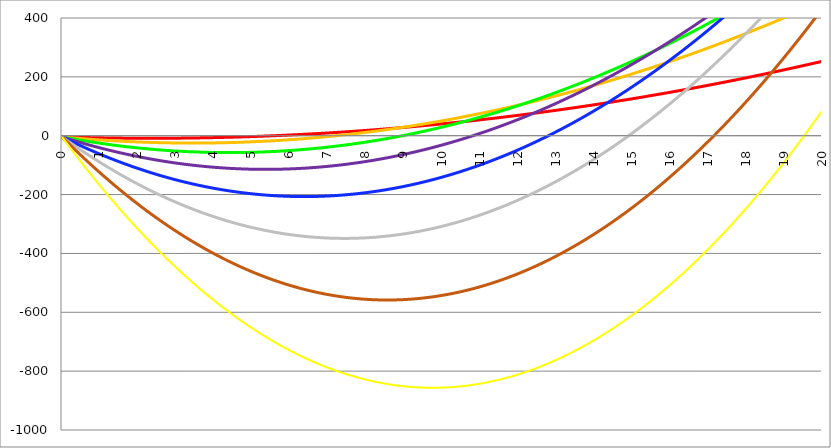
| Category | Series 1 | Series 0 | Series 3 | Series 4 | Series 5 | Series 2 | Series 6 | Series 7 |
|---|---|---|---|---|---|---|---|---|
| 0.0 | -4 | -4 | -4 | -4 | -4 | -4 | -4 | -4 |
| 0.01 | -4.04 | -4.121 | -4.242 | -4.411 | -4.636 | -4.927 | -5.294 | -5.747 |
| 0.02 | -4.079 | -4.242 | -4.484 | -4.822 | -5.272 | -5.853 | -6.586 | -7.492 |
| 0.03 | -4.118 | -4.363 | -4.726 | -5.231 | -5.906 | -6.778 | -7.877 | -9.236 |
| 0.04 | -4.157 | -4.483 | -4.967 | -5.64 | -6.54 | -7.702 | -9.167 | -10.977 |
| 0.05 | -4.196 | -4.603 | -5.207 | -6.049 | -7.172 | -8.624 | -10.454 | -12.717 |
| 0.06 | -4.235 | -4.722 | -5.447 | -6.456 | -7.803 | -9.545 | -11.741 | -14.455 |
| 0.07 | -4.274 | -4.842 | -5.686 | -6.863 | -8.434 | -10.465 | -13.026 | -16.192 |
| 0.08 | -4.312 | -4.961 | -5.924 | -7.268 | -9.063 | -11.383 | -14.309 | -17.926 |
| 0.09 | -4.351 | -5.079 | -6.162 | -7.674 | -9.691 | -12.3 | -15.591 | -19.659 |
| 0.1 | -4.389 | -5.197 | -6.4 | -8.078 | -10.319 | -13.216 | -16.871 | -21.39 |
| 0.11 | -4.427 | -5.315 | -6.637 | -8.481 | -10.945 | -14.131 | -18.15 | -23.119 |
| 0.12 | -4.464 | -5.432 | -6.873 | -8.884 | -11.571 | -15.045 | -19.427 | -24.846 |
| 0.13 | -4.502 | -5.549 | -7.109 | -9.286 | -12.195 | -15.957 | -20.703 | -26.572 |
| 0.14 | -4.539 | -5.666 | -7.344 | -9.688 | -12.818 | -16.868 | -21.977 | -28.296 |
| 0.15 | -4.577 | -5.782 | -7.579 | -10.088 | -13.441 | -17.778 | -23.25 | -30.018 |
| 0.16 | -4.614 | -5.898 | -7.813 | -10.488 | -14.062 | -18.686 | -24.521 | -31.738 |
| 0.17 | -4.651 | -6.014 | -8.047 | -10.887 | -14.682 | -19.593 | -25.791 | -33.456 |
| 0.18 | -4.688 | -6.129 | -8.28 | -11.285 | -15.302 | -20.5 | -27.059 | -35.173 |
| 0.19 | -4.724 | -6.244 | -8.513 | -11.682 | -15.92 | -21.404 | -28.326 | -36.888 |
| 0.2 | -4.761 | -6.359 | -8.745 | -12.079 | -16.538 | -22.308 | -29.591 | -38.601 |
| 0.21 | -4.797 | -6.473 | -8.976 | -12.475 | -17.154 | -23.21 | -30.855 | -40.312 |
| 0.22 | -4.833 | -6.587 | -9.207 | -12.87 | -17.769 | -24.111 | -32.117 | -42.021 |
| 0.23 | -4.869 | -6.701 | -9.437 | -13.264 | -18.384 | -25.011 | -33.377 | -43.729 |
| 0.24 | -4.905 | -6.814 | -9.667 | -13.658 | -18.997 | -25.91 | -34.637 | -45.435 |
| 0.25 | -4.94 | -6.927 | -9.896 | -14.051 | -19.609 | -26.807 | -35.894 | -47.139 |
| 0.26 | -4.976 | -7.039 | -10.125 | -14.443 | -20.221 | -27.703 | -37.15 | -48.841 |
| 0.27 | -5.011 | -7.151 | -10.353 | -14.834 | -20.831 | -28.598 | -38.405 | -50.542 |
| 0.28 | -5.046 | -7.263 | -10.581 | -15.225 | -21.441 | -29.491 | -39.658 | -52.24 |
| 0.29 | -5.081 | -7.375 | -10.808 | -15.614 | -22.049 | -30.384 | -40.91 | -53.937 |
| 0.3 | -5.116 | -7.486 | -11.034 | -16.003 | -22.656 | -31.275 | -42.16 | -55.632 |
| 0.31 | -5.15 | -7.596 | -11.26 | -16.392 | -23.263 | -32.164 | -43.408 | -57.325 |
| 0.32 | -5.185 | -7.707 | -11.485 | -16.779 | -23.868 | -33.053 | -44.655 | -59.017 |
| 0.33 | -5.219 | -7.817 | -11.71 | -17.166 | -24.472 | -33.94 | -45.901 | -60.707 |
| 0.34 | -5.253 | -7.927 | -11.934 | -17.552 | -25.076 | -34.826 | -47.145 | -62.395 |
| 0.35 | -5.287 | -8.036 | -12.158 | -17.937 | -25.678 | -35.711 | -48.387 | -64.081 |
| 0.36 | -5.321 | -8.145 | -12.381 | -18.321 | -26.28 | -36.595 | -49.628 | -65.765 |
| 0.37 | -5.354 | -8.254 | -12.604 | -18.705 | -26.88 | -37.477 | -50.868 | -67.448 |
| 0.38 | -5.388 | -8.362 | -12.826 | -19.088 | -27.479 | -38.358 | -52.106 | -69.128 |
| 0.39 | -5.421 | -8.47 | -13.047 | -19.47 | -28.078 | -39.238 | -53.342 | -70.807 |
| 0.4 | -5.454 | -8.577 | -13.268 | -19.851 | -28.675 | -40.116 | -54.577 | -72.484 |
| 0.41 | -5.487 | -8.684 | -13.489 | -20.231 | -29.271 | -40.994 | -55.811 | -74.16 |
| 0.42 | -5.52 | -8.791 | -13.709 | -20.611 | -29.867 | -41.87 | -57.042 | -75.833 |
| 0.43 | -5.552 | -8.898 | -13.928 | -20.99 | -30.461 | -42.745 | -58.273 | -77.505 |
| 0.44 | -5.584 | -9.004 | -14.147 | -21.368 | -31.055 | -43.618 | -59.502 | -79.175 |
| 0.45 | -5.617 | -9.11 | -14.365 | -21.746 | -31.647 | -44.491 | -60.729 | -80.843 |
| 0.46 | -5.649 | -9.215 | -14.582 | -22.123 | -32.238 | -45.362 | -61.955 | -82.51 |
| 0.47 | -5.681 | -9.32 | -14.799 | -22.498 | -32.829 | -46.232 | -63.179 | -84.174 |
| 0.48 | -5.712 | -9.425 | -15.016 | -22.874 | -33.418 | -47.1 | -64.402 | -85.837 |
| 0.49 | -5.744 | -9.53 | -15.232 | -23.248 | -34.006 | -47.968 | -65.624 | -87.498 |
| 0.5 | -5.775 | -9.634 | -15.447 | -23.622 | -34.594 | -48.834 | -66.843 | -89.158 |
| 0.51 | -5.807 | -9.737 | -15.662 | -23.994 | -35.18 | -49.698 | -68.062 | -90.815 |
| 0.52 | -5.838 | -9.841 | -15.877 | -24.367 | -35.766 | -50.562 | -69.278 | -92.471 |
| 0.53 | -5.869 | -9.944 | -16.09 | -24.738 | -36.35 | -51.424 | -70.494 | -94.125 |
| 0.54 | -5.899 | -10.046 | -16.304 | -25.108 | -36.933 | -52.286 | -71.708 | -95.777 |
| 0.55 | -5.93 | -10.149 | -16.516 | -25.478 | -37.516 | -53.145 | -72.92 | -97.427 |
| 0.56 | -5.96 | -10.25 | -16.728 | -25.847 | -38.097 | -54.004 | -74.131 | -99.075 |
| 0.57 | -5.99 | -10.352 | -16.94 | -26.215 | -38.677 | -54.861 | -75.34 | -100.722 |
| 0.58 | -6.02 | -10.453 | -17.151 | -26.583 | -39.257 | -55.717 | -76.548 | -102.367 |
| 0.59 | -6.05 | -10.554 | -17.361 | -26.95 | -39.835 | -56.572 | -77.754 | -104.01 |
| 0.6 | -6.08 | -10.655 | -17.571 | -27.316 | -40.413 | -57.426 | -78.958 | -105.652 |
| 0.61 | -6.11 | -10.755 | -17.781 | -27.681 | -40.989 | -58.278 | -80.162 | -107.291 |
| 0.62 | -6.139 | -10.855 | -17.989 | -28.045 | -41.564 | -59.129 | -81.363 | -108.929 |
| 0.63 | -6.168 | -10.954 | -18.198 | -28.409 | -42.139 | -59.979 | -82.563 | -110.565 |
| 0.64 | -6.197 | -11.053 | -18.405 | -28.772 | -42.712 | -60.828 | -83.762 | -112.199 |
| 0.65 | -6.226 | -11.152 | -18.612 | -29.134 | -43.284 | -61.675 | -84.959 | -113.831 |
| 0.66 | -6.255 | -11.25 | -18.819 | -29.495 | -43.856 | -62.521 | -86.155 | -115.462 |
| 0.67 | -6.283 | -11.349 | -19.025 | -29.856 | -44.426 | -63.366 | -87.349 | -117.091 |
| 0.68 | -6.312 | -11.446 | -19.231 | -30.215 | -44.996 | -64.21 | -88.542 | -118.718 |
| 0.69 | -6.34 | -11.544 | -19.436 | -30.574 | -45.564 | -65.052 | -89.733 | -120.343 |
| 0.7 | -6.368 | -11.641 | -19.64 | -30.933 | -46.131 | -65.893 | -90.922 | -121.966 |
| 0.71 | -6.396 | -11.737 | -19.844 | -31.29 | -46.698 | -66.733 | -92.11 | -123.588 |
| 0.72 | -6.423 | -11.834 | -20.047 | -31.647 | -47.263 | -67.572 | -93.297 | -125.208 |
| 0.73 | -6.451 | -11.93 | -20.25 | -32.003 | -47.827 | -68.409 | -94.482 | -126.826 |
| 0.74 | -6.478 | -12.025 | -20.452 | -32.358 | -48.391 | -69.246 | -95.666 | -128.442 |
| 0.75 | -6.506 | -12.12 | -20.654 | -32.712 | -48.953 | -70.08 | -96.848 | -130.056 |
| 0.76 | -6.533 | -12.215 | -20.855 | -33.066 | -49.515 | -70.914 | -98.028 | -131.669 |
| 0.77 | -6.559 | -12.31 | -21.055 | -33.419 | -50.075 | -71.746 | -99.207 | -133.28 |
| 0.78 | -6.586 | -12.404 | -21.255 | -33.771 | -50.634 | -72.578 | -100.385 | -134.889 |
| 0.79 | -6.613 | -12.498 | -21.454 | -34.122 | -51.193 | -73.408 | -101.56 | -136.496 |
| 0.8 | -6.639 | -12.591 | -21.653 | -34.473 | -51.75 | -74.236 | -102.735 | -138.102 |
| 0.81 | -6.665 | -12.684 | -21.852 | -34.823 | -52.306 | -75.064 | -103.908 | -139.705 |
| 0.82 | -6.691 | -12.777 | -22.049 | -35.172 | -52.862 | -75.89 | -105.079 | -141.307 |
| 0.83 | -6.717 | -12.87 | -22.247 | -35.52 | -53.416 | -76.715 | -106.249 | -142.907 |
| 0.84 | -6.743 | -12.962 | -22.443 | -35.868 | -53.97 | -77.538 | -107.418 | -144.506 |
| 0.85 | -6.768 | -13.054 | -22.639 | -36.214 | -54.522 | -78.361 | -108.585 | -146.102 |
| 0.86 | -6.794 | -13.145 | -22.835 | -36.56 | -55.073 | -79.182 | -109.75 | -147.697 |
| 0.87 | -6.819 | -13.236 | -23.03 | -36.905 | -55.624 | -80.002 | -110.914 | -149.29 |
| 0.88 | -6.844 | -13.327 | -23.224 | -37.25 | -56.173 | -80.82 | -112.076 | -150.881 |
| 0.89 | -6.869 | -13.417 | -23.418 | -37.594 | -56.721 | -81.638 | -113.237 | -152.471 |
| 0.900000000000001 | -6.893 | -13.507 | -23.612 | -37.936 | -57.269 | -82.454 | -114.396 | -154.058 |
| 0.910000000000001 | -6.918 | -13.596 | -23.804 | -38.279 | -57.815 | -83.269 | -115.554 | -155.644 |
| 0.920000000000001 | -6.942 | -13.686 | -23.997 | -38.62 | -58.361 | -84.083 | -116.711 | -157.228 |
| 0.930000000000001 | -6.966 | -13.775 | -24.188 | -38.961 | -58.905 | -84.895 | -117.865 | -158.81 |
| 0.940000000000001 | -6.99 | -13.863 | -24.379 | -39.3 | -59.448 | -85.706 | -119.019 | -160.39 |
| 0.950000000000001 | -7.014 | -13.951 | -24.57 | -39.639 | -59.991 | -86.516 | -120.17 | -161.969 |
| 0.960000000000001 | -7.038 | -14.039 | -24.76 | -39.978 | -60.532 | -87.325 | -121.321 | -163.546 |
| 0.970000000000001 | -7.061 | -14.127 | -24.95 | -40.315 | -61.072 | -88.132 | -122.469 | -165.121 |
| 0.980000000000001 | -7.085 | -14.214 | -25.139 | -40.652 | -61.612 | -88.939 | -123.617 | -166.694 |
| 0.990000000000001 | -7.108 | -14.301 | -25.327 | -40.988 | -62.15 | -89.744 | -124.762 | -168.266 |
| 1.000000000000001 | -7.131 | -14.387 | -25.515 | -41.323 | -62.688 | -90.547 | -125.907 | -169.835 |
| 1.010000000000001 | -7.154 | -14.473 | -25.702 | -41.658 | -63.224 | -91.35 | -127.049 | -171.403 |
| 1.020000000000001 | -7.176 | -14.559 | -25.889 | -41.991 | -63.759 | -92.151 | -128.191 | -172.969 |
| 1.030000000000001 | -7.199 | -14.644 | -26.075 | -42.324 | -64.294 | -92.951 | -129.33 | -174.533 |
| 1.040000000000001 | -7.221 | -14.729 | -26.26 | -42.656 | -64.827 | -93.75 | -130.468 | -176.096 |
| 1.050000000000001 | -7.243 | -14.814 | -26.446 | -42.988 | -65.359 | -94.547 | -131.605 | -177.657 |
| 1.060000000000001 | -7.265 | -14.898 | -26.63 | -43.318 | -65.891 | -95.343 | -132.74 | -179.215 |
| 1.070000000000001 | -7.287 | -14.982 | -26.814 | -43.648 | -66.421 | -96.138 | -133.874 | -180.773 |
| 1.080000000000001 | -7.309 | -15.066 | -26.997 | -43.977 | -66.951 | -96.932 | -135.006 | -182.328 |
| 1.090000000000001 | -7.33 | -15.149 | -27.18 | -44.306 | -67.479 | -97.724 | -136.137 | -183.881 |
| 1.100000000000001 | -7.351 | -15.232 | -27.363 | -44.633 | -68.006 | -98.516 | -137.266 | -185.433 |
| 1.110000000000001 | -7.373 | -15.315 | -27.544 | -44.96 | -68.533 | -99.305 | -138.393 | -186.983 |
| 1.120000000000001 | -7.393 | -15.397 | -27.726 | -45.286 | -69.058 | -100.094 | -139.519 | -188.531 |
| 1.130000000000001 | -7.414 | -15.479 | -27.906 | -45.611 | -69.582 | -100.882 | -140.644 | -190.078 |
| 1.140000000000001 | -7.435 | -15.561 | -28.086 | -45.936 | -70.106 | -101.668 | -141.767 | -191.622 |
| 1.150000000000001 | -7.455 | -15.642 | -28.266 | -46.259 | -70.628 | -102.453 | -142.889 | -193.165 |
| 1.160000000000001 | -7.476 | -15.722 | -28.445 | -46.582 | -71.15 | -103.237 | -144.009 | -194.706 |
| 1.170000000000001 | -7.496 | -15.803 | -28.623 | -46.904 | -71.67 | -104.019 | -145.127 | -196.245 |
| 1.180000000000001 | -7.516 | -15.883 | -28.801 | -47.226 | -72.189 | -104.8 | -146.244 | -197.782 |
| 1.190000000000001 | -7.536 | -15.963 | -28.978 | -47.546 | -72.708 | -105.58 | -147.36 | -199.318 |
| 1.200000000000001 | -7.555 | -16.042 | -29.155 | -47.866 | -73.225 | -106.359 | -148.474 | -200.852 |
| 1.210000000000001 | -7.575 | -16.121 | -29.331 | -48.185 | -73.741 | -107.137 | -149.586 | -202.384 |
| 1.220000000000001 | -7.594 | -16.2 | -29.507 | -48.504 | -74.257 | -107.913 | -150.697 | -203.914 |
| 1.230000000000001 | -7.613 | -16.278 | -29.682 | -48.821 | -74.771 | -108.688 | -151.807 | -205.443 |
| 1.240000000000001 | -7.632 | -16.356 | -29.857 | -49.138 | -75.285 | -109.462 | -152.914 | -206.969 |
| 1.250000000000001 | -7.651 | -16.434 | -30.031 | -49.454 | -75.797 | -110.234 | -154.021 | -208.494 |
| 1.260000000000001 | -7.669 | -16.511 | -30.204 | -49.769 | -76.308 | -111.005 | -155.126 | -210.017 |
| 1.270000000000001 | -7.688 | -16.588 | -30.377 | -50.084 | -76.819 | -111.775 | -156.229 | -211.538 |
| 1.280000000000001 | -7.706 | -16.665 | -30.55 | -50.397 | -77.328 | -112.544 | -157.331 | -213.058 |
| 1.290000000000001 | -7.724 | -16.741 | -30.721 | -50.71 | -77.836 | -113.312 | -158.431 | -214.575 |
| 1.300000000000001 | -7.742 | -16.817 | -30.893 | -51.023 | -78.344 | -114.078 | -159.53 | -216.091 |
| 1.310000000000001 | -7.76 | -16.892 | -31.063 | -51.334 | -78.85 | -114.843 | -160.628 | -217.605 |
| 1.320000000000001 | -7.778 | -16.968 | -31.234 | -51.645 | -79.356 | -115.607 | -161.724 | -219.118 |
| 1.330000000000001 | -7.795 | -17.043 | -31.403 | -51.954 | -79.86 | -116.369 | -162.818 | -220.628 |
| 1.340000000000001 | -7.812 | -17.117 | -31.572 | -52.264 | -80.363 | -117.13 | -163.911 | -222.137 |
| 1.350000000000001 | -7.83 | -17.191 | -31.741 | -52.572 | -80.866 | -117.89 | -165.002 | -223.644 |
| 1.360000000000001 | -7.846 | -17.265 | -31.909 | -52.879 | -81.367 | -118.649 | -166.092 | -225.149 |
| 1.370000000000001 | -7.863 | -17.338 | -32.076 | -53.186 | -81.867 | -119.407 | -167.18 | -226.652 |
| 1.380000000000001 | -7.88 | -17.411 | -32.243 | -53.492 | -82.367 | -120.163 | -168.267 | -228.154 |
| 1.390000000000001 | -7.896 | -17.484 | -32.409 | -53.798 | -82.865 | -120.918 | -169.352 | -229.654 |
| 1.400000000000001 | -7.913 | -17.556 | -32.575 | -54.102 | -83.363 | -121.672 | -170.436 | -231.152 |
| 1.410000000000001 | -7.929 | -17.628 | -32.74 | -54.406 | -83.859 | -122.424 | -171.518 | -232.648 |
| 1.420000000000001 | -7.945 | -17.7 | -32.905 | -54.709 | -84.354 | -123.175 | -172.599 | -234.142 |
| 1.430000000000001 | -7.96 | -17.771 | -33.069 | -55.011 | -84.849 | -123.926 | -173.678 | -235.635 |
| 1.440000000000001 | -7.976 | -17.842 | -33.232 | -55.312 | -85.342 | -124.674 | -174.756 | -237.126 |
| 1.450000000000001 | -7.991 | -17.913 | -33.395 | -55.613 | -85.834 | -125.422 | -175.832 | -238.615 |
| 1.460000000000001 | -8.007 | -17.983 | -33.558 | -55.913 | -86.326 | -126.168 | -176.906 | -240.102 |
| 1.470000000000001 | -8.022 | -18.053 | -33.72 | -56.212 | -86.816 | -126.913 | -177.98 | -241.587 |
| 1.480000000000001 | -8.037 | -18.123 | -33.881 | -56.51 | -87.306 | -127.657 | -179.051 | -243.071 |
| 1.490000000000001 | -8.051 | -18.192 | -34.042 | -56.808 | -87.794 | -128.4 | -180.121 | -244.553 |
| 1.500000000000001 | -8.066 | -18.261 | -34.202 | -57.105 | -88.281 | -129.141 | -181.19 | -246.033 |
| 1.510000000000001 | -8.08 | -18.329 | -34.362 | -57.401 | -88.768 | -129.881 | -182.257 | -247.511 |
| 1.520000000000001 | -8.095 | -18.397 | -34.521 | -57.696 | -89.253 | -130.62 | -183.323 | -248.988 |
| 1.530000000000001 | -8.109 | -18.465 | -34.679 | -57.991 | -89.737 | -131.357 | -184.387 | -250.462 |
| 1.540000000000001 | -8.123 | -18.533 | -34.837 | -58.284 | -90.221 | -132.094 | -185.449 | -251.935 |
| 1.550000000000001 | -8.136 | -18.6 | -34.995 | -58.577 | -90.703 | -132.829 | -186.51 | -253.406 |
| 1.560000000000001 | -8.15 | -18.666 | -35.152 | -58.87 | -91.185 | -133.562 | -187.57 | -254.875 |
| 1.570000000000001 | -8.163 | -18.733 | -35.308 | -59.161 | -91.665 | -134.295 | -188.628 | -256.343 |
| 1.580000000000001 | -8.177 | -18.799 | -35.464 | -59.452 | -92.144 | -135.026 | -189.685 | -257.809 |
| 1.590000000000001 | -8.19 | -18.865 | -35.619 | -59.742 | -92.623 | -135.756 | -190.74 | -259.273 |
| 1.600000000000001 | -8.203 | -18.93 | -35.774 | -60.031 | -93.1 | -136.485 | -191.793 | -260.735 |
| 1.610000000000001 | -8.215 | -18.995 | -35.928 | -60.319 | -93.576 | -137.213 | -192.845 | -262.195 |
| 1.620000000000001 | -8.228 | -19.06 | -36.082 | -60.607 | -94.052 | -137.939 | -193.896 | -263.654 |
| 1.630000000000001 | -8.24 | -19.124 | -36.235 | -60.894 | -94.526 | -138.664 | -194.945 | -265.11 |
| 1.640000000000001 | -8.253 | -19.188 | -36.387 | -61.18 | -95 | -139.388 | -195.992 | -266.565 |
| 1.650000000000001 | -8.265 | -19.251 | -36.539 | -61.465 | -95.472 | -140.11 | -197.038 | -268.018 |
| 1.660000000000001 | -8.277 | -19.314 | -36.691 | -61.749 | -95.943 | -140.832 | -198.082 | -269.47 |
| 1.670000000000001 | -8.288 | -19.377 | -36.841 | -62.033 | -96.414 | -141.552 | -199.125 | -270.919 |
| 1.680000000000001 | -8.3 | -19.44 | -36.992 | -62.316 | -96.883 | -142.271 | -200.167 | -272.367 |
| 1.690000000000001 | -8.311 | -19.502 | -37.141 | -62.598 | -97.351 | -142.988 | -201.207 | -273.813 |
| 1.700000000000001 | -8.323 | -19.564 | -37.291 | -62.88 | -97.819 | -143.705 | -202.245 | -275.257 |
| 1.710000000000001 | -8.334 | -19.625 | -37.439 | -63.161 | -98.285 | -144.42 | -203.282 | -276.7 |
| 1.720000000000001 | -8.345 | -19.686 | -37.587 | -63.44 | -98.751 | -145.134 | -204.317 | -278.14 |
| 1.730000000000001 | -8.355 | -19.747 | -37.735 | -63.72 | -99.215 | -145.846 | -205.351 | -279.579 |
| 1.740000000000001 | -8.366 | -19.808 | -37.882 | -63.998 | -99.678 | -146.558 | -206.383 | -281.016 |
| 1.750000000000001 | -8.376 | -19.868 | -38.028 | -64.276 | -100.141 | -147.268 | -207.414 | -282.452 |
| 1.760000000000001 | -8.386 | -19.927 | -38.174 | -64.552 | -100.602 | -147.976 | -208.444 | -283.885 |
| 1.770000000000001 | -8.397 | -19.987 | -38.319 | -64.829 | -101.062 | -148.684 | -209.471 | -285.317 |
| 1.780000000000001 | -8.406 | -20.046 | -38.464 | -65.104 | -101.522 | -149.39 | -210.498 | -286.747 |
| 1.790000000000001 | -8.416 | -20.104 | -38.608 | -65.378 | -101.98 | -150.096 | -211.522 | -288.175 |
| 1.800000000000001 | -8.426 | -20.163 | -38.752 | -65.652 | -102.438 | -150.799 | -212.546 | -289.601 |
| 1.810000000000001 | -8.435 | -20.22 | -38.895 | -65.925 | -102.894 | -151.502 | -213.567 | -291.025 |
| 1.820000000000001 | -8.444 | -20.278 | -39.038 | -66.197 | -103.349 | -152.203 | -214.588 | -292.448 |
| 1.830000000000001 | -8.453 | -20.335 | -39.18 | -66.469 | -103.804 | -152.903 | -215.606 | -293.869 |
| 1.840000000000001 | -8.462 | -20.392 | -39.321 | -66.74 | -104.257 | -153.602 | -216.624 | -295.288 |
| 1.850000000000001 | -8.471 | -20.449 | -39.462 | -67.01 | -104.709 | -154.3 | -217.639 | -296.706 |
| 1.860000000000001 | -8.479 | -20.505 | -39.602 | -67.279 | -105.161 | -154.996 | -218.653 | -298.121 |
| 1.870000000000001 | -8.488 | -20.561 | -39.742 | -67.547 | -105.611 | -155.691 | -219.666 | -299.535 |
| 1.880000000000001 | -8.496 | -20.616 | -39.881 | -67.815 | -106.061 | -156.385 | -220.677 | -300.947 |
| 1.890000000000001 | -8.504 | -20.671 | -40.02 | -68.082 | -106.509 | -157.078 | -221.687 | -302.357 |
| 1.900000000000001 | -8.512 | -20.726 | -40.158 | -68.348 | -106.956 | -157.769 | -222.695 | -303.765 |
| 1.910000000000001 | -8.52 | -20.78 | -40.296 | -68.613 | -107.403 | -158.459 | -223.702 | -305.172 |
| 1.920000000000001 | -8.527 | -20.835 | -40.433 | -68.878 | -107.848 | -159.148 | -224.707 | -306.577 |
| 1.930000000000001 | -8.535 | -20.888 | -40.569 | -69.141 | -108.292 | -159.836 | -225.71 | -307.98 |
| 1.940000000000001 | -8.542 | -20.942 | -40.705 | -69.404 | -108.736 | -160.522 | -226.713 | -309.381 |
| 1.950000000000001 | -8.549 | -20.995 | -40.841 | -69.667 | -109.178 | -161.207 | -227.713 | -310.78 |
| 1.960000000000001 | -8.556 | -21.047 | -40.976 | -69.928 | -109.62 | -161.891 | -228.712 | -312.178 |
| 1.970000000000001 | -8.562 | -21.1 | -41.11 | -70.189 | -110.06 | -162.574 | -229.71 | -313.574 |
| 1.980000000000001 | -8.569 | -21.152 | -41.244 | -70.449 | -110.499 | -163.255 | -230.706 | -314.968 |
| 1.990000000000001 | -8.575 | -21.203 | -41.377 | -70.708 | -110.938 | -163.936 | -231.7 | -316.36 |
| 2.000000000000001 | -8.581 | -21.254 | -41.509 | -70.966 | -111.375 | -164.614 | -232.693 | -317.75 |
| 2.010000000000001 | -8.587 | -21.305 | -41.641 | -71.224 | -111.811 | -165.292 | -233.685 | -319.139 |
| 2.020000000000001 | -8.593 | -21.356 | -41.773 | -71.481 | -112.247 | -165.968 | -234.675 | -320.526 |
| 2.030000000000001 | -8.599 | -21.406 | -41.904 | -71.737 | -112.681 | -166.644 | -235.663 | -321.911 |
| 2.04 | -8.604 | -21.456 | -42.034 | -71.992 | -113.115 | -167.318 | -236.65 | -323.294 |
| 2.05 | -8.61 | -21.505 | -42.164 | -72.247 | -113.547 | -167.99 | -237.636 | -324.676 |
| 2.06 | -8.615 | -21.554 | -42.294 | -72.501 | -113.978 | -168.662 | -238.62 | -326.055 |
| 2.07 | -8.62 | -21.603 | -42.422 | -72.754 | -114.409 | -169.332 | -239.602 | -327.433 |
| 2.08 | -8.625 | -21.652 | -42.551 | -73.006 | -114.838 | -170.001 | -240.583 | -328.809 |
| 2.089999999999999 | -8.63 | -21.7 | -42.678 | -73.258 | -115.266 | -170.668 | -241.563 | -330.184 |
| 2.099999999999999 | -8.634 | -21.748 | -42.805 | -73.508 | -115.694 | -171.335 | -242.54 | -331.556 |
| 2.109999999999999 | -8.638 | -21.795 | -42.932 | -73.758 | -116.12 | -172 | -243.517 | -332.927 |
| 2.119999999999999 | -8.643 | -21.842 | -43.058 | -74.007 | -116.546 | -172.664 | -244.492 | -334.296 |
| 2.129999999999999 | -8.647 | -21.889 | -43.183 | -74.256 | -116.97 | -173.326 | -245.465 | -335.663 |
| 2.139999999999998 | -8.65 | -21.935 | -43.308 | -74.504 | -117.393 | -173.988 | -246.437 | -337.029 |
| 2.149999999999998 | -8.654 | -21.981 | -43.433 | -74.75 | -117.816 | -174.648 | -247.407 | -338.392 |
| 2.159999999999998 | -8.658 | -22.026 | -43.556 | -74.997 | -118.237 | -175.307 | -248.376 | -339.754 |
| 2.169999999999998 | -8.661 | -22.072 | -43.68 | -75.242 | -118.657 | -175.965 | -249.343 | -341.114 |
| 2.179999999999997 | -8.664 | -22.117 | -43.802 | -75.487 | -119.077 | -176.621 | -250.309 | -342.472 |
| 2.189999999999997 | -8.667 | -22.161 | -43.924 | -75.73 | -119.495 | -177.276 | -251.274 | -343.828 |
| 2.199999999999997 | -8.67 | -22.205 | -44.046 | -75.973 | -119.913 | -177.93 | -252.236 | -345.183 |
| 2.209999999999997 | -8.673 | -22.249 | -44.167 | -76.216 | -120.329 | -178.583 | -253.198 | -346.536 |
| 2.219999999999997 | -8.675 | -22.293 | -44.287 | -76.457 | -120.744 | -179.234 | -254.157 | -347.887 |
| 2.229999999999996 | -8.677 | -22.336 | -44.407 | -76.698 | -121.159 | -179.885 | -255.116 | -349.236 |
| 2.239999999999996 | -8.68 | -22.379 | -44.527 | -76.938 | -121.572 | -180.534 | -256.072 | -350.584 |
| 2.249999999999996 | -8.682 | -22.421 | -44.646 | -77.177 | -121.984 | -181.181 | -257.028 | -351.929 |
| 2.259999999999996 | -8.683 | -22.463 | -44.764 | -77.416 | -122.396 | -181.828 | -257.981 | -353.273 |
| 2.269999999999996 | -8.685 | -22.505 | -44.882 | -77.653 | -122.806 | -182.473 | -258.933 | -354.615 |
| 2.279999999999995 | -8.687 | -22.546 | -44.999 | -77.89 | -123.216 | -183.117 | -259.884 | -355.955 |
| 2.289999999999995 | -8.688 | -22.587 | -45.115 | -78.126 | -123.624 | -183.76 | -260.833 | -357.294 |
| 2.299999999999995 | -8.689 | -22.628 | -45.231 | -78.362 | -124.031 | -184.401 | -261.781 | -358.631 |
| 2.309999999999995 | -8.69 | -22.668 | -45.347 | -78.596 | -124.438 | -185.041 | -262.727 | -359.965 |
| 2.319999999999994 | -8.691 | -22.708 | -45.462 | -78.83 | -124.843 | -185.68 | -263.672 | -361.299 |
| 2.329999999999994 | -8.691 | -22.748 | -45.576 | -79.063 | -125.247 | -186.318 | -264.615 | -362.63 |
| 2.339999999999994 | -8.692 | -22.787 | -45.69 | -79.296 | -125.651 | -186.954 | -265.557 | -363.959 |
| 2.349999999999994 | -8.692 | -22.826 | -45.803 | -79.527 | -126.053 | -187.59 | -266.497 | -365.287 |
| 2.359999999999994 | -8.692 | -22.865 | -45.916 | -79.758 | -126.454 | -188.223 | -267.435 | -366.613 |
| 2.369999999999993 | -8.692 | -22.903 | -46.028 | -79.988 | -126.855 | -188.856 | -268.372 | -367.937 |
| 2.379999999999993 | -8.692 | -22.941 | -46.14 | -80.217 | -127.254 | -189.488 | -269.308 | -369.26 |
| 2.389999999999993 | -8.692 | -22.979 | -46.251 | -80.446 | -127.653 | -190.118 | -270.242 | -370.58 |
| 2.399999999999993 | -8.691 | -23.016 | -46.362 | -80.673 | -128.05 | -190.747 | -271.174 | -371.899 |
| 2.409999999999993 | -8.691 | -23.052 | -46.472 | -80.9 | -128.446 | -191.375 | -272.106 | -373.216 |
| 2.419999999999992 | -8.69 | -23.089 | -46.581 | -81.126 | -128.842 | -192.001 | -273.035 | -374.531 |
| 2.429999999999992 | -8.689 | -23.125 | -46.69 | -81.352 | -129.236 | -192.626 | -273.963 | -375.844 |
| 2.439999999999992 | -8.687 | -23.161 | -46.798 | -81.576 | -129.63 | -193.25 | -274.89 | -377.156 |
| 2.449999999999992 | -8.686 | -23.196 | -46.906 | -81.8 | -130.022 | -193.873 | -275.815 | -378.466 |
| 2.459999999999991 | -8.685 | -23.231 | -47.013 | -82.023 | -130.413 | -194.495 | -276.738 | -379.774 |
| 2.469999999999991 | -8.683 | -23.266 | -47.12 | -82.246 | -130.804 | -195.115 | -277.66 | -381.08 |
| 2.479999999999991 | -8.681 | -23.3 | -47.226 | -82.467 | -131.193 | -195.734 | -278.58 | -382.385 |
| 2.489999999999991 | -8.679 | -23.334 | -47.332 | -82.688 | -131.581 | -196.352 | -279.499 | -383.687 |
| 2.499999999999991 | -8.677 | -23.368 | -47.437 | -82.908 | -131.969 | -196.968 | -280.417 | -384.988 |
| 2.50999999999999 | -8.674 | -23.401 | -47.541 | -83.127 | -132.355 | -197.583 | -281.333 | -386.287 |
| 2.51999999999999 | -8.672 | -23.434 | -47.645 | -83.346 | -132.74 | -198.197 | -282.247 | -387.584 |
| 2.52999999999999 | -8.669 | -23.467 | -47.749 | -83.563 | -133.125 | -198.81 | -283.16 | -388.88 |
| 2.53999999999999 | -8.666 | -23.499 | -47.851 | -83.78 | -133.508 | -199.422 | -284.071 | -390.173 |
| 2.54999999999999 | -8.663 | -23.531 | -47.954 | -83.997 | -133.891 | -200.032 | -284.981 | -391.465 |
| 2.559999999999989 | -8.66 | -23.562 | -48.055 | -84.212 | -134.272 | -200.641 | -285.89 | -392.755 |
| 2.569999999999989 | -8.657 | -23.594 | -48.156 | -84.427 | -134.652 | -201.249 | -286.796 | -394.044 |
| 2.579999999999989 | -8.653 | -23.625 | -48.257 | -84.64 | -135.032 | -201.855 | -287.702 | -395.33 |
| 2.589999999999989 | -8.649 | -23.655 | -48.357 | -84.854 | -135.41 | -202.46 | -288.606 | -396.615 |
| 2.599999999999989 | -8.645 | -23.685 | -48.457 | -85.066 | -135.787 | -203.064 | -289.508 | -397.898 |
| 2.609999999999988 | -8.641 | -23.715 | -48.556 | -85.277 | -136.164 | -203.667 | -290.409 | -399.179 |
| 2.619999999999988 | -8.637 | -23.744 | -48.654 | -85.488 | -136.539 | -204.269 | -291.308 | -400.458 |
| 2.629999999999988 | -8.633 | -23.773 | -48.752 | -85.698 | -136.914 | -204.869 | -292.206 | -401.736 |
| 2.639999999999988 | -8.628 | -23.802 | -48.849 | -85.908 | -137.287 | -205.468 | -293.102 | -403.012 |
| 2.649999999999987 | -8.623 | -23.83 | -48.946 | -86.116 | -137.659 | -206.066 | -293.997 | -404.286 |
| 2.659999999999987 | -8.619 | -23.858 | -49.042 | -86.324 | -138.031 | -206.662 | -294.89 | -405.558 |
| 2.669999999999987 | -8.613 | -23.886 | -49.138 | -86.531 | -138.401 | -207.257 | -295.782 | -406.828 |
| 2.679999999999987 | -8.608 | -23.913 | -49.233 | -86.737 | -138.77 | -207.852 | -296.672 | -408.097 |
| 2.689999999999987 | -8.603 | -23.94 | -49.327 | -86.942 | -139.139 | -208.444 | -297.561 | -409.364 |
| 2.699999999999986 | -8.597 | -23.967 | -49.421 | -87.147 | -139.506 | -209.036 | -298.448 | -410.629 |
| 2.709999999999986 | -8.592 | -23.993 | -49.515 | -87.351 | -139.873 | -209.626 | -299.333 | -411.892 |
| 2.719999999999986 | -8.586 | -24.019 | -49.608 | -87.554 | -140.238 | -210.215 | -300.218 | -413.153 |
| 2.729999999999986 | -8.58 | -24.045 | -49.7 | -87.756 | -140.602 | -210.803 | -301.1 | -414.413 |
| 2.739999999999985 | -8.573 | -24.07 | -49.792 | -87.958 | -140.966 | -211.39 | -301.981 | -415.671 |
| 2.749999999999985 | -8.567 | -24.095 | -49.883 | -88.159 | -141.328 | -211.975 | -302.861 | -416.927 |
| 2.759999999999985 | -8.56 | -24.119 | -49.974 | -88.359 | -141.689 | -212.559 | -303.739 | -418.181 |
| 2.769999999999985 | -8.554 | -24.143 | -50.064 | -88.558 | -142.05 | -213.142 | -304.616 | -419.434 |
| 2.779999999999985 | -8.547 | -24.167 | -50.153 | -88.757 | -142.409 | -213.723 | -305.491 | -420.684 |
| 2.789999999999984 | -8.54 | -24.191 | -50.242 | -88.954 | -142.768 | -214.304 | -306.364 | -421.933 |
| 2.799999999999984 | -8.532 | -24.214 | -50.331 | -89.151 | -143.125 | -214.883 | -307.236 | -423.18 |
| 2.809999999999984 | -8.525 | -24.236 | -50.419 | -89.348 | -143.481 | -215.46 | -308.107 | -424.425 |
| 2.819999999999984 | -8.517 | -24.259 | -50.506 | -89.543 | -143.837 | -216.037 | -308.976 | -425.669 |
| 2.829999999999984 | -8.51 | -24.281 | -50.593 | -89.738 | -144.191 | -216.612 | -309.843 | -426.911 |
| 2.839999999999983 | -8.502 | -24.303 | -50.679 | -89.932 | -144.544 | -217.186 | -310.709 | -428.151 |
| 2.849999999999983 | -8.494 | -24.324 | -50.765 | -90.125 | -144.897 | -217.759 | -311.574 | -429.389 |
| 2.859999999999983 | -8.485 | -24.345 | -50.85 | -90.317 | -145.248 | -218.331 | -312.437 | -430.625 |
| 2.869999999999983 | -8.477 | -24.366 | -50.935 | -90.509 | -145.599 | -218.901 | -313.298 | -431.86 |
| 2.879999999999983 | -8.468 | -24.386 | -51.019 | -90.7 | -145.948 | -219.47 | -314.158 | -433.092 |
| 2.889999999999982 | -8.46 | -24.406 | -51.102 | -90.89 | -146.296 | -220.038 | -315.017 | -434.323 |
| 2.899999999999982 | -8.451 | -24.425 | -51.185 | -91.079 | -146.644 | -220.604 | -315.874 | -435.552 |
| 2.909999999999982 | -8.442 | -24.444 | -51.267 | -91.267 | -146.99 | -221.17 | -316.729 | -436.78 |
| 2.919999999999982 | -8.432 | -24.463 | -51.349 | -91.455 | -147.335 | -221.734 | -317.583 | -438.005 |
| 2.929999999999981 | -8.423 | -24.482 | -51.431 | -91.642 | -147.68 | -222.297 | -318.436 | -439.229 |
| 2.939999999999981 | -8.413 | -24.5 | -51.511 | -91.828 | -148.023 | -222.858 | -319.286 | -440.451 |
| 2.949999999999981 | -8.403 | -24.518 | -51.591 | -92.014 | -148.366 | -223.419 | -320.136 | -441.671 |
| 2.959999999999981 | -8.394 | -24.535 | -51.671 | -92.199 | -148.707 | -223.978 | -320.984 | -442.89 |
| 2.969999999999981 | -8.383 | -24.552 | -51.75 | -92.382 | -149.047 | -224.536 | -321.83 | -444.106 |
| 2.97999999999998 | -8.373 | -24.569 | -51.829 | -92.566 | -149.387 | -225.092 | -322.675 | -445.321 |
| 2.98999999999998 | -8.363 | -24.586 | -51.907 | -92.748 | -149.725 | -225.648 | -323.518 | -446.534 |
| 2.99999999999998 | -8.352 | -24.602 | -51.984 | -92.93 | -150.062 | -226.202 | -324.36 | -447.746 |
| 3.00999999999998 | -8.341 | -24.617 | -52.061 | -93.11 | -150.399 | -226.754 | -325.2 | -448.955 |
| 3.01999999999998 | -8.33 | -24.633 | -52.137 | -93.291 | -150.734 | -227.306 | -326.039 | -450.163 |
| 3.029999999999979 | -8.319 | -24.648 | -52.213 | -93.47 | -151.069 | -227.856 | -326.876 | -451.369 |
| 3.039999999999979 | -8.308 | -24.662 | -52.288 | -93.648 | -151.402 | -228.406 | -327.712 | -452.573 |
| 3.049999999999979 | -8.297 | -24.677 | -52.363 | -93.826 | -151.734 | -228.953 | -328.547 | -453.775 |
| 3.059999999999979 | -8.285 | -24.69 | -52.437 | -94.003 | -152.066 | -229.5 | -329.379 | -454.975 |
| 3.069999999999979 | -8.273 | -24.704 | -52.511 | -94.179 | -152.396 | -230.045 | -330.211 | -456.174 |
| 3.079999999999978 | -8.261 | -24.717 | -52.584 | -94.355 | -152.725 | -230.589 | -331.04 | -457.371 |
| 3.089999999999978 | -8.249 | -24.73 | -52.656 | -94.53 | -153.054 | -231.132 | -331.868 | -458.566 |
| 3.099999999999978 | -8.237 | -24.743 | -52.728 | -94.704 | -153.381 | -231.674 | -332.695 | -459.76 |
| 3.109999999999978 | -8.224 | -24.755 | -52.799 | -94.877 | -153.708 | -232.214 | -333.52 | -460.951 |
| 3.119999999999977 | -8.212 | -24.767 | -52.87 | -95.049 | -154.033 | -232.753 | -334.344 | -462.141 |
| 3.129999999999977 | -8.199 | -24.778 | -52.94 | -95.221 | -154.357 | -233.291 | -335.166 | -463.329 |
| 3.139999999999977 | -8.186 | -24.789 | -53.01 | -95.392 | -154.681 | -233.828 | -335.987 | -464.515 |
| 3.149999999999977 | -8.173 | -24.8 | -53.079 | -95.562 | -155.003 | -234.363 | -336.806 | -465.699 |
| 3.159999999999977 | -8.16 | -24.81 | -53.148 | -95.731 | -155.324 | -234.897 | -337.624 | -466.882 |
| 3.169999999999976 | -8.146 | -24.821 | -53.216 | -95.9 | -155.645 | -235.43 | -338.44 | -468.063 |
| 3.179999999999976 | -8.132 | -24.83 | -53.283 | -96.067 | -155.964 | -235.962 | -339.254 | -469.242 |
| 3.189999999999976 | -8.119 | -24.84 | -53.35 | -96.234 | -156.283 | -236.492 | -340.067 | -470.419 |
| 3.199999999999976 | -8.105 | -24.849 | -53.417 | -96.401 | -156.6 | -237.021 | -340.879 | -471.594 |
| 3.209999999999976 | -8.091 | -24.857 | -53.482 | -96.566 | -156.916 | -237.549 | -341.689 | -472.768 |
| 3.219999999999975 | -8.076 | -24.866 | -53.548 | -96.731 | -157.232 | -238.076 | -342.498 | -473.94 |
| 3.229999999999975 | -8.062 | -24.874 | -53.612 | -96.895 | -157.546 | -238.601 | -343.305 | -475.11 |
| 3.239999999999975 | -8.047 | -24.881 | -53.677 | -97.058 | -157.859 | -239.126 | -344.11 | -476.278 |
| 3.249999999999975 | -8.032 | -24.888 | -53.74 | -97.22 | -158.172 | -239.648 | -344.914 | -477.444 |
| 3.259999999999974 | -8.017 | -24.895 | -53.803 | -97.382 | -158.483 | -240.17 | -345.717 | -478.609 |
| 3.269999999999974 | -8.002 | -24.902 | -53.866 | -97.543 | -158.794 | -240.69 | -346.518 | -479.772 |
| 3.279999999999974 | -7.987 | -24.908 | -53.928 | -97.703 | -159.103 | -241.21 | -347.317 | -480.933 |
| 3.289999999999974 | -7.971 | -24.914 | -53.989 | -97.862 | -159.411 | -241.728 | -348.115 | -482.092 |
| 3.299999999999974 | -7.956 | -24.919 | -54.05 | -98.021 | -159.719 | -242.244 | -348.912 | -483.25 |
| 3.309999999999973 | -7.94 | -24.924 | -54.11 | -98.179 | -160.025 | -242.76 | -349.707 | -484.405 |
| 3.319999999999973 | -7.924 | -24.929 | -54.17 | -98.336 | -160.33 | -243.274 | -350.5 | -485.559 |
| 3.329999999999973 | -7.908 | -24.934 | -54.229 | -98.492 | -160.635 | -243.787 | -351.292 | -486.711 |
| 3.339999999999973 | -7.891 | -24.938 | -54.288 | -98.648 | -160.938 | -244.298 | -352.082 | -487.862 |
| 3.349999999999972 | -7.875 | -24.942 | -54.346 | -98.802 | -161.241 | -244.809 | -352.871 | -489.01 |
| 3.359999999999972 | -7.858 | -24.945 | -54.404 | -98.956 | -161.542 | -245.318 | -353.659 | -490.157 |
| 3.369999999999972 | -7.841 | -24.948 | -54.461 | -99.109 | -161.842 | -245.826 | -354.445 | -491.302 |
| 3.379999999999972 | -7.824 | -24.951 | -54.517 | -99.262 | -162.142 | -246.332 | -355.229 | -492.445 |
| 3.389999999999972 | -7.807 | -24.953 | -54.573 | -99.414 | -162.44 | -246.838 | -356.012 | -493.587 |
| 3.399999999999971 | -7.79 | -24.955 | -54.628 | -99.564 | -162.737 | -247.342 | -356.793 | -494.726 |
| 3.409999999999971 | -7.772 | -24.956 | -54.683 | -99.715 | -163.034 | -247.845 | -357.573 | -495.864 |
| 3.419999999999971 | -7.755 | -24.958 | -54.737 | -99.864 | -163.329 | -248.347 | -358.351 | -497 |
| 3.429999999999971 | -7.737 | -24.959 | -54.791 | -100.013 | -163.624 | -248.847 | -359.128 | -498.134 |
| 3.439999999999971 | -7.719 | -24.959 | -54.844 | -100.16 | -163.917 | -249.346 | -359.903 | -499.266 |
| 3.44999999999997 | -7.701 | -24.959 | -54.897 | -100.307 | -164.209 | -249.844 | -360.677 | -500.397 |
| 3.45999999999997 | -7.682 | -24.959 | -54.949 | -100.454 | -164.501 | -250.341 | -361.449 | -501.526 |
| 3.46999999999997 | -7.664 | -24.959 | -55 | -100.599 | -164.791 | -250.836 | -362.22 | -502.653 |
| 3.47999999999997 | -7.645 | -24.958 | -55.051 | -100.744 | -165.08 | -251.331 | -362.989 | -503.778 |
| 3.48999999999997 | -7.626 | -24.957 | -55.102 | -100.888 | -165.369 | -251.824 | -363.757 | -504.902 |
| 3.499999999999969 | -7.607 | -24.955 | -55.151 | -101.031 | -165.656 | -252.315 | -364.523 | -506.023 |
| 3.509999999999969 | -7.588 | -24.953 | -55.201 | -101.174 | -165.943 | -252.806 | -365.288 | -507.143 |
| 3.519999999999969 | -7.569 | -24.951 | -55.249 | -101.315 | -166.228 | -253.295 | -366.051 | -508.261 |
| 3.529999999999969 | -7.549 | -24.948 | -55.298 | -101.456 | -166.512 | -253.783 | -366.813 | -509.377 |
| 3.539999999999968 | -7.53 | -24.945 | -55.345 | -101.596 | -166.796 | -254.27 | -367.573 | -510.492 |
| 3.549999999999968 | -7.51 | -24.942 | -55.392 | -101.736 | -167.078 | -254.755 | -368.332 | -511.605 |
| 3.559999999999968 | -7.49 | -24.938 | -55.439 | -101.874 | -167.359 | -255.239 | -369.089 | -512.715 |
| 3.569999999999968 | -7.47 | -24.934 | -55.485 | -102.012 | -167.64 | -255.722 | -369.845 | -513.825 |
| 3.579999999999968 | -7.449 | -24.93 | -55.53 | -102.149 | -167.919 | -256.204 | -370.599 | -514.932 |
| 3.589999999999967 | -7.429 | -24.925 | -55.575 | -102.286 | -168.198 | -256.684 | -371.351 | -516.037 |
| 3.599999999999967 | -7.408 | -24.92 | -55.619 | -102.421 | -168.475 | -257.164 | -372.103 | -517.141 |
| 3.609999999999967 | -7.387 | -24.915 | -55.663 | -102.556 | -168.751 | -257.641 | -372.852 | -518.243 |
| 3.619999999999967 | -7.366 | -24.909 | -55.706 | -102.69 | -169.027 | -258.118 | -373.6 | -519.343 |
| 3.629999999999966 | -7.345 | -24.903 | -55.749 | -102.823 | -169.301 | -258.594 | -374.347 | -520.442 |
| 3.639999999999966 | -7.324 | -24.897 | -55.791 | -102.956 | -169.574 | -259.068 | -375.092 | -521.538 |
| 3.649999999999966 | -7.302 | -24.89 | -55.833 | -103.087 | -169.847 | -259.541 | -375.835 | -522.633 |
| 3.659999999999966 | -7.28 | -24.882 | -55.874 | -103.218 | -170.118 | -260.013 | -376.577 | -523.726 |
| 3.669999999999966 | -7.259 | -24.875 | -55.914 | -103.348 | -170.389 | -260.483 | -377.318 | -524.817 |
| 3.679999999999965 | -7.237 | -24.867 | -55.954 | -103.478 | -170.658 | -260.952 | -378.057 | -525.906 |
| 3.689999999999965 | -7.214 | -24.859 | -55.993 | -103.606 | -170.926 | -261.42 | -378.794 | -526.994 |
| 3.699999999999965 | -7.192 | -24.85 | -56.032 | -103.734 | -171.194 | -261.887 | -379.53 | -528.08 |
| 3.709999999999965 | -7.169 | -24.841 | -56.07 | -103.861 | -171.46 | -262.353 | -380.265 | -529.164 |
| 3.719999999999965 | -7.147 | -24.832 | -56.108 | -103.988 | -171.725 | -262.817 | -380.998 | -530.246 |
| 3.729999999999964 | -7.124 | -24.822 | -56.145 | -104.113 | -171.99 | -263.28 | -381.729 | -531.327 |
| 3.739999999999964 | -7.101 | -24.812 | -56.182 | -104.238 | -172.253 | -263.742 | -382.459 | -532.405 |
| 3.749999999999964 | -7.078 | -24.802 | -56.218 | -104.362 | -172.516 | -264.202 | -383.188 | -533.482 |
| 3.759999999999964 | -7.054 | -24.791 | -56.253 | -104.485 | -172.777 | -264.661 | -383.915 | -534.557 |
| 3.769999999999964 | -7.031 | -24.78 | -56.288 | -104.608 | -173.037 | -265.119 | -384.64 | -535.63 |
| 3.779999999999963 | -7.007 | -24.769 | -56.322 | -104.729 | -173.297 | -265.576 | -385.364 | -536.702 |
| 3.789999999999963 | -6.983 | -24.757 | -56.356 | -104.85 | -173.555 | -266.032 | -386.086 | -537.771 |
| 3.799999999999963 | -6.959 | -24.745 | -56.389 | -104.971 | -173.812 | -266.486 | -386.807 | -538.839 |
| 3.809999999999963 | -6.935 | -24.732 | -56.422 | -105.09 | -174.069 | -266.939 | -387.526 | -539.905 |
| 3.819999999999962 | -6.91 | -24.72 | -56.454 | -105.209 | -174.324 | -267.391 | -388.244 | -540.97 |
| 3.829999999999962 | -6.886 | -24.707 | -56.486 | -105.326 | -174.579 | -267.841 | -388.961 | -542.032 |
| 3.839999999999962 | -6.861 | -24.693 | -56.517 | -105.444 | -174.832 | -268.29 | -389.675 | -543.093 |
| 3.849999999999962 | -6.836 | -24.679 | -56.547 | -105.56 | -175.084 | -268.738 | -390.389 | -544.152 |
| 3.859999999999962 | -6.811 | -24.665 | -56.577 | -105.675 | -175.336 | -269.185 | -391.1 | -545.209 |
| 3.869999999999961 | -6.786 | -24.65 | -56.607 | -105.79 | -175.586 | -269.631 | -391.811 | -546.264 |
| 3.879999999999961 | -6.761 | -24.635 | -56.636 | -105.904 | -175.835 | -270.075 | -392.52 | -547.318 |
| 3.889999999999961 | -6.735 | -24.62 | -56.664 | -106.018 | -176.084 | -270.518 | -393.227 | -548.37 |
| 3.899999999999961 | -6.709 | -24.604 | -56.692 | -106.13 | -176.331 | -270.96 | -393.933 | -549.42 |
| 3.909999999999961 | -6.683 | -24.588 | -56.719 | -106.242 | -176.578 | -271.4 | -394.637 | -550.468 |
| 3.91999999999996 | -6.657 | -24.572 | -56.746 | -106.353 | -176.823 | -271.839 | -395.339 | -551.514 |
| 3.92999999999996 | -6.631 | -24.555 | -56.772 | -106.463 | -177.067 | -272.278 | -396.041 | -552.559 |
| 3.93999999999996 | -6.605 | -24.538 | -56.797 | -106.572 | -177.311 | -272.714 | -396.74 | -553.602 |
| 3.94999999999996 | -6.578 | -24.521 | -56.822 | -106.681 | -177.553 | -273.15 | -397.439 | -554.643 |
| 3.95999999999996 | -6.551 | -24.503 | -56.847 | -106.789 | -177.794 | -273.584 | -398.135 | -555.682 |
| 3.969999999999959 | -6.525 | -24.485 | -56.87 | -106.896 | -178.035 | -274.017 | -398.83 | -556.719 |
| 3.979999999999959 | -6.497 | -24.467 | -56.894 | -107.002 | -178.274 | -274.449 | -399.524 | -557.755 |
| 3.989999999999959 | -6.47 | -24.448 | -56.917 | -107.108 | -178.513 | -274.88 | -400.216 | -558.789 |
| 3.999999999999959 | -6.443 | -24.429 | -56.939 | -107.213 | -178.75 | -275.309 | -400.907 | -559.821 |
| 4.009999999999959 | -6.415 | -24.409 | -56.96 | -107.317 | -178.986 | -275.737 | -401.596 | -560.851 |
| 4.019999999999959 | -6.387 | -24.389 | -56.982 | -107.42 | -179.222 | -276.164 | -402.284 | -561.88 |
| 4.029999999999958 | -6.36 | -24.369 | -57.002 | -107.523 | -179.456 | -276.589 | -402.97 | -562.906 |
| 4.039999999999958 | -6.331 | -24.349 | -57.022 | -107.624 | -179.689 | -277.014 | -403.654 | -563.931 |
| 4.049999999999958 | -6.303 | -24.328 | -57.042 | -107.725 | -179.922 | -277.437 | -404.337 | -564.954 |
| 4.059999999999958 | -6.275 | -24.306 | -57.061 | -107.826 | -180.153 | -277.858 | -405.019 | -565.975 |
| 4.069999999999958 | -6.246 | -24.285 | -57.079 | -107.925 | -180.384 | -278.279 | -405.699 | -566.995 |
| 4.079999999999957 | -6.217 | -24.263 | -57.097 | -108.024 | -180.613 | -278.698 | -406.377 | -568.013 |
| 4.089999999999957 | -6.189 | -24.241 | -57.114 | -108.122 | -180.841 | -279.116 | -407.054 | -569.029 |
| 4.099999999999957 | -6.159 | -24.218 | -57.131 | -108.219 | -181.069 | -279.533 | -407.73 | -570.043 |
| 4.109999999999957 | -6.13 | -24.195 | -57.147 | -108.315 | -181.295 | -279.949 | -408.404 | -571.055 |
| 4.119999999999957 | -6.101 | -24.172 | -57.162 | -108.411 | -181.52 | -280.363 | -409.076 | -572.066 |
| 4.129999999999956 | -6.071 | -24.148 | -57.177 | -108.506 | -181.745 | -280.776 | -409.747 | -573.074 |
| 4.139999999999956 | -6.041 | -24.124 | -57.192 | -108.6 | -181.968 | -281.188 | -410.417 | -574.081 |
| 4.149999999999956 | -6.012 | -24.099 | -57.206 | -108.693 | -182.191 | -281.598 | -411.085 | -575.086 |
| 4.159999999999956 | -5.981 | -24.074 | -57.219 | -108.785 | -182.412 | -282.008 | -411.751 | -576.09 |
| 4.169999999999955 | -5.951 | -24.049 | -57.232 | -108.877 | -182.632 | -282.416 | -412.416 | -577.091 |
| 4.179999999999955 | -5.921 | -24.024 | -57.244 | -108.968 | -182.852 | -282.823 | -413.079 | -578.091 |
| 4.189999999999955 | -5.89 | -23.998 | -57.256 | -109.058 | -183.07 | -283.228 | -413.741 | -579.089 |
| 4.199999999999955 | -5.859 | -23.972 | -57.267 | -109.148 | -183.287 | -283.633 | -414.402 | -580.085 |
| 4.209999999999954 | -5.828 | -23.945 | -57.278 | -109.237 | -183.504 | -284.036 | -415.061 | -581.08 |
| 4.219999999999954 | -5.797 | -23.918 | -57.288 | -109.324 | -183.719 | -284.438 | -415.718 | -582.072 |
| 4.229999999999954 | -5.766 | -23.891 | -57.298 | -109.412 | -183.934 | -284.838 | -416.374 | -583.063 |
| 4.239999999999954 | -5.735 | -23.864 | -57.307 | -109.498 | -184.147 | -285.238 | -417.028 | -584.052 |
| 4.249999999999954 | -5.703 | -23.836 | -57.315 | -109.584 | -184.359 | -285.636 | -417.681 | -585.04 |
| 4.259999999999954 | -5.671 | -23.807 | -57.323 | -109.668 | -184.571 | -286.032 | -418.332 | -586.025 |
| 4.269999999999953 | -5.639 | -23.779 | -57.33 | -109.753 | -184.781 | -286.428 | -418.982 | -587.009 |
| 4.279999999999953 | -5.607 | -23.75 | -57.337 | -109.836 | -184.99 | -286.822 | -419.63 | -587.991 |
| 4.289999999999953 | -5.575 | -23.72 | -57.343 | -109.918 | -185.199 | -287.216 | -420.277 | -588.971 |
| 4.299999999999953 | -5.542 | -23.691 | -57.349 | -110 | -185.406 | -287.607 | -420.922 | -589.949 |
| 4.309999999999952 | -5.51 | -23.66 | -57.354 | -110.081 | -185.613 | -287.998 | -421.566 | -590.925 |
| 4.319999999999952 | -5.477 | -23.63 | -57.358 | -110.161 | -185.818 | -288.387 | -422.208 | -591.9 |
| 4.329999999999952 | -5.444 | -23.599 | -57.362 | -110.241 | -186.022 | -288.775 | -422.849 | -592.873 |
| 4.339999999999952 | -5.411 | -23.568 | -57.366 | -110.32 | -186.226 | -289.162 | -423.488 | -593.844 |
| 4.349999999999952 | -5.378 | -23.537 | -57.369 | -110.398 | -186.428 | -289.548 | -424.126 | -594.814 |
| 4.359999999999951 | -5.344 | -23.505 | -57.371 | -110.475 | -186.629 | -289.932 | -424.762 | -595.781 |
| 4.369999999999951 | -5.311 | -23.473 | -57.373 | -110.551 | -186.83 | -290.315 | -425.397 | -596.747 |
| 4.379999999999951 | -5.277 | -23.44 | -57.374 | -110.627 | -187.029 | -290.697 | -426.03 | -597.711 |
| 4.389999999999951 | -5.243 | -23.407 | -57.375 | -110.702 | -187.228 | -291.078 | -426.662 | -598.673 |
| 4.399999999999951 | -5.209 | -23.374 | -57.375 | -110.776 | -187.425 | -291.457 | -427.292 | -599.633 |
| 4.40999999999995 | -5.174 | -23.34 | -57.375 | -110.849 | -187.621 | -291.835 | -427.921 | -600.592 |
| 4.41999999999995 | -5.14 | -23.307 | -57.374 | -110.922 | -187.817 | -292.212 | -428.548 | -601.549 |
| 4.42999999999995 | -5.105 | -23.272 | -57.372 | -110.993 | -188.011 | -292.588 | -429.173 | -602.504 |
| 4.43999999999995 | -5.07 | -23.238 | -57.37 | -111.064 | -188.204 | -292.962 | -429.797 | -603.457 |
| 4.44999999999995 | -5.036 | -23.203 | -57.368 | -111.135 | -188.397 | -293.335 | -430.42 | -604.408 |
| 4.45999999999995 | -5 | -23.167 | -57.364 | -111.204 | -188.588 | -293.707 | -431.041 | -605.358 |
| 4.46999999999995 | -4.965 | -23.132 | -57.361 | -111.273 | -188.779 | -294.078 | -431.661 | -606.306 |
| 4.479999999999948 | -4.93 | -23.096 | -57.356 | -111.341 | -188.968 | -294.447 | -432.279 | -607.252 |
| 4.489999999999948 | -4.894 | -23.059 | -57.352 | -111.408 | -189.156 | -294.816 | -432.895 | -608.196 |
| 4.499999999999948 | -4.858 | -23.022 | -57.346 | -111.474 | -189.344 | -295.182 | -433.51 | -609.138 |
| 4.509999999999948 | -4.822 | -22.985 | -57.34 | -111.54 | -189.53 | -295.548 | -434.124 | -610.079 |
| 4.519999999999948 | -4.786 | -22.948 | -57.334 | -111.605 | -189.715 | -295.912 | -434.736 | -611.018 |
| 4.529999999999948 | -4.75 | -22.91 | -57.327 | -111.669 | -189.9 | -296.276 | -435.346 | -611.955 |
| 4.539999999999947 | -4.713 | -22.872 | -57.319 | -111.732 | -190.083 | -296.638 | -435.955 | -612.89 |
| 4.549999999999947 | -4.677 | -22.833 | -57.311 | -111.795 | -190.266 | -296.998 | -436.563 | -613.824 |
| 4.559999999999947 | -4.64 | -22.794 | -57.302 | -111.857 | -190.447 | -297.358 | -437.169 | -614.755 |
| 4.569999999999947 | -4.603 | -22.755 | -57.293 | -111.918 | -190.627 | -297.716 | -437.773 | -615.685 |
| 4.579999999999946 | -4.566 | -22.716 | -57.283 | -111.978 | -190.807 | -298.073 | -438.376 | -616.613 |
| 4.589999999999946 | -4.528 | -22.676 | -57.273 | -112.038 | -190.985 | -298.428 | -438.977 | -617.54 |
| 4.599999999999946 | -4.491 | -22.636 | -57.262 | -112.096 | -191.162 | -298.783 | -439.577 | -618.464 |
| 4.609999999999946 | -4.453 | -22.595 | -57.251 | -112.154 | -191.339 | -299.136 | -440.176 | -619.387 |
| 4.619999999999946 | -4.415 | -22.554 | -57.239 | -112.211 | -191.514 | -299.488 | -440.772 | -620.308 |
| 4.629999999999946 | -4.377 | -22.513 | -57.226 | -112.268 | -191.689 | -299.838 | -441.368 | -621.227 |
| 4.639999999999945 | -4.339 | -22.471 | -57.213 | -112.324 | -191.862 | -300.188 | -441.962 | -622.145 |
| 4.649999999999945 | -4.301 | -22.429 | -57.199 | -112.378 | -192.034 | -300.536 | -442.554 | -623.06 |
| 4.659999999999945 | -4.262 | -22.386 | -57.185 | -112.433 | -192.206 | -300.883 | -443.145 | -623.974 |
| 4.669999999999945 | -4.224 | -22.344 | -57.17 | -112.486 | -192.376 | -301.229 | -443.734 | -624.886 |
| 4.679999999999944 | -4.185 | -22.301 | -57.155 | -112.539 | -192.545 | -301.573 | -444.322 | -625.796 |
| 4.689999999999944 | -4.146 | -22.257 | -57.139 | -112.59 | -192.714 | -301.916 | -444.908 | -626.704 |
| 4.699999999999944 | -4.107 | -22.213 | -57.123 | -112.641 | -192.881 | -302.258 | -445.493 | -627.611 |
| 4.709999999999944 | -4.067 | -22.169 | -57.106 | -112.692 | -193.048 | -302.599 | -446.076 | -628.516 |
| 4.719999999999944 | -4.028 | -22.125 | -57.088 | -112.741 | -193.213 | -302.938 | -446.658 | -629.419 |
| 4.729999999999944 | -3.988 | -22.08 | -57.07 | -112.79 | -193.377 | -303.277 | -447.238 | -630.32 |
| 4.739999999999943 | -3.948 | -22.035 | -57.052 | -112.838 | -193.541 | -303.614 | -447.817 | -631.22 |
| 4.749999999999943 | -3.908 | -21.989 | -57.032 | -112.885 | -193.703 | -303.949 | -448.394 | -632.117 |
| 4.759999999999943 | -3.868 | -21.943 | -57.013 | -112.932 | -193.864 | -304.284 | -448.97 | -633.013 |
| 4.769999999999943 | -3.828 | -21.897 | -56.992 | -112.977 | -194.025 | -304.617 | -449.544 | -633.907 |
| 4.779999999999942 | -3.787 | -21.85 | -56.971 | -113.022 | -194.184 | -304.949 | -450.117 | -634.799 |
| 4.789999999999942 | -3.747 | -21.803 | -56.95 | -113.066 | -194.343 | -305.28 | -450.688 | -635.69 |
| 4.799999999999942 | -3.706 | -21.756 | -56.928 | -113.11 | -194.5 | -305.609 | -451.258 | -636.579 |
| 4.809999999999942 | -3.665 | -21.708 | -56.906 | -113.152 | -194.656 | -305.937 | -451.826 | -637.465 |
| 4.819999999999942 | -3.624 | -21.66 | -56.883 | -113.194 | -194.812 | -306.264 | -452.393 | -638.351 |
| 4.829999999999941 | -3.582 | -21.612 | -56.859 | -113.235 | -194.966 | -306.59 | -452.958 | -639.234 |
| 4.839999999999941 | -3.541 | -21.563 | -56.835 | -113.276 | -195.119 | -306.914 | -453.521 | -640.115 |
| 4.849999999999941 | -3.499 | -21.514 | -56.81 | -113.315 | -195.272 | -307.238 | -454.083 | -640.995 |
| 4.859999999999941 | -3.457 | -21.465 | -56.785 | -113.354 | -195.423 | -307.559 | -454.644 | -641.873 |
| 4.869999999999941 | -3.415 | -21.415 | -56.759 | -113.392 | -195.574 | -307.88 | -455.203 | -642.749 |
| 4.87999999999994 | -3.373 | -21.365 | -56.733 | -113.429 | -195.723 | -308.2 | -455.761 | -643.624 |
| 4.88999999999994 | -3.331 | -21.315 | -56.706 | -113.466 | -195.871 | -308.518 | -456.317 | -644.496 |
| 4.89999999999994 | -3.288 | -21.264 | -56.678 | -113.501 | -196.019 | -308.835 | -456.871 | -645.367 |
| 4.90999999999994 | -3.245 | -21.212 | -56.65 | -113.536 | -196.165 | -309.151 | -457.424 | -646.236 |
| 4.91999999999994 | -3.202 | -21.161 | -56.622 | -113.57 | -196.31 | -309.465 | -457.976 | -647.103 |
| 4.92999999999994 | -3.159 | -21.109 | -56.593 | -113.604 | -196.455 | -309.778 | -458.526 | -647.968 |
| 4.93999999999994 | -3.116 | -21.057 | -56.563 | -113.636 | -196.598 | -310.09 | -459.074 | -648.832 |
| 4.949999999999938 | -3.073 | -21.004 | -56.533 | -113.668 | -196.741 | -310.401 | -459.621 | -649.694 |
| 4.959999999999938 | -3.029 | -20.951 | -56.502 | -113.699 | -196.882 | -310.711 | -460.167 | -650.554 |
| 4.969999999999938 | -2.986 | -20.898 | -56.471 | -113.73 | -197.022 | -311.019 | -460.711 | -651.412 |
| 4.979999999999938 | -2.942 | -20.844 | -56.439 | -113.759 | -197.162 | -311.326 | -461.253 | -652.269 |
| 4.989999999999937 | -2.898 | -20.79 | -56.406 | -113.788 | -197.3 | -311.632 | -461.794 | -653.123 |
| 4.999999999999937 | -2.854 | -20.736 | -56.374 | -113.816 | -197.437 | -311.936 | -462.333 | -653.976 |
| 5.009999999999937 | -2.809 | -20.681 | -56.34 | -113.843 | -197.574 | -312.239 | -462.871 | -654.827 |
| 5.019999999999937 | -2.765 | -20.626 | -56.306 | -113.87 | -197.709 | -312.541 | -463.408 | -655.676 |
| 5.029999999999937 | -2.72 | -20.571 | -56.271 | -113.895 | -197.844 | -312.842 | -463.943 | -656.524 |
| 5.039999999999936 | -2.675 | -20.515 | -56.236 | -113.92 | -197.977 | -313.142 | -464.476 | -657.369 |
| 5.049999999999936 | -2.63 | -20.459 | -56.2 | -113.945 | -198.109 | -313.44 | -465.008 | -658.213 |
| 5.059999999999936 | -2.585 | -20.402 | -56.164 | -113.968 | -198.241 | -313.737 | -465.538 | -659.055 |
| 5.069999999999936 | -2.539 | -20.346 | -56.127 | -113.991 | -198.371 | -314.033 | -466.067 | -659.896 |
| 5.079999999999936 | -2.494 | -20.289 | -56.09 | -114.012 | -198.5 | -314.327 | -466.594 | -660.734 |
| 5.089999999999935 | -2.448 | -20.231 | -56.052 | -114.034 | -198.629 | -314.62 | -467.12 | -661.571 |
| 5.099999999999935 | -2.402 | -20.173 | -56.013 | -114.054 | -198.756 | -314.912 | -467.645 | -662.406 |
| 5.109999999999935 | -2.356 | -20.115 | -55.974 | -114.073 | -198.883 | -315.203 | -468.167 | -663.239 |
| 5.119999999999935 | -2.31 | -20.056 | -55.935 | -114.092 | -199.008 | -315.493 | -468.689 | -664.07 |
| 5.129999999999935 | -2.263 | -19.997 | -55.895 | -114.11 | -199.132 | -315.781 | -469.208 | -664.9 |
| 5.139999999999934 | -2.217 | -19.938 | -55.854 | -114.128 | -199.256 | -316.068 | -469.727 | -665.728 |
| 5.149999999999934 | -2.17 | -19.878 | -55.813 | -114.144 | -199.378 | -316.354 | -470.243 | -666.554 |
| 5.159999999999934 | -2.123 | -19.818 | -55.771 | -114.16 | -199.499 | -316.638 | -470.759 | -667.378 |
| 5.169999999999934 | -2.076 | -19.758 | -55.728 | -114.175 | -199.62 | -316.921 | -471.272 | -668.2 |
| 5.179999999999934 | -2.029 | -19.697 | -55.686 | -114.189 | -199.739 | -317.204 | -471.785 | -669.021 |
| 5.189999999999934 | -1.982 | -19.636 | -55.642 | -114.202 | -199.858 | -317.484 | -472.295 | -669.84 |
| 5.199999999999934 | -1.934 | -19.575 | -55.598 | -114.215 | -199.975 | -317.764 | -472.804 | -670.657 |
| 5.209999999999933 | -1.886 | -19.513 | -55.553 | -114.227 | -200.091 | -318.042 | -473.312 | -671.472 |
| 5.219999999999933 | -1.838 | -19.451 | -55.508 | -114.238 | -200.207 | -318.319 | -473.818 | -672.285 |
| 5.229999999999933 | -1.79 | -19.389 | -55.463 | -114.248 | -200.321 | -318.595 | -474.323 | -673.097 |
| 5.239999999999932 | -1.742 | -19.326 | -55.416 | -114.258 | -200.434 | -318.87 | -474.826 | -673.907 |
| 5.249999999999932 | -1.694 | -19.263 | -55.37 | -114.267 | -200.547 | -319.143 | -475.328 | -674.715 |
| 5.259999999999932 | -1.645 | -19.199 | -55.322 | -114.275 | -200.658 | -319.415 | -475.828 | -675.521 |
| 5.269999999999932 | -1.596 | -19.135 | -55.274 | -114.282 | -200.769 | -319.686 | -476.326 | -676.326 |
| 5.279999999999931 | -1.547 | -19.071 | -55.226 | -114.289 | -200.878 | -319.955 | -476.823 | -677.128 |
| 5.289999999999931 | -1.498 | -19.007 | -55.177 | -114.294 | -200.986 | -320.224 | -477.319 | -677.929 |
| 5.299999999999931 | -1.449 | -18.942 | -55.128 | -114.299 | -201.094 | -320.491 | -477.813 | -678.728 |
| 5.309999999999931 | -1.4 | -18.876 | -55.077 | -114.304 | -201.2 | -320.756 | -478.306 | -679.525 |
| 5.319999999999931 | -1.35 | -18.811 | -55.027 | -114.307 | -201.305 | -321.021 | -478.797 | -680.321 |
| 5.329999999999931 | -1.3 | -18.745 | -54.976 | -114.31 | -201.41 | -321.284 | -479.286 | -681.115 |
| 5.33999999999993 | -1.25 | -18.679 | -54.924 | -114.312 | -201.513 | -321.546 | -479.774 | -681.907 |
| 5.34999999999993 | -1.2 | -18.612 | -54.872 | -114.313 | -201.616 | -321.807 | -480.261 | -682.697 |
| 5.35999999999993 | -1.15 | -18.545 | -54.819 | -114.313 | -201.717 | -322.067 | -480.746 | -683.485 |
| 5.36999999999993 | -1.1 | -18.478 | -54.765 | -114.313 | -201.817 | -322.325 | -481.229 | -684.272 |
| 5.37999999999993 | -1.049 | -18.41 | -54.711 | -114.312 | -201.917 | -322.582 | -481.711 | -685.056 |
| 5.38999999999993 | -0.998 | -18.342 | -54.657 | -114.31 | -202.015 | -322.838 | -482.192 | -685.839 |
| 5.39999999999993 | -0.947 | -18.273 | -54.602 | -114.307 | -202.112 | -323.092 | -482.671 | -686.62 |
| 5.40999999999993 | -0.896 | -18.204 | -54.546 | -114.303 | -202.209 | -323.346 | -483.148 | -687.4 |
| 5.419999999999928 | -0.845 | -18.135 | -54.49 | -114.299 | -202.304 | -323.598 | -483.624 | -688.177 |
| 5.429999999999928 | -0.794 | -18.066 | -54.433 | -114.294 | -202.399 | -323.849 | -484.098 | -688.953 |
| 5.439999999999928 | -0.742 | -17.996 | -54.376 | -114.288 | -202.492 | -324.098 | -484.571 | -689.727 |
| 5.449999999999928 | -0.69 | -17.926 | -54.318 | -114.282 | -202.584 | -324.347 | -485.043 | -690.499 |
| 5.459999999999927 | -0.638 | -17.855 | -54.26 | -114.275 | -202.676 | -324.594 | -485.512 | -691.27 |
| 5.469999999999927 | -0.586 | -17.784 | -54.201 | -114.266 | -202.766 | -324.84 | -485.981 | -692.038 |
| 5.479999999999927 | -0.534 | -17.713 | -54.141 | -114.258 | -202.855 | -325.084 | -486.448 | -692.805 |
| 5.489999999999927 | -0.481 | -17.642 | -54.081 | -114.248 | -202.944 | -325.328 | -486.913 | -693.57 |
| 5.499999999999927 | -0.429 | -17.57 | -54.021 | -114.238 | -203.031 | -325.57 | -487.377 | -694.334 |
| 5.509999999999926 | -0.376 | -17.497 | -53.96 | -114.226 | -203.118 | -325.81 | -487.839 | -695.095 |
| 5.519999999999926 | -0.323 | -17.425 | -53.898 | -114.215 | -203.203 | -326.05 | -488.3 | -695.855 |
| 5.529999999999926 | -0.27 | -17.352 | -53.836 | -114.202 | -203.287 | -326.288 | -488.759 | -696.613 |
| 5.539999999999926 | -0.217 | -17.278 | -53.773 | -114.188 | -203.371 | -326.526 | -489.217 | -697.369 |
| 5.549999999999926 | -0.163 | -17.205 | -53.71 | -114.174 | -203.453 | -326.761 | -489.673 | -698.123 |
| 5.559999999999925 | -0.11 | -17.13 | -53.646 | -114.159 | -203.534 | -326.996 | -490.128 | -698.875 |
| 5.569999999999925 | -0.056 | -17.056 | -53.581 | -114.143 | -203.615 | -327.229 | -490.581 | -699.626 |
| 5.579999999999925 | -0.002 | -16.981 | -53.516 | -114.127 | -203.694 | -327.461 | -491.033 | -700.375 |
| 5.589999999999925 | 0.052 | -16.906 | -53.451 | -114.11 | -203.773 | -327.692 | -491.483 | -701.122 |
| 5.599999999999925 | 0.106 | -16.831 | -53.385 | -114.092 | -203.85 | -327.922 | -491.932 | -701.868 |
| 5.609999999999924 | 0.161 | -16.755 | -53.318 | -114.073 | -203.926 | -328.15 | -492.379 | -702.611 |
| 5.619999999999924 | 0.216 | -16.679 | -53.251 | -114.053 | -204.002 | -328.377 | -492.825 | -703.353 |
| 5.629999999999924 | 0.27 | -16.602 | -53.183 | -114.033 | -204.076 | -328.603 | -493.269 | -704.093 |
| 5.639999999999924 | 0.325 | -16.525 | -53.115 | -114.012 | -204.15 | -328.828 | -493.712 | -704.831 |
| 5.649999999999924 | 0.38 | -16.448 | -53.046 | -113.99 | -204.222 | -329.051 | -494.153 | -705.567 |
| 5.659999999999924 | 0.436 | -16.37 | -52.977 | -113.967 | -204.293 | -329.273 | -494.592 | -706.302 |
| 5.669999999999923 | 0.491 | -16.293 | -52.907 | -113.944 | -204.364 | -329.494 | -495.031 | -707.035 |
| 5.679999999999923 | 0.547 | -16.214 | -52.836 | -113.919 | -204.433 | -329.714 | -495.467 | -707.766 |
| 5.689999999999923 | 0.603 | -16.136 | -52.765 | -113.894 | -204.501 | -329.932 | -495.902 | -708.495 |
| 5.699999999999923 | 0.659 | -16.057 | -52.693 | -113.869 | -204.569 | -330.149 | -496.336 | -709.222 |
| 5.709999999999922 | 0.715 | -15.977 | -52.621 | -113.842 | -204.635 | -330.365 | -496.768 | -709.948 |
| 5.719999999999922 | 0.771 | -15.898 | -52.549 | -113.815 | -204.701 | -330.58 | -497.198 | -710.672 |
| 5.729999999999922 | 0.828 | -15.818 | -52.475 | -113.787 | -204.765 | -330.793 | -497.627 | -711.394 |
| 5.739999999999921 | 0.884 | -15.737 | -52.401 | -113.758 | -204.828 | -331.006 | -498.055 | -712.114 |
| 5.749999999999921 | 0.941 | -15.656 | -52.327 | -113.728 | -204.891 | -331.216 | -498.481 | -712.832 |
| 5.759999999999921 | 0.998 | -15.575 | -52.252 | -113.698 | -204.952 | -331.426 | -498.906 | -713.549 |
| 5.769999999999921 | 1.055 | -15.494 | -52.177 | -113.667 | -205.012 | -331.634 | -499.329 | -714.264 |
| 5.77999999999992 | 1.112 | -15.412 | -52.101 | -113.635 | -205.072 | -331.842 | -499.75 | -714.977 |
| 5.78999999999992 | 1.17 | -15.33 | -52.024 | -113.602 | -205.13 | -332.048 | -500.17 | -715.688 |
| 5.79999999999992 | 1.228 | -15.247 | -51.947 | -113.569 | -205.188 | -332.252 | -500.588 | -716.398 |
| 5.80999999999992 | 1.285 | -15.164 | -51.869 | -113.535 | -205.244 | -332.456 | -501.005 | -717.105 |
| 5.81999999999992 | 1.343 | -15.081 | -51.791 | -113.5 | -205.299 | -332.658 | -501.421 | -717.811 |
| 5.82999999999992 | 1.401 | -14.998 | -51.712 | -113.464 | -205.354 | -332.859 | -501.835 | -718.515 |
| 5.83999999999992 | 1.46 | -14.914 | -51.633 | -113.428 | -205.407 | -333.058 | -502.247 | -719.218 |
| 5.84999999999992 | 1.518 | -14.83 | -51.553 | -113.39 | -205.459 | -333.257 | -502.658 | -719.918 |
| 5.859999999999919 | 1.577 | -14.745 | -51.472 | -113.352 | -205.511 | -333.454 | -503.067 | -720.617 |
| 5.869999999999919 | 1.636 | -14.66 | -51.391 | -113.313 | -205.561 | -333.65 | -503.475 | -721.314 |
| 5.87999999999992 | 1.695 | -14.575 | -51.31 | -113.274 | -205.611 | -333.844 | -503.882 | -722.009 |
| 5.889999999999919 | 1.754 | -14.489 | -51.228 | -113.234 | -205.659 | -334.038 | -504.287 | -722.703 |
| 5.899999999999919 | 1.813 | -14.403 | -51.145 | -113.192 | -205.706 | -334.23 | -504.69 | -723.394 |
| 5.909999999999918 | 1.873 | -14.316 | -51.062 | -113.151 | -205.753 | -334.421 | -505.092 | -724.084 |
| 5.919999999999918 | 1.932 | -14.23 | -50.978 | -113.108 | -205.798 | -334.611 | -505.492 | -724.772 |
| 5.929999999999918 | 1.992 | -14.143 | -50.894 | -113.065 | -205.842 | -334.799 | -505.891 | -725.458 |
| 5.939999999999917 | 2.052 | -14.055 | -50.809 | -113.02 | -205.886 | -334.986 | -506.288 | -726.142 |
| 5.949999999999917 | 2.112 | -13.967 | -50.724 | -112.975 | -205.928 | -335.172 | -506.684 | -726.825 |
| 5.959999999999917 | 2.173 | -13.879 | -50.638 | -112.93 | -205.97 | -335.357 | -507.078 | -727.506 |
| 5.969999999999917 | 2.233 | -13.791 | -50.551 | -112.883 | -206.01 | -335.54 | -507.471 | -728.185 |
| 5.979999999999916 | 2.294 | -13.702 | -50.464 | -112.836 | -206.049 | -335.723 | -507.862 | -728.862 |
| 5.989999999999916 | 2.355 | -13.613 | -50.376 | -112.788 | -206.088 | -335.904 | -508.252 | -729.538 |
| 5.999999999999916 | 2.416 | -13.523 | -50.288 | -112.739 | -206.125 | -336.083 | -508.64 | -730.211 |
| 6.009999999999916 | 2.477 | -13.433 | -50.199 | -112.69 | -206.161 | -336.262 | -509.027 | -730.883 |
| 6.019999999999916 | 2.538 | -13.343 | -50.11 | -112.639 | -206.197 | -336.439 | -509.412 | -731.553 |
| 6.029999999999916 | 2.6 | -13.252 | -50.02 | -112.588 | -206.231 | -336.615 | -509.796 | -732.221 |
| 6.039999999999915 | 2.662 | -13.161 | -49.93 | -112.536 | -206.265 | -336.79 | -510.178 | -732.888 |
| 6.049999999999915 | 2.723 | -13.07 | -49.839 | -112.484 | -206.297 | -336.963 | -510.559 | -733.553 |
| 6.059999999999915 | 2.785 | -12.978 | -49.748 | -112.43 | -206.328 | -337.135 | -510.938 | -734.215 |
| 6.069999999999915 | 2.848 | -12.886 | -49.656 | -112.376 | -206.359 | -337.306 | -511.315 | -734.877 |
| 6.079999999999914 | 2.91 | -12.794 | -49.563 | -112.321 | -206.388 | -337.476 | -511.692 | -735.536 |
| 6.089999999999914 | 2.972 | -12.701 | -49.47 | -112.266 | -206.416 | -337.644 | -512.066 | -736.193 |
| 6.099999999999914 | 3.035 | -12.608 | -49.376 | -112.209 | -206.444 | -337.812 | -512.439 | -736.849 |
| 6.109999999999914 | 3.098 | -12.515 | -49.282 | -112.152 | -206.47 | -337.977 | -512.811 | -737.503 |
| 6.119999999999914 | 3.161 | -12.421 | -49.187 | -112.094 | -206.496 | -338.142 | -513.181 | -738.155 |
| 6.129999999999914 | 3.224 | -12.327 | -49.092 | -112.035 | -206.52 | -338.306 | -513.55 | -738.806 |
| 6.139999999999914 | 3.288 | -12.233 | -48.996 | -111.976 | -206.543 | -338.468 | -513.917 | -739.454 |
| 6.149999999999913 | 3.351 | -12.138 | -48.899 | -111.915 | -206.566 | -338.629 | -514.282 | -740.101 |
| 6.159999999999913 | 3.415 | -12.042 | -48.802 | -111.854 | -206.587 | -338.789 | -514.646 | -740.746 |
| 6.169999999999913 | 3.479 | -11.947 | -48.705 | -111.792 | -206.607 | -338.947 | -515.009 | -741.389 |
| 6.179999999999913 | 3.543 | -11.851 | -48.607 | -111.73 | -206.627 | -339.104 | -515.37 | -742.03 |
| 6.189999999999912 | 3.607 | -11.755 | -48.508 | -111.666 | -206.645 | -339.26 | -515.729 | -742.67 |
| 6.199999999999912 | 3.671 | -11.658 | -48.409 | -111.602 | -206.663 | -339.415 | -516.087 | -743.308 |
| 6.209999999999912 | 3.736 | -11.561 | -48.309 | -111.537 | -206.679 | -339.569 | -516.444 | -743.944 |
| 6.219999999999912 | 3.801 | -11.464 | -48.209 | -111.472 | -206.694 | -339.721 | -516.799 | -744.578 |
| 6.229999999999912 | 3.865 | -11.366 | -48.108 | -111.405 | -206.709 | -339.872 | -517.152 | -745.211 |
| 6.239999999999911 | 3.93 | -11.268 | -48.006 | -111.338 | -206.722 | -340.022 | -517.504 | -745.841 |
| 6.249999999999911 | 3.996 | -11.17 | -47.904 | -111.27 | -206.734 | -340.17 | -517.854 | -746.47 |
| 6.259999999999911 | 4.061 | -11.071 | -47.802 | -111.201 | -206.746 | -340.317 | -518.203 | -747.097 |
| 6.269999999999911 | 4.127 | -10.972 | -47.699 | -111.132 | -206.756 | -340.463 | -518.551 | -747.722 |
| 6.27999999999991 | 4.192 | -10.873 | -47.595 | -111.061 | -206.766 | -340.608 | -518.897 | -748.346 |
| 6.28999999999991 | 4.258 | -10.773 | -47.491 | -110.99 | -206.774 | -340.752 | -519.241 | -748.967 |
| 6.29999999999991 | 4.324 | -10.673 | -47.386 | -110.919 | -206.781 | -340.894 | -519.584 | -749.587 |
| 6.30999999999991 | 4.39 | -10.572 | -47.281 | -110.846 | -206.788 | -341.035 | -519.925 | -750.205 |
| 6.31999999999991 | 4.457 | -10.472 | -47.175 | -110.773 | -206.793 | -341.175 | -520.265 | -750.822 |
| 6.329999999999909 | 4.523 | -10.371 | -47.069 | -110.698 | -206.797 | -341.313 | -520.603 | -751.436 |
| 6.33999999999991 | 4.59 | -10.269 | -46.962 | -110.624 | -206.801 | -341.45 | -520.94 | -752.049 |
| 6.349999999999909 | 4.657 | -10.167 | -46.854 | -110.548 | -206.803 | -341.586 | -521.275 | -752.66 |
| 6.359999999999909 | 4.724 | -10.065 | -46.746 | -110.471 | -206.805 | -341.721 | -521.609 | -753.269 |
| 6.369999999999909 | 4.791 | -9.962 | -46.638 | -110.394 | -206.805 | -341.855 | -521.942 | -753.876 |
| 6.379999999999908 | 4.859 | -9.859 | -46.528 | -110.316 | -206.804 | -341.987 | -522.272 | -754.482 |
| 6.389999999999908 | 4.926 | -9.756 | -46.419 | -110.238 | -206.803 | -342.118 | -522.602 | -755.086 |
| 6.399999999999908 | 4.994 | -9.652 | -46.308 | -110.158 | -206.8 | -342.248 | -522.929 | -755.688 |
| 6.409999999999907 | 5.062 | -9.548 | -46.198 | -110.078 | -206.796 | -342.376 | -523.256 | -756.288 |
| 6.419999999999907 | 5.13 | -9.444 | -46.086 | -109.997 | -206.792 | -342.503 | -523.58 | -756.886 |
| 6.429999999999907 | 5.198 | -9.339 | -45.974 | -109.915 | -206.786 | -342.63 | -523.903 | -757.483 |
| 6.439999999999907 | 5.267 | -9.234 | -45.862 | -109.832 | -206.78 | -342.754 | -524.225 | -758.078 |
| 6.449999999999906 | 5.335 | -9.129 | -45.749 | -109.749 | -206.772 | -342.878 | -524.545 | -758.671 |
| 6.459999999999906 | 5.404 | -9.023 | -45.635 | -109.665 | -206.763 | -343 | -524.864 | -759.262 |
| 6.469999999999906 | 5.473 | -8.917 | -45.521 | -109.58 | -206.754 | -343.121 | -525.181 | -759.851 |
| 6.479999999999906 | 5.542 | -8.811 | -45.407 | -109.494 | -206.743 | -343.241 | -525.497 | -760.439 |
| 6.489999999999906 | 5.611 | -8.704 | -45.291 | -109.408 | -206.731 | -343.36 | -525.811 | -761.025 |
| 6.499999999999905 | 5.68 | -8.597 | -45.176 | -109.321 | -206.719 | -343.477 | -526.124 | -761.609 |
| 6.509999999999905 | 5.75 | -8.489 | -45.059 | -109.233 | -206.705 | -343.593 | -526.435 | -762.191 |
| 6.519999999999905 | 5.82 | -8.381 | -44.942 | -109.144 | -206.691 | -343.708 | -526.744 | -762.772 |
| 6.529999999999905 | 5.89 | -8.273 | -44.825 | -109.055 | -206.675 | -343.821 | -527.052 | -763.35 |
| 6.539999999999904 | 5.96 | -8.165 | -44.707 | -108.964 | -206.658 | -343.934 | -527.359 | -763.927 |
| 6.549999999999904 | 6.03 | -8.056 | -44.588 | -108.873 | -206.641 | -344.045 | -527.664 | -764.502 |
| 6.559999999999904 | 6.1 | -7.946 | -44.469 | -108.782 | -206.622 | -344.154 | -527.968 | -765.075 |
| 6.569999999999904 | 6.171 | -7.837 | -44.35 | -108.689 | -206.602 | -344.263 | -528.27 | -765.647 |
| 6.579999999999904 | 6.242 | -7.727 | -44.229 | -108.596 | -206.582 | -344.37 | -528.57 | -766.217 |
| 6.589999999999904 | 6.313 | -7.617 | -44.109 | -108.502 | -206.56 | -344.476 | -528.869 | -766.785 |
| 6.599999999999904 | 6.384 | -7.506 | -43.987 | -108.407 | -206.538 | -344.581 | -529.167 | -767.351 |
| 6.609999999999903 | 6.455 | -7.395 | -43.866 | -108.311 | -206.514 | -344.685 | -529.463 | -767.915 |
| 6.619999999999903 | 6.526 | -7.284 | -43.743 | -108.215 | -206.489 | -344.787 | -529.757 | -768.478 |
| 6.629999999999903 | 6.598 | -7.172 | -43.62 | -108.118 | -206.464 | -344.888 | -530.05 | -769.038 |
| 6.639999999999903 | 6.67 | -7.06 | -43.497 | -108.02 | -206.437 | -344.988 | -530.342 | -769.597 |
| 6.649999999999903 | 6.742 | -6.947 | -43.373 | -107.921 | -206.409 | -345.086 | -530.631 | -770.154 |
| 6.659999999999902 | 6.814 | -6.834 | -43.248 | -107.821 | -206.381 | -345.184 | -530.92 | -770.71 |
| 6.669999999999902 | 6.886 | -6.721 | -43.123 | -107.721 | -206.351 | -345.28 | -531.207 | -771.263 |
| 6.679999999999902 | 6.959 | -6.608 | -42.997 | -107.62 | -206.321 | -345.375 | -531.492 | -771.815 |
| 6.689999999999902 | 7.031 | -6.494 | -42.871 | -107.518 | -206.289 | -345.468 | -531.776 | -772.365 |
| 6.699999999999901 | 7.104 | -6.38 | -42.744 | -107.416 | -206.256 | -345.561 | -532.058 | -772.913 |
| 6.709999999999901 | 7.177 | -6.265 | -42.617 | -107.313 | -206.223 | -345.652 | -532.339 | -773.46 |
| 6.719999999999901 | 7.25 | -6.15 | -42.489 | -107.208 | -206.188 | -345.742 | -532.619 | -774.004 |
| 6.729999999999901 | 7.323 | -6.035 | -42.36 | -107.104 | -206.152 | -345.83 | -532.897 | -774.547 |
| 6.7399999999999 | 7.397 | -5.92 | -42.231 | -106.998 | -206.116 | -345.918 | -533.173 | -775.088 |
| 6.7499999999999 | 7.47 | -5.804 | -42.102 | -106.892 | -206.078 | -346.004 | -533.448 | -775.628 |
| 6.7599999999999 | 7.544 | -5.687 | -41.972 | -106.784 | -206.04 | -346.088 | -533.721 | -776.165 |
| 6.7699999999999 | 7.618 | -5.571 | -41.841 | -106.677 | -206 | -346.172 | -533.993 | -776.701 |
| 6.7799999999999 | 7.692 | -5.454 | -41.71 | -106.568 | -205.959 | -346.254 | -534.263 | -777.235 |
| 6.7899999999999 | 7.766 | -5.336 | -41.578 | -106.458 | -205.918 | -346.336 | -534.532 | -777.767 |
| 6.7999999999999 | 7.841 | -5.219 | -41.446 | -106.348 | -205.875 | -346.415 | -534.799 | -778.297 |
| 6.8099999999999 | 7.915 | -5.1 | -41.313 | -106.237 | -205.831 | -346.494 | -535.065 | -778.825 |
| 6.819999999999899 | 7.99 | -4.982 | -41.179 | -106.125 | -205.787 | -346.571 | -535.329 | -779.352 |
| 6.829999999999899 | 8.065 | -4.863 | -41.045 | -106.013 | -205.741 | -346.647 | -535.592 | -779.877 |
| 6.839999999999898 | 8.14 | -4.744 | -40.911 | -105.9 | -205.695 | -346.722 | -535.853 | -780.4 |
| 6.849999999999898 | 8.216 | -4.625 | -40.776 | -105.786 | -205.647 | -346.796 | -536.113 | -780.922 |
| 6.859999999999898 | 8.291 | -4.505 | -40.64 | -105.671 | -205.598 | -346.868 | -536.371 | -781.441 |
| 6.869999999999898 | 8.367 | -4.385 | -40.504 | -105.555 | -205.549 | -346.939 | -536.628 | -781.959 |
| 6.879999999999897 | 8.442 | -4.264 | -40.367 | -105.439 | -205.498 | -347.009 | -536.883 | -782.475 |
| 6.889999999999897 | 8.518 | -4.143 | -40.23 | -105.322 | -205.446 | -347.078 | -537.136 | -782.989 |
| 6.899999999999897 | 8.595 | -4.022 | -40.092 | -105.204 | -205.394 | -347.145 | -537.389 | -783.501 |
| 6.909999999999897 | 8.671 | -3.9 | -39.953 | -105.085 | -205.34 | -347.211 | -537.639 | -784.012 |
| 6.919999999999896 | 8.747 | -3.779 | -39.814 | -104.966 | -205.286 | -347.276 | -537.888 | -784.521 |
| 6.929999999999896 | 8.824 | -3.656 | -39.675 | -104.845 | -205.23 | -347.34 | -538.136 | -785.028 |
| 6.939999999999896 | 8.901 | -3.534 | -39.535 | -104.724 | -205.173 | -347.402 | -538.382 | -785.533 |
| 6.949999999999896 | 8.978 | -3.411 | -39.394 | -104.603 | -205.116 | -347.463 | -538.627 | -786.036 |
| 6.959999999999896 | 9.055 | -3.287 | -39.253 | -104.48 | -205.057 | -347.523 | -538.87 | -786.538 |
| 6.969999999999895 | 9.132 | -3.164 | -39.111 | -104.357 | -204.997 | -347.582 | -539.111 | -787.038 |
| 6.979999999999895 | 9.21 | -3.04 | -38.969 | -104.233 | -204.937 | -347.639 | -539.351 | -787.536 |
| 6.989999999999895 | 9.287 | -2.915 | -38.826 | -104.108 | -204.875 | -347.696 | -539.59 | -788.032 |
| 6.999999999999895 | 9.365 | -2.79 | -38.683 | -103.982 | -204.813 | -347.75 | -539.827 | -788.526 |
| 7.009999999999894 | 9.443 | -2.665 | -38.539 | -103.856 | -204.749 | -347.804 | -540.062 | -789.019 |
| 7.019999999999894 | 9.521 | -2.54 | -38.394 | -103.729 | -204.684 | -347.856 | -540.296 | -789.51 |
| 7.029999999999894 | 9.6 | -2.414 | -38.249 | -103.601 | -204.619 | -347.908 | -540.529 | -789.999 |
| 7.039999999999894 | 9.678 | -2.288 | -38.104 | -103.472 | -204.552 | -347.958 | -540.76 | -790.486 |
| 7.049999999999894 | 9.757 | -2.161 | -37.958 | -103.343 | -204.484 | -348.006 | -540.989 | -790.972 |
| 7.059999999999894 | 9.835 | -2.034 | -37.811 | -103.213 | -204.416 | -348.054 | -541.217 | -791.455 |
| 7.069999999999894 | 9.914 | -1.907 | -37.664 | -103.082 | -204.346 | -348.1 | -541.444 | -791.937 |
| 7.079999999999893 | 9.994 | -1.78 | -37.516 | -102.95 | -204.276 | -348.145 | -541.669 | -792.417 |
| 7.089999999999893 | 10.073 | -1.652 | -37.368 | -102.818 | -204.204 | -348.188 | -541.892 | -792.896 |
| 7.099999999999893 | 10.152 | -1.524 | -37.219 | -102.684 | -204.131 | -348.231 | -542.114 | -793.372 |
| 7.109999999999893 | 10.232 | -1.395 | -37.069 | -102.55 | -204.058 | -348.272 | -542.334 | -793.847 |
| 7.119999999999893 | 10.312 | -1.266 | -36.919 | -102.415 | -203.983 | -348.312 | -542.553 | -794.32 |
| 7.129999999999892 | 10.392 | -1.137 | -36.769 | -102.28 | -203.907 | -348.35 | -542.771 | -794.791 |
| 7.139999999999892 | 10.472 | -1.007 | -36.618 | -102.144 | -203.831 | -348.388 | -542.986 | -795.261 |
| 7.149999999999892 | 10.552 | -0.877 | -36.466 | -102.006 | -203.753 | -348.424 | -543.201 | -795.728 |
| 7.159999999999892 | 10.633 | -0.746 | -36.314 | -101.869 | -203.675 | -348.459 | -543.414 | -796.194 |
| 7.169999999999892 | 10.714 | -0.616 | -36.161 | -101.73 | -203.595 | -348.493 | -543.625 | -796.658 |
| 7.179999999999891 | 10.794 | -0.485 | -36.008 | -101.591 | -203.514 | -348.525 | -543.835 | -797.12 |
| 7.189999999999891 | 10.875 | -0.353 | -35.854 | -101.45 | -203.433 | -348.556 | -544.043 | -797.58 |
| 7.199999999999891 | 10.957 | -0.221 | -35.699 | -101.309 | -203.35 | -348.586 | -544.25 | -798.039 |
| 7.20999999999989 | 11.038 | -0.089 | -35.544 | -101.168 | -203.266 | -348.615 | -544.455 | -798.496 |
| 7.21999999999989 | 11.119 | 0.043 | -35.389 | -101.025 | -203.182 | -348.642 | -544.659 | -798.951 |
| 7.22999999999989 | 11.201 | 0.176 | -35.233 | -100.882 | -203.096 | -348.669 | -544.861 | -799.404 |
| 7.23999999999989 | 11.283 | 0.309 | -35.076 | -100.738 | -203.01 | -348.694 | -545.062 | -799.856 |
| 7.24999999999989 | 11.365 | 0.443 | -34.919 | -100.593 | -202.922 | -348.717 | -545.261 | -800.305 |
| 7.25999999999989 | 11.447 | 0.577 | -34.761 | -100.448 | -202.833 | -348.74 | -545.459 | -800.753 |
| 7.26999999999989 | 11.529 | 0.711 | -34.603 | -100.301 | -202.744 | -348.761 | -545.655 | -801.199 |
| 7.27999999999989 | 11.612 | 0.846 | -34.444 | -100.154 | -202.653 | -348.781 | -545.85 | -801.643 |
| 7.289999999999888 | 11.695 | 0.981 | -34.285 | -100.006 | -202.561 | -348.8 | -546.043 | -802.086 |
| 7.299999999999888 | 11.777 | 1.116 | -34.125 | -99.858 | -202.469 | -348.817 | -546.235 | -802.527 |
| 7.309999999999888 | 11.861 | 1.252 | -33.964 | -99.708 | -202.375 | -348.833 | -546.425 | -802.965 |
| 7.319999999999888 | 11.944 | 1.388 | -33.803 | -99.558 | -202.281 | -348.848 | -546.613 | -803.403 |
| 7.329999999999888 | 12.027 | 1.524 | -33.642 | -99.407 | -202.185 | -348.862 | -546.8 | -803.838 |
| 7.339999999999887 | 12.111 | 1.661 | -33.48 | -99.256 | -202.088 | -348.874 | -546.986 | -804.271 |
| 7.349999999999887 | 12.194 | 1.798 | -33.317 | -99.103 | -201.991 | -348.886 | -547.17 | -804.703 |
| 7.359999999999887 | 12.278 | 1.935 | -33.154 | -98.95 | -201.892 | -348.895 | -547.353 | -805.133 |
| 7.369999999999887 | 12.362 | 2.073 | -32.99 | -98.796 | -201.792 | -348.904 | -547.534 | -805.561 |
| 7.379999999999887 | 12.446 | 2.211 | -32.826 | -98.641 | -201.692 | -348.912 | -547.713 | -805.988 |
| 7.389999999999886 | 12.531 | 2.349 | -32.661 | -98.486 | -201.59 | -348.918 | -547.891 | -806.412 |
| 7.399999999999886 | 12.615 | 2.488 | -32.495 | -98.329 | -201.488 | -348.923 | -548.068 | -806.835 |
| 7.409999999999886 | 12.7 | 2.628 | -32.329 | -98.172 | -201.384 | -348.927 | -548.243 | -807.256 |
| 7.419999999999886 | 12.785 | 2.767 | -32.163 | -98.014 | -201.279 | -348.929 | -548.417 | -807.675 |
| 7.429999999999885 | 12.87 | 2.907 | -31.995 | -97.856 | -201.174 | -348.93 | -548.589 | -808.092 |
| 7.439999999999885 | 12.955 | 3.047 | -31.828 | -97.696 | -201.067 | -348.93 | -548.759 | -808.508 |
| 7.449999999999885 | 13.04 | 3.188 | -31.66 | -97.536 | -200.959 | -348.929 | -548.928 | -808.922 |
| 7.459999999999885 | 13.126 | 3.329 | -31.491 | -97.375 | -200.851 | -348.927 | -549.095 | -809.334 |
| 7.469999999999885 | 13.212 | 3.47 | -31.322 | -97.214 | -200.741 | -348.923 | -549.261 | -809.744 |
| 7.479999999999884 | 13.297 | 3.612 | -31.152 | -97.051 | -200.631 | -348.918 | -549.426 | -810.153 |
| 7.489999999999884 | 13.384 | 3.754 | -30.981 | -96.888 | -200.519 | -348.912 | -549.589 | -810.559 |
| 7.499999999999884 | 13.47 | 3.896 | -30.81 | -96.724 | -200.406 | -348.904 | -549.75 | -810.964 |
| 7.509999999999884 | 13.556 | 4.039 | -30.639 | -96.559 | -200.293 | -348.895 | -549.91 | -811.367 |
| 7.519999999999884 | 13.643 | 4.182 | -30.467 | -96.394 | -200.178 | -348.885 | -550.069 | -811.768 |
| 7.529999999999884 | 13.729 | 4.325 | -30.294 | -96.227 | -200.062 | -348.874 | -550.225 | -812.168 |
| 7.539999999999883 | 13.816 | 4.469 | -30.121 | -96.06 | -199.946 | -348.862 | -550.381 | -812.565 |
| 7.549999999999883 | 13.903 | 4.613 | -29.947 | -95.893 | -199.828 | -348.848 | -550.535 | -812.961 |
| 7.559999999999883 | 13.991 | 4.758 | -29.773 | -95.724 | -199.71 | -348.833 | -550.687 | -813.355 |
| 7.569999999999883 | 14.078 | 4.902 | -29.598 | -95.555 | -199.59 | -348.817 | -550.838 | -813.748 |
| 7.579999999999882 | 14.165 | 5.047 | -29.423 | -95.384 | -199.469 | -348.799 | -550.987 | -814.138 |
| 7.589999999999882 | 14.253 | 5.193 | -29.247 | -95.214 | -199.348 | -348.78 | -551.135 | -814.527 |
| 7.599999999999882 | 14.341 | 5.339 | -29.07 | -95.042 | -199.225 | -348.76 | -551.281 | -814.914 |
| 7.609999999999882 | 14.429 | 5.485 | -28.893 | -94.869 | -199.101 | -348.739 | -551.426 | -815.299 |
| 7.619999999999882 | 14.517 | 5.632 | -28.715 | -94.696 | -198.977 | -348.717 | -551.569 | -815.682 |
| 7.629999999999882 | 14.606 | 5.779 | -28.537 | -94.522 | -198.851 | -348.693 | -551.711 | -816.064 |
| 7.639999999999881 | 14.694 | 5.926 | -28.359 | -94.348 | -198.725 | -348.668 | -551.851 | -816.444 |
| 7.649999999999881 | 14.783 | 6.074 | -28.179 | -94.172 | -198.597 | -348.642 | -551.99 | -816.822 |
| 7.659999999999881 | 14.872 | 6.222 | -28 | -93.996 | -198.468 | -348.614 | -552.127 | -817.198 |
| 7.669999999999881 | 14.961 | 6.37 | -27.819 | -93.819 | -198.339 | -348.585 | -552.263 | -817.572 |
| 7.67999999999988 | 15.05 | 6.519 | -27.638 | -93.641 | -198.208 | -348.556 | -552.397 | -817.945 |
| 7.68999999999988 | 15.14 | 6.668 | -27.457 | -93.462 | -198.076 | -348.524 | -552.53 | -818.316 |
| 7.69999999999988 | 15.229 | 6.817 | -27.275 | -93.283 | -197.944 | -348.492 | -552.661 | -818.685 |
| 7.70999999999988 | 15.319 | 6.967 | -27.092 | -93.103 | -197.81 | -348.458 | -552.791 | -819.052 |
| 7.71999999999988 | 15.409 | 7.117 | -26.909 | -92.922 | -197.676 | -348.423 | -552.919 | -819.417 |
| 7.72999999999988 | 15.499 | 7.267 | -26.725 | -92.74 | -197.54 | -348.387 | -553.046 | -819.781 |
| 7.73999999999988 | 15.589 | 7.418 | -26.541 | -92.558 | -197.403 | -348.35 | -553.171 | -820.143 |
| 7.74999999999988 | 15.68 | 7.569 | -26.356 | -92.375 | -197.266 | -348.311 | -553.294 | -820.503 |
| 7.759999999999878 | 15.77 | 7.721 | -26.171 | -92.191 | -197.127 | -348.271 | -553.417 | -820.861 |
| 7.769999999999878 | 15.861 | 7.873 | -25.985 | -92.006 | -196.987 | -348.23 | -553.537 | -821.218 |
| 7.779999999999878 | 15.952 | 8.025 | -25.799 | -91.821 | -196.847 | -348.187 | -553.656 | -821.572 |
| 7.789999999999878 | 16.043 | 8.177 | -25.612 | -91.634 | -196.705 | -348.144 | -553.774 | -821.925 |
| 7.799999999999878 | 16.134 | 8.33 | -25.424 | -91.447 | -196.563 | -348.099 | -553.89 | -822.276 |
| 7.809999999999877 | 16.226 | 8.484 | -25.236 | -91.26 | -196.419 | -348.052 | -554.004 | -822.625 |
| 7.819999999999877 | 16.317 | 8.637 | -25.048 | -91.071 | -196.274 | -348.005 | -554.117 | -822.973 |
| 7.829999999999877 | 16.409 | 8.791 | -24.858 | -90.882 | -196.129 | -347.956 | -554.229 | -823.319 |
| 7.839999999999877 | 16.501 | 8.945 | -24.669 | -90.692 | -195.982 | -347.906 | -554.339 | -823.663 |
| 7.849999999999877 | 16.593 | 9.1 | -24.478 | -90.501 | -195.834 | -347.855 | -554.447 | -824.005 |
| 7.859999999999876 | 16.685 | 9.255 | -24.287 | -90.309 | -195.686 | -347.803 | -554.554 | -824.345 |
| 7.869999999999876 | 16.778 | 9.41 | -24.096 | -90.117 | -195.536 | -347.749 | -554.66 | -824.684 |
| 7.879999999999876 | 16.87 | 9.566 | -23.904 | -89.924 | -195.386 | -347.694 | -554.764 | -825.02 |
| 7.889999999999876 | 16.963 | 9.722 | -23.712 | -89.73 | -195.234 | -347.638 | -554.866 | -825.355 |
| 7.899999999999875 | 17.056 | 9.879 | -23.519 | -89.535 | -195.081 | -347.58 | -554.967 | -825.688 |
| 7.909999999999875 | 17.149 | 10.036 | -23.325 | -89.339 | -194.928 | -347.522 | -555.067 | -826.02 |
| 7.919999999999875 | 17.242 | 10.193 | -23.131 | -89.143 | -194.773 | -347.462 | -555.165 | -826.349 |
| 7.929999999999875 | 17.336 | 10.35 | -22.936 | -88.946 | -194.617 | -347.401 | -555.261 | -826.677 |
| 7.939999999999875 | 17.429 | 10.508 | -22.741 | -88.748 | -194.461 | -347.338 | -555.356 | -827.003 |
| 7.949999999999874 | 17.523 | 10.666 | -22.545 | -88.55 | -194.303 | -347.275 | -555.449 | -827.327 |
| 7.959999999999874 | 17.617 | 10.825 | -22.349 | -88.351 | -194.145 | -347.21 | -555.541 | -827.65 |
| 7.969999999999874 | 17.711 | 10.984 | -22.152 | -88.15 | -193.985 | -347.144 | -555.632 | -827.97 |
| 7.979999999999874 | 17.805 | 11.143 | -21.954 | -87.95 | -193.824 | -347.076 | -555.72 | -828.289 |
| 7.989999999999874 | 17.9 | 11.302 | -21.756 | -87.748 | -193.663 | -347.008 | -555.808 | -828.606 |
| 7.999999999999873 | 17.994 | 11.462 | -21.558 | -87.546 | -193.5 | -346.938 | -555.894 | -828.922 |
| 8.009999999999874 | 18.089 | 11.623 | -21.358 | -87.342 | -193.336 | -346.866 | -555.978 | -829.235 |
| 8.019999999999873 | 18.184 | 11.783 | -21.159 | -87.139 | -193.172 | -346.794 | -556.061 | -829.547 |
| 8.029999999999873 | 18.279 | 11.944 | -20.959 | -86.934 | -193.006 | -346.72 | -556.142 | -829.857 |
| 8.039999999999873 | 18.375 | 12.106 | -20.758 | -86.728 | -192.84 | -346.646 | -556.222 | -830.165 |
| 8.049999999999873 | 18.47 | 12.267 | -20.556 | -86.522 | -192.672 | -346.569 | -556.3 | -830.471 |
| 8.059999999999873 | 18.566 | 12.43 | -20.355 | -86.315 | -192.503 | -346.492 | -556.377 | -830.775 |
| 8.069999999999872 | 18.661 | 12.592 | -20.152 | -86.107 | -192.334 | -346.413 | -556.452 | -831.078 |
| 8.079999999999872 | 18.757 | 12.755 | -19.949 | -85.899 | -192.163 | -346.333 | -556.526 | -831.379 |
| 8.08999999999987 | 18.853 | 12.918 | -19.746 | -85.69 | -191.991 | -346.252 | -556.598 | -831.678 |
| 8.099999999999872 | 18.95 | 13.081 | -19.541 | -85.48 | -191.819 | -346.17 | -556.669 | -831.976 |
| 8.109999999999872 | 19.046 | 13.245 | -19.337 | -85.269 | -191.645 | -346.086 | -556.738 | -832.271 |
| 8.119999999999871 | 19.143 | 13.409 | -19.132 | -85.057 | -191.471 | -346.001 | -556.806 | -832.565 |
| 8.129999999999871 | 19.24 | 13.574 | -18.926 | -84.845 | -191.295 | -345.915 | -556.872 | -832.857 |
| 8.139999999999871 | 19.337 | 13.739 | -18.72 | -84.632 | -191.118 | -345.828 | -556.936 | -833.147 |
| 8.14999999999987 | 19.434 | 13.904 | -18.513 | -84.418 | -190.941 | -345.739 | -557 | -833.435 |
| 8.15999999999987 | 19.531 | 14.07 | -18.305 | -84.203 | -190.762 | -345.649 | -557.061 | -833.722 |
| 8.16999999999987 | 19.628 | 14.235 | -18.097 | -83.988 | -190.582 | -345.558 | -557.121 | -834.007 |
| 8.17999999999987 | 19.726 | 14.402 | -17.889 | -83.771 | -190.402 | -345.466 | -557.18 | -834.29 |
| 8.18999999999987 | 19.824 | 14.568 | -17.68 | -83.554 | -190.22 | -345.372 | -557.237 | -834.571 |
| 8.19999999999987 | 19.922 | 14.735 | -17.47 | -83.337 | -190.038 | -345.277 | -557.293 | -834.85 |
| 8.20999999999987 | 20.02 | 14.903 | -17.26 | -83.118 | -189.854 | -345.181 | -557.347 | -835.128 |
| 8.21999999999987 | 20.118 | 15.07 | -17.049 | -82.899 | -189.669 | -345.084 | -557.399 | -835.404 |
| 8.229999999999867 | 20.217 | 15.238 | -16.838 | -82.679 | -189.484 | -344.985 | -557.45 | -835.678 |
| 8.239999999999869 | 20.315 | 15.407 | -16.626 | -82.458 | -189.297 | -344.886 | -557.5 | -835.95 |
| 8.249999999999869 | 20.414 | 15.576 | -16.414 | -82.236 | -189.109 | -344.784 | -557.548 | -836.22 |
| 8.259999999999868 | 20.513 | 15.745 | -16.201 | -82.014 | -188.921 | -344.682 | -557.594 | -836.489 |
| 8.269999999999868 | 20.612 | 15.914 | -15.987 | -81.791 | -188.731 | -344.578 | -557.639 | -836.756 |
| 8.279999999999866 | 20.712 | 16.084 | -15.773 | -81.567 | -188.541 | -344.474 | -557.683 | -837.021 |
| 8.289999999999868 | 20.811 | 16.254 | -15.559 | -81.342 | -188.349 | -344.368 | -557.725 | -837.284 |
| 8.299999999999867 | 20.911 | 16.425 | -15.344 | -81.117 | -188.156 | -344.26 | -557.765 | -837.546 |
| 8.309999999999867 | 21.011 | 16.596 | -15.128 | -80.891 | -187.963 | -344.152 | -557.804 | -837.805 |
| 8.319999999999867 | 21.111 | 16.767 | -14.912 | -80.664 | -187.768 | -344.042 | -557.842 | -838.063 |
| 8.329999999999867 | 21.211 | 16.938 | -14.695 | -80.436 | -187.572 | -343.931 | -557.878 | -838.319 |
| 8.339999999999867 | 21.311 | 17.11 | -14.478 | -80.208 | -187.376 | -343.818 | -557.912 | -838.574 |
| 8.349999999999866 | 21.412 | 17.282 | -14.26 | -79.978 | -187.178 | -343.705 | -557.945 | -838.826 |
| 8.359999999999866 | 21.512 | 17.455 | -14.041 | -79.748 | -186.98 | -343.59 | -557.976 | -839.077 |
| 8.369999999999864 | 21.613 | 17.628 | -13.822 | -79.517 | -186.78 | -343.474 | -558.006 | -839.326 |
| 8.379999999999866 | 21.714 | 17.801 | -13.603 | -79.286 | -186.579 | -343.356 | -558.034 | -839.573 |
| 8.389999999999866 | 21.815 | 17.975 | -13.383 | -79.054 | -186.378 | -343.238 | -558.061 | -839.819 |
| 8.399999999999865 | 21.917 | 18.149 | -13.162 | -78.82 | -186.175 | -343.118 | -558.087 | -840.062 |
| 8.409999999999865 | 22.018 | 18.324 | -12.941 | -78.587 | -185.971 | -342.997 | -558.111 | -840.304 |
| 8.419999999999863 | 22.12 | 18.498 | -12.719 | -78.352 | -185.767 | -342.875 | -558.133 | -840.544 |
| 8.429999999999865 | 22.222 | 18.673 | -12.497 | -78.117 | -185.561 | -342.751 | -558.154 | -840.782 |
| 8.439999999999864 | 22.324 | 18.849 | -12.274 | -77.88 | -185.355 | -342.626 | -558.173 | -841.018 |
| 8.449999999999864 | 22.426 | 19.025 | -12.05 | -77.643 | -185.147 | -342.5 | -558.191 | -841.253 |
| 8.459999999999864 | 22.528 | 19.201 | -11.826 | -77.406 | -184.938 | -342.373 | -558.207 | -841.486 |
| 8.469999999999864 | 22.631 | 19.377 | -11.602 | -77.167 | -184.729 | -342.244 | -558.222 | -841.717 |
| 8.479999999999864 | 22.733 | 19.554 | -11.377 | -76.928 | -184.518 | -342.115 | -558.235 | -841.946 |
| 8.489999999999863 | 22.836 | 19.731 | -11.151 | -76.688 | -184.306 | -341.984 | -558.247 | -842.174 |
| 8.499999999999863 | 22.939 | 19.909 | -10.925 | -76.447 | -184.094 | -341.851 | -558.257 | -842.399 |
| 8.509999999999863 | 23.042 | 20.087 | -10.698 | -76.206 | -183.88 | -341.718 | -558.266 | -842.623 |
| 8.519999999999863 | 23.146 | 20.265 | -10.471 | -75.963 | -183.666 | -341.583 | -558.273 | -842.845 |
| 8.529999999999863 | 23.249 | 20.444 | -10.243 | -75.72 | -183.45 | -341.447 | -558.279 | -843.065 |
| 8.539999999999862 | 23.353 | 20.623 | -10.015 | -75.476 | -183.233 | -341.31 | -558.283 | -843.284 |
| 8.549999999999862 | 23.457 | 20.802 | -9.786 | -75.232 | -183.016 | -341.171 | -558.285 | -843.501 |
| 8.55999999999986 | 23.561 | 20.982 | -9.556 | -74.986 | -182.797 | -341.031 | -558.287 | -843.715 |
| 8.56999999999986 | 23.665 | 21.162 | -9.326 | -74.74 | -182.577 | -340.89 | -558.286 | -843.929 |
| 8.57999999999986 | 23.769 | 21.342 | -9.096 | -74.493 | -182.357 | -340.748 | -558.284 | -844.14 |
| 8.58999999999986 | 23.874 | 21.523 | -8.865 | -74.246 | -182.135 | -340.604 | -558.281 | -844.349 |
| 8.59999999999986 | 23.978 | 21.704 | -8.633 | -73.997 | -181.913 | -340.46 | -558.276 | -844.557 |
| 8.60999999999986 | 24.083 | 21.885 | -8.401 | -73.748 | -181.689 | -340.313 | -558.27 | -844.763 |
| 8.61999999999986 | 24.188 | 22.067 | -8.168 | -73.498 | -181.464 | -340.166 | -558.262 | -844.967 |
| 8.62999999999986 | 24.293 | 22.249 | -7.934 | -73.247 | -181.239 | -340.018 | -558.252 | -845.17 |
| 8.63999999999986 | 24.399 | 22.431 | -7.701 | -72.996 | -181.012 | -339.868 | -558.241 | -845.37 |
| 8.64999999999986 | 24.504 | 22.614 | -7.466 | -72.743 | -180.784 | -339.717 | -558.229 | -845.569 |
| 8.65999999999986 | 24.61 | 22.798 | -7.231 | -72.49 | -180.556 | -339.565 | -558.215 | -845.766 |
| 8.66999999999986 | 24.716 | 22.981 | -6.995 | -72.236 | -180.326 | -339.411 | -558.199 | -845.961 |
| 8.67999999999986 | 24.822 | 23.165 | -6.759 | -71.982 | -180.096 | -339.256 | -558.182 | -846.154 |
| 8.68999999999986 | 24.928 | 23.349 | -6.523 | -71.726 | -179.864 | -339.1 | -558.164 | -846.346 |
| 8.699999999999857 | 25.035 | 23.534 | -6.285 | -71.47 | -179.631 | -338.943 | -558.144 | -846.536 |
| 8.709999999999859 | 25.141 | 23.719 | -6.048 | -71.213 | -179.398 | -338.785 | -558.122 | -846.724 |
| 8.719999999999859 | 25.248 | 23.904 | -5.809 | -70.956 | -179.163 | -338.625 | -558.099 | -846.91 |
| 8.729999999999858 | 25.355 | 24.09 | -5.571 | -70.697 | -178.927 | -338.464 | -558.075 | -847.095 |
| 8.739999999999858 | 25.462 | 24.276 | -5.331 | -70.438 | -178.691 | -338.302 | -558.049 | -847.277 |
| 8.749999999999858 | 25.569 | 24.462 | -5.091 | -70.178 | -178.453 | -338.138 | -558.021 | -847.458 |
| 8.759999999999858 | 25.676 | 24.649 | -4.851 | -69.917 | -178.215 | -337.973 | -557.992 | -847.637 |
| 8.769999999999857 | 25.784 | 24.836 | -4.61 | -69.656 | -177.975 | -337.807 | -557.961 | -847.814 |
| 8.779999999999857 | 25.892 | 25.023 | -4.368 | -69.393 | -177.734 | -337.64 | -557.929 | -847.99 |
| 8.789999999999857 | 25.999 | 25.211 | -4.126 | -69.13 | -177.493 | -337.472 | -557.896 | -848.163 |
| 8.799999999999857 | 26.107 | 25.399 | -3.883 | -68.867 | -177.25 | -337.302 | -557.861 | -848.335 |
| 8.809999999999857 | 26.216 | 25.588 | -3.64 | -68.602 | -177.006 | -337.131 | -557.824 | -848.505 |
| 8.819999999999856 | 26.324 | 25.776 | -3.396 | -68.337 | -176.762 | -336.959 | -557.786 | -848.674 |
| 8.829999999999856 | 26.433 | 25.965 | -3.151 | -68.07 | -176.516 | -336.785 | -557.746 | -848.84 |
| 8.839999999999854 | 26.541 | 26.155 | -2.906 | -67.804 | -176.27 | -336.61 | -557.705 | -849.005 |
| 8.849999999999856 | 26.65 | 26.345 | -2.661 | -67.536 | -176.022 | -336.434 | -557.662 | -849.168 |
| 8.859999999999856 | 26.759 | 26.535 | -2.415 | -67.267 | -175.773 | -336.257 | -557.618 | -849.329 |
| 8.869999999999855 | 26.868 | 26.726 | -2.168 | -66.998 | -175.524 | -336.079 | -557.572 | -849.488 |
| 8.879999999999855 | 26.978 | 26.917 | -1.921 | -66.728 | -175.273 | -335.899 | -557.525 | -849.646 |
| 8.889999999999853 | 27.087 | 27.108 | -1.673 | -66.458 | -175.021 | -335.718 | -557.476 | -849.802 |
| 8.899999999999855 | 27.197 | 27.3 | -1.425 | -66.186 | -174.769 | -335.536 | -557.426 | -849.956 |
| 8.909999999999854 | 27.307 | 27.492 | -1.176 | -65.914 | -174.515 | -335.352 | -557.374 | -850.108 |
| 8.919999999999854 | 27.417 | 27.684 | -0.927 | -65.641 | -174.261 | -335.167 | -557.321 | -850.258 |
| 8.929999999999854 | 27.527 | 27.877 | -0.677 | -65.367 | -174.005 | -334.982 | -557.266 | -850.407 |
| 8.939999999999854 | 27.638 | 28.07 | -0.427 | -65.092 | -173.748 | -334.794 | -557.21 | -850.554 |
| 8.949999999999854 | 27.748 | 28.263 | -0.176 | -64.817 | -173.491 | -334.606 | -557.152 | -850.699 |
| 8.959999999999853 | 27.859 | 28.457 | 0.076 | -64.541 | -173.232 | -334.416 | -557.093 | -850.842 |
| 8.969999999999853 | 27.97 | 28.651 | 0.328 | -64.264 | -172.972 | -334.225 | -557.032 | -850.983 |
| 8.979999999999851 | 28.081 | 28.845 | 0.581 | -63.986 | -172.712 | -334.033 | -556.97 | -851.123 |
| 8.989999999999853 | 28.192 | 29.04 | 0.834 | -63.708 | -172.45 | -333.84 | -556.906 | -851.261 |
| 8.999999999999853 | 28.304 | 29.235 | 1.088 | -63.429 | -172.188 | -333.645 | -556.84 | -851.397 |
| 9.009999999999852 | 28.415 | 29.431 | 1.342 | -63.149 | -171.924 | -333.449 | -556.773 | -851.531 |
| 9.019999999999852 | 28.527 | 29.627 | 1.597 | -62.868 | -171.659 | -333.252 | -556.705 | -851.664 |
| 9.02999999999985 | 28.639 | 29.823 | 1.852 | -62.587 | -171.394 | -333.053 | -556.635 | -851.794 |
| 9.039999999999852 | 28.751 | 30.019 | 2.108 | -62.304 | -171.127 | -332.854 | -556.564 | -851.923 |
| 9.049999999999851 | 28.863 | 30.216 | 2.365 | -62.021 | -170.859 | -332.653 | -556.491 | -852.05 |
| 9.05999999999985 | 28.976 | 30.414 | 2.622 | -61.738 | -170.591 | -332.45 | -556.416 | -852.175 |
| 9.06999999999985 | 29.088 | 30.611 | 2.88 | -61.453 | -170.321 | -332.247 | -556.34 | -852.299 |
| 9.07999999999985 | 29.201 | 30.809 | 3.138 | -61.168 | -170.051 | -332.042 | -556.263 | -852.421 |
| 9.08999999999985 | 29.314 | 31.007 | 3.397 | -60.882 | -169.779 | -331.836 | -556.184 | -852.541 |
| 9.09999999999985 | 29.427 | 31.206 | 3.656 | -60.595 | -169.506 | -331.629 | -556.103 | -852.659 |
| 9.10999999999985 | 29.54 | 31.405 | 3.916 | -60.307 | -169.233 | -331.421 | -556.021 | -852.775 |
| 9.11999999999985 | 29.654 | 31.604 | 4.176 | -60.019 | -168.958 | -331.211 | -555.938 | -852.89 |
| 9.12999999999985 | 29.767 | 31.804 | 4.437 | -59.73 | -168.682 | -331 | -555.853 | -853.002 |
| 9.13999999999985 | 29.881 | 32.004 | 4.699 | -59.44 | -168.406 | -330.788 | -555.766 | -853.113 |
| 9.14999999999985 | 29.995 | 32.205 | 4.961 | -59.149 | -168.128 | -330.574 | -555.678 | -853.222 |
| 9.15999999999985 | 30.109 | 32.406 | 5.223 | -58.857 | -167.85 | -330.36 | -555.589 | -853.33 |
| 9.169999999999847 | 30.223 | 32.607 | 5.486 | -58.565 | -167.57 | -330.144 | -555.498 | -853.435 |
| 9.179999999999849 | 30.338 | 32.808 | 5.75 | -58.272 | -167.289 | -329.927 | -555.405 | -853.539 |
| 9.189999999999849 | 30.452 | 33.01 | 6.014 | -57.978 | -167.008 | -329.708 | -555.311 | -853.641 |
| 9.199999999999848 | 30.567 | 33.212 | 6.279 | -57.684 | -166.725 | -329.489 | -555.215 | -853.741 |
| 9.209999999999848 | 30.682 | 33.415 | 6.545 | -57.389 | -166.441 | -329.268 | -555.118 | -853.84 |
| 9.219999999999848 | 30.797 | 33.618 | 6.81 | -57.092 | -166.157 | -329.046 | -555.019 | -853.936 |
| 9.229999999999848 | 30.912 | 33.821 | 7.077 | -56.796 | -165.871 | -328.822 | -554.919 | -854.031 |
| 9.239999999999847 | 31.028 | 34.024 | 7.344 | -56.498 | -165.585 | -328.598 | -554.818 | -854.124 |
| 9.249999999999847 | 31.144 | 34.228 | 7.612 | -56.2 | -165.297 | -328.372 | -554.714 | -854.216 |
| 9.259999999999845 | 31.259 | 34.433 | 7.88 | -55.9 | -165.008 | -328.144 | -554.61 | -854.305 |
| 9.269999999999847 | 31.375 | 34.637 | 8.148 | -55.601 | -164.719 | -327.916 | -554.504 | -854.393 |
| 9.279999999999847 | 31.491 | 34.842 | 8.418 | -55.3 | -164.428 | -327.686 | -554.396 | -854.479 |
| 9.289999999999846 | 31.608 | 35.048 | 8.687 | -54.998 | -164.136 | -327.456 | -554.287 | -854.563 |
| 9.299999999999846 | 31.724 | 35.253 | 8.958 | -54.696 | -163.844 | -327.223 | -554.176 | -854.645 |
| 9.309999999999844 | 31.841 | 35.46 | 9.229 | -54.393 | -163.55 | -326.99 | -554.064 | -854.725 |
| 9.319999999999846 | 31.957 | 35.666 | 9.5 | -54.089 | -163.256 | -326.755 | -553.95 | -854.804 |
| 9.329999999999846 | 32.074 | 35.873 | 9.772 | -53.785 | -162.96 | -326.519 | -553.835 | -854.881 |
| 9.339999999999845 | 32.192 | 36.08 | 10.045 | -53.48 | -162.663 | -326.282 | -553.718 | -854.956 |
| 9.349999999999845 | 32.309 | 36.287 | 10.318 | -53.174 | -162.366 | -326.044 | -553.6 | -855.03 |
| 9.359999999999843 | 32.426 | 36.495 | 10.591 | -52.867 | -162.067 | -325.804 | -553.48 | -855.101 |
| 9.369999999999845 | 32.544 | 36.703 | 10.866 | -52.559 | -161.767 | -325.563 | -553.358 | -855.171 |
| 9.379999999999844 | 32.662 | 36.912 | 11.14 | -52.251 | -161.467 | -325.321 | -553.236 | -855.239 |
| 9.389999999999844 | 32.78 | 37.121 | 11.416 | -51.942 | -161.165 | -325.078 | -553.111 | -855.305 |
| 9.399999999999842 | 32.898 | 37.33 | 11.691 | -51.632 | -160.863 | -324.833 | -552.985 | -855.369 |
| 9.409999999999844 | 33.016 | 37.54 | 11.968 | -51.321 | -160.559 | -324.587 | -552.858 | -855.432 |
| 9.419999999999844 | 33.135 | 37.749 | 12.245 | -51.01 | -160.254 | -324.34 | -552.729 | -855.493 |
| 9.429999999999843 | 33.253 | 37.96 | 12.522 | -50.697 | -159.949 | -324.092 | -552.599 | -855.552 |
| 9.439999999999843 | 33.372 | 38.17 | 12.8 | -50.384 | -159.642 | -323.842 | -552.467 | -855.609 |
| 9.449999999999841 | 33.491 | 38.381 | 13.079 | -50.071 | -159.334 | -323.591 | -552.333 | -855.664 |
| 9.45999999999984 | 33.61 | 38.593 | 13.358 | -49.756 | -159.026 | -323.339 | -552.198 | -855.718 |
| 9.46999999999984 | 33.729 | 38.804 | 13.638 | -49.441 | -158.716 | -323.086 | -552.062 | -855.77 |
| 9.47999999999984 | 33.849 | 39.016 | 13.918 | -49.125 | -158.406 | -322.831 | -551.924 | -855.82 |
| 9.48999999999984 | 33.969 | 39.229 | 14.199 | -48.808 | -158.094 | -322.576 | -551.785 | -855.868 |
| 9.49999999999984 | 34.088 | 39.442 | 14.48 | -48.49 | -157.781 | -322.318 | -551.644 | -855.914 |
| 9.50999999999984 | 34.208 | 39.655 | 14.762 | -48.172 | -157.468 | -322.06 | -551.501 | -855.959 |
| 9.51999999999984 | 34.328 | 39.868 | 15.045 | -47.853 | -157.153 | -321.8 | -551.357 | -856.002 |
| 9.52999999999984 | 34.449 | 40.082 | 15.328 | -47.533 | -156.837 | -321.54 | -551.212 | -856.043 |
| 9.53999999999984 | 34.569 | 40.296 | 15.611 | -47.212 | -156.521 | -321.278 | -551.065 | -856.082 |
| 9.54999999999984 | 34.69 | 40.511 | 15.896 | -46.891 | -156.203 | -321.014 | -550.916 | -856.12 |
| 9.55999999999984 | 34.811 | 40.726 | 16.18 | -46.569 | -155.885 | -320.75 | -550.766 | -856.155 |
| 9.56999999999984 | 34.932 | 40.941 | 16.465 | -46.246 | -155.565 | -320.484 | -550.614 | -856.189 |
| 9.57999999999984 | 35.053 | 41.156 | 16.751 | -45.922 | -155.244 | -320.217 | -550.461 | -856.221 |
| 9.58999999999984 | 35.174 | 41.372 | 17.038 | -45.598 | -154.923 | -319.948 | -550.307 | -856.252 |
| 9.59999999999984 | 35.296 | 41.588 | 17.324 | -45.272 | -154.6 | -319.679 | -550.151 | -856.28 |
| 9.60999999999984 | 35.417 | 41.805 | 17.612 | -44.946 | -154.276 | -319.408 | -549.993 | -856.307 |
| 9.61999999999984 | 35.539 | 42.022 | 17.9 | -44.619 | -153.952 | -319.136 | -549.834 | -856.332 |
| 9.62999999999984 | 35.661 | 42.239 | 18.188 | -44.292 | -153.626 | -318.862 | -549.673 | -856.355 |
| 9.639999999999837 | 35.783 | 42.457 | 18.478 | -43.964 | -153.3 | -318.588 | -549.511 | -856.377 |
| 9.649999999999839 | 35.906 | 42.675 | 18.767 | -43.634 | -152.972 | -318.312 | -549.348 | -856.396 |
| 9.659999999999838 | 36.028 | 42.894 | 19.057 | -43.305 | -152.643 | -318.035 | -549.182 | -856.414 |
| 9.669999999999838 | 36.151 | 43.112 | 19.348 | -42.974 | -152.314 | -317.757 | -549.016 | -856.43 |
| 9.679999999999836 | 36.274 | 43.331 | 19.64 | -42.643 | -151.983 | -317.477 | -548.848 | -856.444 |
| 9.689999999999838 | 36.397 | 43.551 | 19.931 | -42.31 | -151.651 | -317.196 | -548.678 | -856.456 |
| 9.699999999999838 | 36.52 | 43.771 | 20.224 | -41.977 | -151.319 | -316.914 | -548.507 | -856.467 |
| 9.709999999999837 | 36.643 | 43.991 | 20.517 | -41.644 | -150.985 | -316.631 | -548.334 | -856.476 |
| 9.719999999999837 | 36.767 | 44.211 | 20.81 | -41.309 | -150.651 | -316.346 | -548.16 | -856.483 |
| 9.729999999999837 | 36.89 | 44.432 | 21.104 | -40.974 | -150.315 | -316.061 | -547.984 | -856.488 |
| 9.739999999999837 | 37.014 | 44.653 | 21.399 | -40.638 | -149.978 | -315.774 | -547.807 | -856.492 |
| 9.749999999999837 | 37.138 | 44.875 | 21.694 | -40.301 | -149.641 | -315.485 | -547.628 | -856.493 |
| 9.759999999999836 | 37.262 | 45.097 | 21.99 | -39.964 | -149.302 | -315.196 | -547.448 | -856.493 |
| 9.769999999999836 | 37.387 | 45.319 | 22.286 | -39.625 | -148.962 | -314.905 | -547.266 | -856.491 |
| 9.779999999999834 | 37.511 | 45.542 | 22.583 | -39.286 | -148.622 | -314.613 | -547.082 | -856.487 |
| 9.789999999999836 | 37.636 | 45.765 | 22.88 | -38.946 | -148.28 | -314.32 | -546.898 | -856.482 |
| 9.799999999999836 | 37.761 | 45.988 | 23.178 | -38.606 | -147.938 | -314.025 | -546.711 | -856.475 |
| 9.809999999999835 | 37.886 | 46.212 | 23.477 | -38.264 | -147.594 | -313.729 | -546.523 | -856.465 |
| 9.819999999999835 | 38.011 | 46.436 | 23.776 | -37.922 | -147.249 | -313.432 | -546.334 | -856.455 |
| 9.829999999999835 | 38.136 | 46.66 | 24.075 | -37.579 | -146.904 | -313.134 | -546.143 | -856.442 |
| 9.839999999999835 | 38.262 | 46.885 | 24.376 | -37.236 | -146.557 | -312.834 | -545.951 | -856.427 |
| 9.849999999999834 | 38.388 | 47.11 | 24.676 | -36.891 | -146.209 | -312.534 | -545.757 | -856.411 |
| 9.859999999999834 | 38.513 | 47.335 | 24.978 | -36.546 | -145.861 | -312.231 | -545.561 | -856.393 |
| 9.869999999999832 | 38.639 | 47.561 | 25.279 | -36.2 | -145.511 | -311.928 | -545.365 | -856.373 |
| 9.879999999999834 | 38.766 | 47.787 | 25.582 | -35.853 | -145.161 | -311.624 | -545.166 | -856.352 |
| 9.889999999999834 | 38.892 | 48.013 | 25.885 | -35.506 | -144.809 | -311.318 | -544.966 | -856.328 |
| 9.899999999999833 | 39.018 | 48.24 | 26.188 | -35.157 | -144.456 | -311.011 | -544.765 | -856.303 |
| 9.909999999999833 | 39.145 | 48.468 | 26.492 | -34.808 | -144.103 | -310.703 | -544.562 | -856.276 |
| 9.919999999999831 | 39.272 | 48.695 | 26.797 | -34.458 | -143.748 | -310.393 | -544.357 | -856.247 |
| 9.929999999999833 | 39.399 | 48.923 | 27.102 | -34.108 | -143.392 | -310.082 | -544.151 | -856.216 |
| 9.939999999999833 | 39.526 | 49.151 | 27.407 | -33.756 | -143.036 | -309.77 | -543.944 | -856.184 |
| 9.949999999999832 | 39.654 | 49.38 | 27.714 | -33.404 | -142.678 | -309.457 | -543.735 | -856.15 |
| 9.95999999999983 | 39.781 | 49.609 | 28.02 | -33.051 | -142.32 | -309.143 | -543.524 | -856.114 |
| 9.96999999999983 | 39.909 | 49.838 | 28.328 | -32.698 | -141.96 | -308.827 | -543.312 | -856.076 |
| 9.97999999999983 | 40.037 | 50.068 | 28.636 | -32.343 | -141.599 | -308.51 | -543.099 | -856.037 |
| 9.98999999999983 | 40.165 | 50.298 | 28.944 | -31.988 | -141.238 | -308.192 | -542.884 | -855.995 |
| 9.99999999999983 | 40.293 | 50.528 | 29.253 | -31.632 | -140.875 | -307.872 | -542.667 | -855.952 |
| 10.00999999999983 | 40.421 | 50.759 | 29.563 | -31.275 | -140.511 | -307.551 | -542.449 | -855.907 |
| 10.01999999999983 | 40.55 | 50.99 | 29.873 | -30.918 | -140.147 | -307.229 | -542.229 | -855.86 |
| 10.02999999999983 | 40.679 | 51.221 | 30.183 | -30.559 | -139.781 | -306.906 | -542.008 | -855.812 |
| 10.03999999999983 | 40.808 | 51.453 | 30.494 | -30.2 | -139.415 | -306.582 | -541.786 | -855.761 |
| 10.04999999999983 | 40.937 | 51.685 | 30.806 | -29.841 | -139.047 | -306.256 | -541.561 | -855.709 |
| 10.05999999999983 | 41.066 | 51.918 | 31.118 | -29.48 | -138.678 | -305.929 | -541.336 | -855.655 |
| 10.06999999999983 | 41.195 | 52.15 | 31.431 | -29.119 | -138.309 | -305.601 | -541.109 | -855.6 |
| 10.07999999999983 | 41.325 | 52.383 | 31.745 | -28.756 | -137.938 | -305.271 | -540.88 | -855.542 |
| 10.08999999999983 | 41.454 | 52.617 | 32.059 | -28.394 | -137.566 | -304.94 | -540.65 | -855.483 |
| 10.09999999999983 | 41.584 | 52.851 | 32.373 | -28.03 | -137.194 | -304.608 | -540.418 | -855.422 |
| 10.10999999999983 | 41.714 | 53.085 | 32.688 | -27.665 | -136.82 | -304.275 | -540.185 | -855.359 |
| 10.11999999999983 | 41.845 | 53.32 | 33.004 | -27.3 | -136.446 | -303.941 | -539.95 | -855.294 |
| 10.12999999999983 | 41.975 | 53.555 | 33.32 | -26.934 | -136.07 | -303.605 | -539.714 | -855.228 |
| 10.13999999999983 | 42.106 | 53.79 | 33.637 | -26.568 | -135.693 | -303.268 | -539.476 | -855.16 |
| 10.14999999999983 | 42.236 | 54.026 | 33.954 | -26.2 | -135.316 | -302.93 | -539.237 | -855.09 |
| 10.15999999999983 | 42.367 | 54.262 | 34.272 | -25.832 | -134.937 | -302.59 | -538.996 | -855.018 |
| 10.16999999999983 | 42.498 | 54.498 | 34.59 | -25.463 | -134.557 | -302.249 | -538.754 | -854.944 |
| 10.17999999999983 | 42.629 | 54.735 | 34.909 | -25.093 | -134.177 | -301.908 | -538.51 | -854.869 |
| 10.18999999999983 | 42.761 | 54.972 | 35.228 | -24.722 | -133.795 | -301.564 | -538.265 | -854.792 |
| 10.19999999999983 | 42.892 | 55.209 | 35.548 | -24.351 | -133.413 | -301.22 | -538.018 | -854.713 |
| 10.20999999999983 | 43.024 | 55.447 | 35.869 | -23.979 | -133.029 | -300.874 | -537.77 | -854.632 |
| 10.21999999999983 | 43.156 | 55.685 | 36.19 | -23.606 | -132.644 | -300.527 | -537.52 | -854.549 |
| 10.22999999999983 | 43.288 | 55.923 | 36.512 | -23.232 | -132.259 | -300.179 | -537.268 | -854.465 |
| 10.23999999999983 | 43.42 | 56.162 | 36.834 | -22.858 | -131.872 | -299.83 | -537.016 | -854.379 |
| 10.24999999999983 | 43.553 | 56.401 | 37.157 | -22.483 | -131.484 | -299.479 | -536.761 | -854.291 |
| 10.25999999999983 | 43.685 | 56.641 | 37.48 | -22.107 | -131.096 | -299.127 | -536.505 | -854.201 |
| 10.26999999999983 | 43.818 | 56.881 | 37.804 | -21.73 | -130.706 | -298.774 | -536.248 | -854.11 |
| 10.27999999999983 | 43.951 | 57.121 | 38.128 | -21.353 | -130.316 | -298.419 | -535.989 | -854.016 |
| 10.28999999999983 | 44.084 | 57.361 | 38.453 | -20.974 | -129.924 | -298.064 | -535.729 | -853.921 |
| 10.29999999999982 | 44.217 | 57.602 | 38.779 | -20.595 | -129.531 | -297.707 | -535.467 | -853.824 |
| 10.30999999999982 | 44.351 | 57.844 | 39.105 | -20.216 | -129.138 | -297.348 | -535.203 | -853.725 |
| 10.31999999999982 | 44.484 | 58.085 | 39.432 | -19.835 | -128.743 | -296.989 | -534.938 | -853.625 |
| 10.32999999999982 | 44.618 | 58.327 | 39.759 | -19.454 | -128.347 | -296.628 | -534.672 | -853.523 |
| 10.33999999999982 | 44.752 | 58.569 | 40.087 | -19.072 | -127.951 | -296.266 | -534.404 | -853.419 |
| 10.34999999999982 | 44.886 | 58.812 | 40.415 | -18.689 | -127.553 | -295.903 | -534.134 | -853.313 |
| 10.35999999999982 | 45.02 | 59.055 | 40.744 | -18.305 | -127.155 | -295.539 | -533.863 | -853.205 |
| 10.36999999999982 | 45.155 | 59.298 | 41.073 | -17.921 | -126.755 | -295.173 | -533.591 | -853.096 |
| 10.37999999999982 | 45.289 | 59.542 | 41.403 | -17.536 | -126.354 | -294.806 | -533.317 | -852.984 |
| 10.38999999999982 | 45.424 | 59.786 | 41.734 | -17.15 | -125.953 | -294.438 | -533.041 | -852.871 |
| 10.39999999999982 | 45.559 | 60.031 | 42.065 | -16.763 | -125.55 | -294.068 | -532.764 | -852.756 |
| 10.40999999999982 | 45.694 | 60.276 | 42.396 | -16.375 | -125.146 | -293.698 | -532.486 | -852.64 |
| 10.41999999999982 | 45.829 | 60.521 | 42.728 | -15.987 | -124.742 | -293.326 | -532.205 | -852.521 |
| 10.42999999999982 | 45.965 | 60.766 | 43.061 | -15.598 | -124.336 | -292.953 | -531.924 | -852.401 |
| 10.43999999999982 | 46.101 | 61.012 | 43.394 | -15.208 | -123.93 | -292.578 | -531.641 | -852.279 |
| 10.44999999999982 | 46.236 | 61.258 | 43.728 | -14.818 | -123.522 | -292.203 | -531.356 | -852.155 |
| 10.45999999999982 | 46.372 | 61.505 | 44.063 | -14.427 | -123.113 | -291.826 | -531.07 | -852.03 |
| 10.46999999999982 | 46.508 | 61.752 | 44.398 | -14.034 | -122.704 | -291.448 | -530.782 | -851.902 |
| 10.47999999999982 | 46.645 | 61.999 | 44.733 | -13.642 | -122.293 | -291.068 | -530.493 | -851.773 |
| 10.48999999999982 | 46.781 | 62.246 | 45.069 | -13.248 | -121.881 | -290.688 | -530.203 | -851.642 |
| 10.49999999999982 | 46.918 | 62.494 | 45.406 | -12.854 | -121.469 | -290.306 | -529.91 | -851.51 |
| 10.50999999999982 | 47.054 | 62.743 | 45.743 | -12.458 | -121.055 | -289.922 | -529.617 | -851.375 |
| 10.51999999999982 | 47.191 | 62.991 | 46.08 | -12.063 | -120.641 | -289.538 | -529.321 | -851.239 |
| 10.52999999999982 | 47.328 | 63.24 | 46.419 | -11.666 | -120.225 | -289.152 | -529.025 | -851.101 |
| 10.53999999999982 | 47.466 | 63.49 | 46.757 | -11.268 | -119.808 | -288.766 | -528.727 | -850.961 |
| 10.54999999999982 | 47.603 | 63.739 | 47.097 | -10.87 | -119.391 | -288.377 | -528.427 | -850.819 |
| 10.55999999999982 | 47.741 | 63.99 | 47.437 | -10.471 | -118.972 | -287.988 | -528.126 | -850.675 |
| 10.56999999999982 | 47.879 | 64.24 | 47.777 | -10.071 | -118.552 | -287.597 | -527.823 | -850.53 |
| 10.57999999999982 | 48.017 | 64.491 | 48.118 | -9.671 | -118.132 | -287.205 | -527.519 | -850.383 |
| 10.58999999999982 | 48.155 | 64.742 | 48.46 | -9.27 | -117.71 | -286.812 | -527.213 | -850.234 |
| 10.59999999999982 | 48.293 | 64.993 | 48.802 | -8.868 | -117.288 | -286.418 | -526.905 | -850.084 |
| 10.60999999999982 | 48.431 | 65.245 | 49.144 | -8.465 | -116.864 | -286.022 | -526.597 | -849.931 |
| 10.61999999999982 | 48.57 | 65.497 | 49.488 | -8.061 | -116.439 | -285.625 | -526.286 | -849.777 |
| 10.62999999999982 | 48.709 | 65.75 | 49.831 | -7.657 | -116.014 | -285.227 | -525.974 | -849.621 |
| 10.63999999999982 | 48.848 | 66.003 | 50.176 | -7.252 | -115.587 | -284.828 | -525.661 | -849.463 |
| 10.64999999999982 | 48.987 | 66.256 | 50.521 | -6.846 | -115.159 | -284.427 | -525.346 | -849.303 |
| 10.65999999999982 | 49.126 | 66.51 | 50.866 | -6.439 | -114.731 | -284.025 | -525.03 | -849.142 |
| 10.66999999999982 | 49.266 | 66.763 | 51.212 | -6.032 | -114.301 | -283.622 | -524.712 | -848.979 |
| 10.67999999999982 | 49.405 | 67.018 | 51.558 | -5.623 | -113.871 | -283.218 | -524.393 | -848.814 |
| 10.68999999999982 | 49.545 | 67.272 | 51.905 | -5.214 | -113.439 | -282.812 | -524.072 | -848.647 |
| 10.69999999999982 | 49.685 | 67.527 | 52.253 | -4.805 | -113.006 | -282.405 | -523.749 | -848.478 |
| 10.70999999999982 | 49.825 | 67.783 | 52.601 | -4.394 | -112.573 | -281.997 | -523.425 | -848.308 |
| 10.71999999999982 | 49.966 | 68.038 | 52.95 | -3.983 | -112.138 | -281.588 | -523.1 | -848.136 |
| 10.72999999999982 | 50.106 | 68.294 | 53.299 | -3.571 | -111.702 | -281.177 | -522.773 | -847.962 |
| 10.73999999999982 | 50.247 | 68.551 | 53.649 | -3.158 | -111.266 | -280.766 | -522.445 | -847.786 |
| 10.74999999999982 | 50.387 | 68.808 | 53.999 | -2.744 | -110.828 | -280.352 | -522.115 | -847.608 |
| 10.75999999999981 | 50.528 | 69.065 | 54.35 | -2.33 | -110.39 | -279.938 | -521.783 | -847.429 |
| 10.76999999999981 | 50.67 | 69.322 | 54.702 | -1.915 | -109.95 | -279.522 | -521.45 | -847.248 |
| 10.77999999999981 | 50.811 | 69.58 | 55.054 | -1.499 | -109.509 | -279.106 | -521.116 | -847.065 |
| 10.78999999999981 | 50.952 | 69.838 | 55.407 | -1.082 | -109.068 | -278.688 | -520.779 | -846.88 |
| 10.79999999999981 | 51.094 | 70.097 | 55.76 | -0.665 | -108.625 | -278.268 | -520.442 | -846.694 |
| 10.80999999999981 | 51.236 | 70.356 | 56.113 | -0.247 | -108.181 | -277.848 | -520.103 | -846.505 |
| 10.81999999999981 | 51.378 | 70.615 | 56.468 | 0.172 | -107.737 | -277.426 | -519.762 | -846.315 |
| 10.82999999999981 | 51.52 | 70.874 | 56.822 | 0.592 | -107.291 | -277.003 | -519.42 | -846.123 |
| 10.83999999999981 | 51.662 | 71.134 | 57.178 | 1.012 | -106.845 | -276.578 | -519.077 | -845.93 |
| 10.84999999999981 | 51.805 | 71.394 | 57.534 | 1.434 | -106.397 | -276.153 | -518.732 | -845.734 |
| 10.85999999999981 | 51.947 | 71.655 | 57.89 | 1.856 | -105.948 | -275.726 | -518.385 | -845.537 |
| 10.86999999999981 | 52.09 | 71.916 | 58.247 | 2.279 | -105.499 | -275.298 | -518.037 | -845.338 |
| 10.87999999999981 | 52.233 | 72.177 | 58.605 | 2.702 | -105.048 | -274.868 | -517.687 | -845.137 |
| 10.88999999999981 | 52.376 | 72.439 | 58.963 | 3.126 | -104.596 | -274.438 | -517.336 | -844.935 |
| 10.89999999999981 | 52.52 | 72.701 | 59.321 | 3.552 | -104.144 | -274.006 | -516.983 | -844.73 |
| 10.90999999999981 | 52.663 | 72.964 | 59.681 | 3.977 | -103.69 | -273.573 | -516.629 | -844.524 |
| 10.91999999999981 | 52.807 | 73.226 | 60.04 | 4.404 | -103.236 | -273.139 | -516.274 | -844.316 |
| 10.92999999999981 | 52.951 | 73.489 | 60.401 | 4.831 | -102.78 | -272.703 | -515.916 | -844.106 |
| 10.93999999999981 | 53.095 | 73.753 | 60.762 | 5.26 | -102.323 | -272.266 | -515.558 | -843.894 |
| 10.94999999999981 | 53.239 | 74.017 | 61.123 | 5.689 | -101.866 | -271.828 | -515.197 | -843.681 |
| 10.95999999999981 | 53.383 | 74.281 | 61.485 | 6.118 | -101.407 | -271.389 | -514.836 | -843.466 |
| 10.96999999999981 | 53.528 | 74.545 | 61.847 | 6.549 | -100.947 | -270.948 | -514.472 | -843.249 |
| 10.97999999999981 | 53.672 | 74.81 | 62.21 | 6.98 | -100.487 | -270.507 | -514.108 | -843.03 |
| 10.98999999999981 | 53.817 | 75.075 | 62.574 | 7.412 | -100.025 | -270.064 | -513.741 | -842.81 |
| 10.99999999999981 | 53.962 | 75.341 | 62.938 | 7.845 | -99.563 | -269.619 | -513.374 | -842.587 |
| 11.00999999999981 | 54.107 | 75.607 | 63.303 | 8.278 | -99.099 | -269.174 | -513.004 | -842.363 |
| 11.01999999999981 | 54.253 | 75.873 | 63.668 | 8.713 | -98.634 | -268.727 | -512.634 | -842.137 |
| 11.02999999999981 | 54.398 | 76.14 | 64.034 | 9.148 | -98.169 | -268.279 | -512.261 | -841.909 |
| 11.03999999999981 | 54.544 | 76.407 | 64.401 | 9.584 | -97.702 | -267.83 | -511.887 | -841.68 |
| 11.04999999999981 | 54.69 | 76.674 | 64.767 | 10.02 | -97.234 | -267.379 | -511.512 | -841.449 |
| 11.05999999999981 | 54.836 | 76.942 | 65.135 | 10.458 | -96.766 | -266.927 | -511.135 | -841.215 |
| 11.06999999999981 | 54.982 | 77.21 | 65.503 | 10.896 | -96.296 | -266.474 | -510.757 | -840.981 |
| 11.07999999999981 | 55.128 | 77.478 | 65.872 | 11.335 | -95.826 | -266.02 | -510.377 | -840.744 |
| 11.08999999999981 | 55.275 | 77.747 | 66.241 | 11.774 | -95.354 | -265.564 | -509.996 | -840.505 |
| 11.09999999999981 | 55.422 | 78.016 | 66.61 | 12.215 | -94.881 | -265.108 | -509.613 | -840.265 |
| 11.10999999999981 | 55.568 | 78.285 | 66.981 | 12.656 | -94.408 | -264.649 | -509.228 | -840.023 |
| 11.11999999999981 | 55.716 | 78.555 | 67.351 | 13.098 | -93.933 | -264.19 | -508.842 | -839.779 |
| 11.12999999999981 | 55.863 | 78.825 | 67.723 | 13.541 | -93.457 | -263.73 | -508.455 | -839.534 |
| 11.13999999999981 | 56.01 | 79.095 | 68.095 | 13.984 | -92.981 | -263.268 | -508.066 | -839.286 |
| 11.14999999999981 | 56.158 | 79.366 | 68.467 | 14.429 | -92.503 | -262.805 | -507.676 | -839.037 |
| 11.15999999999981 | 56.305 | 79.638 | 68.84 | 14.874 | -92.025 | -262.341 | -507.284 | -838.786 |
| 11.16999999999981 | 56.453 | 79.909 | 69.214 | 15.32 | -91.545 | -261.875 | -506.89 | -838.533 |
| 11.17999999999981 | 56.601 | 80.181 | 69.588 | 15.766 | -91.064 | -261.408 | -506.495 | -838.278 |
| 11.18999999999981 | 56.749 | 80.453 | 69.963 | 16.214 | -90.583 | -260.94 | -506.099 | -838.022 |
| 11.19999999999981 | 56.898 | 80.726 | 70.338 | 16.662 | -90.1 | -260.471 | -505.701 | -837.764 |
| 11.20999999999981 | 57.046 | 80.999 | 70.714 | 17.111 | -89.616 | -260.001 | -505.301 | -837.504 |
| 11.21999999999981 | 57.195 | 81.272 | 71.09 | 17.56 | -89.132 | -259.529 | -504.9 | -837.242 |
| 11.22999999999981 | 57.344 | 81.546 | 71.467 | 18.011 | -88.646 | -259.056 | -504.498 | -836.979 |
| 11.2399999999998 | 57.493 | 81.82 | 71.844 | 18.462 | -88.16 | -258.582 | -504.093 | -836.713 |
| 11.2499999999998 | 57.642 | 82.094 | 72.222 | 18.914 | -87.672 | -258.106 | -503.688 | -836.446 |
| 11.2599999999998 | 57.792 | 82.369 | 72.601 | 19.367 | -87.183 | -257.629 | -503.281 | -836.177 |
| 11.2699999999998 | 57.941 | 82.644 | 72.98 | 19.82 | -86.694 | -257.151 | -502.872 | -835.906 |
| 11.2799999999998 | 58.091 | 82.919 | 73.359 | 20.275 | -86.203 | -256.672 | -502.462 | -835.634 |
| 11.2899999999998 | 58.241 | 83.195 | 73.74 | 20.73 | -85.711 | -256.192 | -502.05 | -835.359 |
| 11.2999999999998 | 58.391 | 83.471 | 74.12 | 21.185 | -85.219 | -255.71 | -501.637 | -835.083 |
| 11.3099999999998 | 58.541 | 83.748 | 74.502 | 21.642 | -84.725 | -255.227 | -501.223 | -834.805 |
| 11.3199999999998 | 58.691 | 84.024 | 74.883 | 22.099 | -84.231 | -254.743 | -500.807 | -834.526 |
| 11.3299999999998 | 58.842 | 84.301 | 75.266 | 22.558 | -83.735 | -254.257 | -500.389 | -834.244 |
| 11.3399999999998 | 58.993 | 84.579 | 75.649 | 23.016 | -83.238 | -253.77 | -499.97 | -833.961 |
| 11.3499999999998 | 59.143 | 84.857 | 76.032 | 23.476 | -82.741 | -253.282 | -499.549 | -833.676 |
| 11.3599999999998 | 59.295 | 85.135 | 76.416 | 23.937 | -82.242 | -252.793 | -499.127 | -833.389 |
| 11.3699999999998 | 59.446 | 85.414 | 76.801 | 24.398 | -81.742 | -252.303 | -498.703 | -833.1 |
| 11.3799999999998 | 59.597 | 85.693 | 77.186 | 24.86 | -81.242 | -251.811 | -498.278 | -832.81 |
| 11.3899999999998 | 59.749 | 85.972 | 77.572 | 25.322 | -80.74 | -251.318 | -497.851 | -832.518 |
| 11.3999999999998 | 59.9 | 86.252 | 77.958 | 25.786 | -80.238 | -250.824 | -497.423 | -832.224 |
| 11.4099999999998 | 60.052 | 86.532 | 78.345 | 26.25 | -79.734 | -250.328 | -496.993 | -831.928 |
| 11.4199999999998 | 60.204 | 86.812 | 78.732 | 26.715 | -79.229 | -249.831 | -496.562 | -831.63 |
| 11.4299999999998 | 60.357 | 87.093 | 79.12 | 27.181 | -78.724 | -249.334 | -496.129 | -831.331 |
| 11.4399999999998 | 60.509 | 87.374 | 79.509 | 27.648 | -78.217 | -248.834 | -495.695 | -831.03 |
| 11.4499999999998 | 60.662 | 87.655 | 79.898 | 28.115 | -77.709 | -248.334 | -495.259 | -830.727 |
| 11.4599999999998 | 60.814 | 87.937 | 80.287 | 28.583 | -77.201 | -247.832 | -494.821 | -830.422 |
| 11.4699999999998 | 60.967 | 88.219 | 80.677 | 29.052 | -76.691 | -247.329 | -494.383 | -830.115 |
| 11.4799999999998 | 61.12 | 88.501 | 81.068 | 29.522 | -76.181 | -246.825 | -493.942 | -829.807 |
| 11.4899999999998 | 61.274 | 88.784 | 81.459 | 29.992 | -75.669 | -246.32 | -493.5 | -829.497 |
| 11.4999999999998 | 61.427 | 89.067 | 81.851 | 30.463 | -75.156 | -245.813 | -493.057 | -829.185 |
| 11.5099999999998 | 61.581 | 89.351 | 82.243 | 30.935 | -74.643 | -245.305 | -492.612 | -828.871 |
| 11.5199999999998 | 61.734 | 89.635 | 82.636 | 31.408 | -74.128 | -244.796 | -492.166 | -828.556 |
| 11.5299999999998 | 61.888 | 89.919 | 83.03 | 31.881 | -73.612 | -244.285 | -491.718 | -828.238 |
| 11.5399999999998 | 62.042 | 90.203 | 83.424 | 32.356 | -73.096 | -243.774 | -491.268 | -827.919 |
| 11.5499999999998 | 62.197 | 90.488 | 83.818 | 32.831 | -72.578 | -243.261 | -490.817 | -827.598 |
| 11.5599999999998 | 62.351 | 90.774 | 84.213 | 33.306 | -72.06 | -242.746 | -490.365 | -827.275 |
| 11.5699999999998 | 62.506 | 91.059 | 84.609 | 33.783 | -71.54 | -242.231 | -489.911 | -826.951 |
| 11.5799999999998 | 62.66 | 91.345 | 85.005 | 34.26 | -71.019 | -241.714 | -489.456 | -826.625 |
| 11.5899999999998 | 62.815 | 91.631 | 85.402 | 34.738 | -70.498 | -241.196 | -488.999 | -826.297 |
| 11.5999999999998 | 62.97 | 91.918 | 85.799 | 35.217 | -69.975 | -240.677 | -488.54 | -825.967 |
| 11.6099999999998 | 63.126 | 92.205 | 86.197 | 35.697 | -69.451 | -240.157 | -488.08 | -825.635 |
| 11.6199999999998 | 63.281 | 92.492 | 86.595 | 36.177 | -68.927 | -239.635 | -487.619 | -825.302 |
| 11.6299999999998 | 63.437 | 92.78 | 86.994 | 36.658 | -68.401 | -239.112 | -487.156 | -824.966 |
| 11.6399999999998 | 63.592 | 93.068 | 87.394 | 37.14 | -67.875 | -238.588 | -486.691 | -824.629 |
| 11.6499999999998 | 63.748 | 93.357 | 87.794 | 37.623 | -67.347 | -238.062 | -486.225 | -824.29 |
| 11.6599999999998 | 63.904 | 93.646 | 88.194 | 38.107 | -66.818 | -237.536 | -485.757 | -823.95 |
| 11.6699999999998 | 64.061 | 93.935 | 88.596 | 38.591 | -66.289 | -237.008 | -485.288 | -823.607 |
| 11.6799999999998 | 64.217 | 94.224 | 88.997 | 39.076 | -65.758 | -236.479 | -484.818 | -823.263 |
| 11.6899999999998 | 64.374 | 94.514 | 89.4 | 39.562 | -65.226 | -235.948 | -484.346 | -822.917 |
| 11.69999999999979 | 64.53 | 94.804 | 89.802 | 40.048 | -64.694 | -235.417 | -483.872 | -822.569 |
| 11.70999999999979 | 64.687 | 95.095 | 90.206 | 40.535 | -64.16 | -234.884 | -483.397 | -822.22 |
| 11.71999999999979 | 64.844 | 95.386 | 90.61 | 41.024 | -63.626 | -234.35 | -482.92 | -821.868 |
| 11.72999999999979 | 65.002 | 95.677 | 91.014 | 41.512 | -63.09 | -233.814 | -482.442 | -821.515 |
| 11.73999999999979 | 65.159 | 95.968 | 91.419 | 42.002 | -62.553 | -233.278 | -481.962 | -821.16 |
| 11.74999999999979 | 65.317 | 96.26 | 91.825 | 42.492 | -62.016 | -232.74 | -481.481 | -820.804 |
| 11.75999999999979 | 65.475 | 96.553 | 92.231 | 42.984 | -61.477 | -232.2 | -480.999 | -820.445 |
| 11.76999999999979 | 65.632 | 96.845 | 92.638 | 43.475 | -60.937 | -231.66 | -480.514 | -820.085 |
| 11.77999999999979 | 65.791 | 97.138 | 93.045 | 43.968 | -60.397 | -231.118 | -480.029 | -819.723 |
| 11.78999999999979 | 65.949 | 97.432 | 93.453 | 44.462 | -59.855 | -230.576 | -479.541 | -819.359 |
| 11.79999999999979 | 66.107 | 97.725 | 93.861 | 44.956 | -59.313 | -230.031 | -479.053 | -818.993 |
| 11.8099999999998 | 66.266 | 98.02 | 94.27 | 45.451 | -58.769 | -229.486 | -478.562 | -818.625 |
| 11.8199999999998 | 66.425 | 98.314 | 94.679 | 45.947 | -58.224 | -228.939 | -478.071 | -818.256 |
| 11.8299999999998 | 66.584 | 98.609 | 95.089 | 46.443 | -57.679 | -228.391 | -477.577 | -817.885 |
| 11.8399999999998 | 66.743 | 98.904 | 95.5 | 46.94 | -57.132 | -227.842 | -477.083 | -817.512 |
| 11.8499999999998 | 66.902 | 99.199 | 95.911 | 47.438 | -56.584 | -227.292 | -476.586 | -817.138 |
| 11.8599999999998 | 67.062 | 99.495 | 96.323 | 47.937 | -56.036 | -226.74 | -476.088 | -816.761 |
| 11.8699999999998 | 67.221 | 99.791 | 96.735 | 48.437 | -55.486 | -226.187 | -475.589 | -816.383 |
| 11.8799999999998 | 67.381 | 100.088 | 97.148 | 48.937 | -54.936 | -225.633 | -475.088 | -816.003 |
| 11.8899999999998 | 67.541 | 100.385 | 97.561 | 49.438 | -54.384 | -225.078 | -474.586 | -815.621 |
| 11.8999999999998 | 67.701 | 100.682 | 97.975 | 49.94 | -53.831 | -224.521 | -474.082 | -815.237 |
| 11.9099999999998 | 67.861 | 100.98 | 98.389 | 50.443 | -53.278 | -223.963 | -473.577 | -814.852 |
| 11.9199999999998 | 68.022 | 101.277 | 98.804 | 50.946 | -52.723 | -223.404 | -473.07 | -814.465 |
| 11.9299999999998 | 68.182 | 101.576 | 99.22 | 51.451 | -52.167 | -222.844 | -472.561 | -814.076 |
| 11.93999999999979 | 68.343 | 101.874 | 99.636 | 51.956 | -51.611 | -222.282 | -472.052 | -813.685 |
| 11.94999999999979 | 68.504 | 102.173 | 100.052 | 52.461 | -51.053 | -221.719 | -471.54 | -813.292 |
| 11.95999999999979 | 68.665 | 102.473 | 100.469 | 52.968 | -50.495 | -221.155 | -471.027 | -812.898 |
| 11.96999999999979 | 68.827 | 102.772 | 100.887 | 53.475 | -49.935 | -220.59 | -470.513 | -812.502 |
| 11.97999999999979 | 68.988 | 103.072 | 101.305 | 53.983 | -49.374 | -220.023 | -469.997 | -812.104 |
| 11.98999999999979 | 69.15 | 103.373 | 101.724 | 54.492 | -48.813 | -219.456 | -469.479 | -811.704 |
| 11.99999999999979 | 69.312 | 103.674 | 102.144 | 55.002 | -48.25 | -218.886 | -468.96 | -811.302 |
| 12.00999999999979 | 69.474 | 103.975 | 102.564 | 55.512 | -47.686 | -218.316 | -468.44 | -810.899 |
| 12.01999999999979 | 69.636 | 104.276 | 102.984 | 56.023 | -47.122 | -217.744 | -467.918 | -810.494 |
| 12.02999999999979 | 69.798 | 104.578 | 103.405 | 56.535 | -46.556 | -217.172 | -467.394 | -810.087 |
| 12.03999999999979 | 69.961 | 104.88 | 103.827 | 57.048 | -45.99 | -216.598 | -466.869 | -809.678 |
| 12.04999999999979 | 70.123 | 105.183 | 104.249 | 57.561 | -45.422 | -216.022 | -466.343 | -809.268 |
| 12.05999999999979 | 70.286 | 105.486 | 104.671 | 58.075 | -44.853 | -215.446 | -465.815 | -808.855 |
| 12.06999999999979 | 70.449 | 105.789 | 105.095 | 58.59 | -44.284 | -214.868 | -465.285 | -808.441 |
| 12.07999999999979 | 70.612 | 106.092 | 105.518 | 59.106 | -43.713 | -214.289 | -464.754 | -808.025 |
| 12.08999999999979 | 70.775 | 106.396 | 105.943 | 59.622 | -43.141 | -213.708 | -464.222 | -807.608 |
| 12.09999999999979 | 70.939 | 106.7 | 106.368 | 60.14 | -42.569 | -213.127 | -463.687 | -807.188 |
| 12.10999999999979 | 71.103 | 107.005 | 106.793 | 60.658 | -41.995 | -212.544 | -463.152 | -806.767 |
| 12.11999999999979 | 71.266 | 107.31 | 107.219 | 61.177 | -41.421 | -211.96 | -462.615 | -806.344 |
| 12.12999999999979 | 71.43 | 107.615 | 107.646 | 61.696 | -40.845 | -211.374 | -462.076 | -805.919 |
| 12.13999999999979 | 71.595 | 107.921 | 108.073 | 62.216 | -40.268 | -210.788 | -461.536 | -805.493 |
| 12.14999999999979 | 71.759 | 108.227 | 108.5 | 62.738 | -39.691 | -210.2 | -460.994 | -805.064 |
| 12.15999999999979 | 71.923 | 108.534 | 108.929 | 63.259 | -39.112 | -209.611 | -460.451 | -804.634 |
| 12.16999999999978 | 72.088 | 108.84 | 109.357 | 63.782 | -38.532 | -209.021 | -459.906 | -804.202 |
| 12.17999999999978 | 72.253 | 109.147 | 109.787 | 64.305 | -37.952 | -208.429 | -459.36 | -803.768 |
| 12.18999999999978 | 72.418 | 109.455 | 110.217 | 64.83 | -37.37 | -207.836 | -458.813 | -803.332 |
| 12.19999999999978 | 72.583 | 109.763 | 110.647 | 65.355 | -36.788 | -207.242 | -458.263 | -802.895 |
| 12.20999999999978 | 72.748 | 110.071 | 111.078 | 65.88 | -36.204 | -206.647 | -457.713 | -802.456 |
| 12.21999999999978 | 72.914 | 110.379 | 111.51 | 66.407 | -35.619 | -206.05 | -457.16 | -802.015 |
| 12.22999999999978 | 73.08 | 110.688 | 111.942 | 66.934 | -35.034 | -205.453 | -456.607 | -801.572 |
| 12.23999999999978 | 73.245 | 110.997 | 112.374 | 67.462 | -34.447 | -204.854 | -456.051 | -801.128 |
| 12.24999999999978 | 73.411 | 111.307 | 112.807 | 67.991 | -33.859 | -204.253 | -455.495 | -800.681 |
| 12.25999999999978 | 73.578 | 111.617 | 113.241 | 68.52 | -33.271 | -203.652 | -454.936 | -800.233 |
| 12.26999999999978 | 73.744 | 111.927 | 113.675 | 69.051 | -32.681 | -203.049 | -454.376 | -799.783 |
| 12.27999999999978 | 73.91 | 112.238 | 114.11 | 69.582 | -32.091 | -202.445 | -453.815 | -799.331 |
| 12.28999999999978 | 74.077 | 112.549 | 114.546 | 70.114 | -31.499 | -201.84 | -453.252 | -798.878 |
| 12.29999999999978 | 74.244 | 112.86 | 114.982 | 70.646 | -30.906 | -201.233 | -452.688 | -798.423 |
| 12.30999999999978 | 74.411 | 113.172 | 115.418 | 71.18 | -30.313 | -200.625 | -452.122 | -797.965 |
| 12.31999999999978 | 74.578 | 113.484 | 115.855 | 71.714 | -29.718 | -200.016 | -451.555 | -797.507 |
| 12.32999999999978 | 74.746 | 113.796 | 116.293 | 72.249 | -29.122 | -199.406 | -450.986 | -797.046 |
| 12.33999999999978 | 74.913 | 114.109 | 116.731 | 72.784 | -28.526 | -198.794 | -450.416 | -796.583 |
| 12.34999999999978 | 75.081 | 114.422 | 117.17 | 73.321 | -27.928 | -198.182 | -449.844 | -796.119 |
| 12.35999999999978 | 75.249 | 114.735 | 117.609 | 73.858 | -27.33 | -197.567 | -449.27 | -795.653 |
| 12.36999999999978 | 75.417 | 115.049 | 118.049 | 74.396 | -26.73 | -196.952 | -448.695 | -795.185 |
| 12.37999999999978 | 75.585 | 115.363 | 118.489 | 74.935 | -26.129 | -196.336 | -448.119 | -794.716 |
| 12.38999999999978 | 75.753 | 115.677 | 118.93 | 75.474 | -25.528 | -195.718 | -447.541 | -794.244 |
| 12.39999999999978 | 75.922 | 115.992 | 119.371 | 76.015 | -24.925 | -195.099 | -446.961 | -793.771 |
| 12.40999999999978 | 76.09 | 116.308 | 119.813 | 76.556 | -24.321 | -194.479 | -446.381 | -793.296 |
| 12.41999999999978 | 76.259 | 116.623 | 120.256 | 77.098 | -23.717 | -193.857 | -445.798 | -792.819 |
| 12.42999999999978 | 76.428 | 116.939 | 120.699 | 77.64 | -23.111 | -193.234 | -445.214 | -792.34 |
| 12.43999999999978 | 76.598 | 117.255 | 121.143 | 78.184 | -22.505 | -192.61 | -444.629 | -791.86 |
| 12.44999999999978 | 76.767 | 117.572 | 121.587 | 78.728 | -21.897 | -191.985 | -444.042 | -791.378 |
| 12.45999999999978 | 76.936 | 117.889 | 122.032 | 79.273 | -21.288 | -191.359 | -443.453 | -790.894 |
| 12.46999999999978 | 77.106 | 118.206 | 122.477 | 79.818 | -20.679 | -190.731 | -442.863 | -790.408 |
| 12.47999999999978 | 77.276 | 118.524 | 122.923 | 80.365 | -20.068 | -190.102 | -442.271 | -789.921 |
| 12.48999999999978 | 77.446 | 118.842 | 123.369 | 80.912 | -19.456 | -189.472 | -441.678 | -789.431 |
| 12.49999999999978 | 77.616 | 119.16 | 123.816 | 81.46 | -18.844 | -188.84 | -441.084 | -788.94 |
| 12.50999999999978 | 77.787 | 119.479 | 124.264 | 82.009 | -18.23 | -188.207 | -440.488 | -788.447 |
| 12.51999999999978 | 77.957 | 119.798 | 124.712 | 82.558 | -17.616 | -187.573 | -439.89 | -787.952 |
| 12.52999999999978 | 78.128 | 120.117 | 125.16 | 83.109 | -17 | -186.938 | -439.291 | -787.456 |
| 12.53999999999978 | 78.299 | 120.437 | 125.61 | 83.66 | -16.383 | -186.302 | -438.69 | -786.957 |
| 12.54999999999978 | 78.47 | 120.757 | 126.059 | 84.211 | -15.766 | -185.664 | -438.088 | -786.457 |
| 12.55999999999978 | 78.641 | 121.078 | 126.51 | 84.764 | -15.147 | -185.025 | -437.485 | -785.955 |
| 12.56999999999978 | 78.812 | 121.398 | 126.961 | 85.317 | -14.527 | -184.385 | -436.879 | -785.452 |
| 12.57999999999978 | 78.984 | 121.719 | 127.412 | 85.872 | -13.907 | -183.743 | -436.273 | -784.946 |
| 12.58999999999978 | 79.156 | 122.041 | 127.864 | 86.426 | -13.285 | -183.1 | -435.665 | -784.439 |
| 12.59999999999978 | 79.328 | 122.363 | 128.316 | 86.982 | -12.663 | -182.456 | -435.055 | -783.93 |
| 12.60999999999978 | 79.5 | 122.685 | 128.769 | 87.539 | -12.039 | -181.811 | -434.444 | -783.419 |
| 12.61999999999978 | 79.672 | 123.008 | 129.223 | 88.096 | -11.414 | -181.165 | -433.831 | -782.906 |
| 12.62999999999978 | 79.844 | 123.331 | 129.677 | 88.654 | -10.789 | -180.517 | -433.217 | -782.392 |
| 12.63999999999977 | 80.017 | 123.654 | 130.132 | 89.212 | -10.162 | -179.868 | -432.601 | -781.876 |
| 12.64999999999977 | 80.19 | 123.978 | 130.587 | 89.772 | -9.534 | -179.218 | -431.984 | -781.358 |
| 12.65999999999977 | 80.362 | 124.302 | 131.043 | 90.332 | -8.906 | -178.566 | -431.365 | -780.838 |
| 12.66999999999977 | 80.536 | 124.626 | 131.499 | 90.893 | -8.276 | -177.913 | -430.745 | -780.316 |
| 12.67999999999977 | 80.709 | 124.951 | 131.956 | 91.455 | -7.646 | -177.26 | -430.123 | -779.793 |
| 12.68999999999977 | 80.882 | 125.276 | 132.414 | 92.018 | -7.014 | -176.604 | -429.5 | -779.268 |
| 12.69999999999977 | 81.056 | 125.601 | 132.872 | 92.581 | -6.381 | -175.948 | -428.875 | -778.741 |
| 12.70999999999977 | 81.229 | 125.927 | 133.33 | 93.145 | -5.748 | -175.29 | -428.248 | -778.212 |
| 12.71999999999977 | 81.403 | 126.253 | 133.789 | 93.71 | -5.113 | -174.631 | -427.621 | -777.681 |
| 12.72999999999977 | 81.577 | 126.579 | 134.249 | 94.276 | -4.477 | -173.971 | -426.991 | -777.149 |
| 12.73999999999977 | 81.752 | 126.906 | 134.709 | 94.842 | -3.841 | -173.31 | -426.36 | -776.615 |
| 12.74999999999977 | 81.926 | 127.233 | 135.17 | 95.409 | -3.203 | -172.647 | -425.728 | -776.079 |
| 12.75999999999977 | 82.101 | 127.561 | 135.631 | 95.977 | -2.565 | -171.983 | -425.094 | -775.541 |
| 12.76999999999977 | 82.275 | 127.889 | 136.093 | 96.546 | -1.925 | -171.318 | -424.459 | -775.002 |
| 12.77999999999977 | 82.45 | 128.217 | 136.556 | 97.115 | -1.284 | -170.651 | -423.822 | -774.46 |
| 12.78999999999977 | 82.625 | 128.545 | 137.019 | 97.686 | -0.643 | -169.984 | -423.183 | -773.917 |
| 12.79999999999977 | 82.801 | 128.874 | 137.482 | 98.257 | 0 | -169.315 | -422.543 | -773.372 |
| 12.80999999999977 | 82.976 | 129.204 | 137.946 | 98.828 | 0.644 | -168.644 | -421.902 | -772.825 |
| 12.81999999999977 | 83.152 | 129.533 | 138.411 | 99.401 | 1.288 | -167.973 | -421.259 | -772.277 |
| 12.82999999999977 | 83.327 | 129.863 | 138.876 | 99.974 | 1.934 | -167.3 | -420.614 | -771.727 |
| 12.83999999999977 | 83.503 | 130.193 | 139.342 | 100.548 | 2.58 | -166.626 | -419.968 | -771.175 |
| 12.84999999999977 | 83.679 | 130.524 | 139.808 | 101.123 | 3.228 | -165.951 | -419.321 | -770.621 |
| 12.85999999999977 | 83.856 | 130.855 | 140.275 | 101.699 | 3.877 | -165.275 | -418.672 | -770.065 |
| 12.86999999999977 | 84.032 | 131.186 | 140.742 | 102.275 | 4.526 | -164.597 | -418.021 | -769.508 |
| 12.87999999999977 | 84.209 | 131.518 | 141.21 | 102.852 | 5.177 | -163.918 | -417.369 | -768.948 |
| 12.88999999999977 | 84.385 | 131.85 | 141.679 | 103.43 | 5.829 | -163.238 | -416.716 | -768.387 |
| 12.89999999999977 | 84.562 | 132.183 | 142.148 | 104.009 | 6.481 | -162.556 | -416.061 | -767.824 |
| 12.90999999999977 | 84.739 | 132.516 | 142.618 | 104.589 | 7.135 | -161.874 | -415.404 | -767.26 |
| 12.91999999999977 | 84.917 | 132.849 | 143.088 | 105.169 | 7.789 | -161.19 | -414.746 | -766.693 |
| 12.92999999999977 | 85.094 | 133.182 | 143.558 | 105.75 | 8.445 | -160.505 | -414.087 | -766.125 |
| 12.93999999999977 | 85.272 | 133.516 | 144.03 | 106.332 | 9.102 | -159.818 | -413.425 | -765.555 |
| 12.94999999999977 | 85.45 | 133.85 | 144.502 | 106.914 | 9.759 | -159.131 | -412.763 | -764.983 |
| 12.95999999999977 | 85.627 | 134.185 | 144.974 | 107.497 | 10.418 | -158.442 | -412.099 | -764.41 |
| 12.96999999999977 | 85.806 | 134.52 | 145.447 | 108.082 | 11.078 | -157.752 | -411.433 | -763.834 |
| 12.97999999999977 | 85.984 | 134.855 | 145.92 | 108.666 | 11.738 | -157.06 | -410.766 | -763.257 |
| 12.98999999999977 | 86.162 | 135.19 | 146.394 | 109.252 | 12.4 | -156.368 | -410.097 | -762.678 |
| 12.99999999999977 | 86.341 | 135.526 | 146.869 | 109.838 | 13.062 | -155.674 | -409.427 | -762.098 |
| 13.00999999999977 | 86.52 | 135.863 | 147.344 | 110.426 | 13.726 | -154.978 | -408.755 | -761.515 |
| 13.01999999999977 | 86.699 | 136.199 | 147.82 | 111.013 | 14.391 | -154.282 | -408.082 | -760.931 |
| 13.02999999999977 | 86.878 | 136.536 | 148.296 | 111.602 | 15.056 | -153.584 | -407.407 | -760.345 |
| 13.03999999999977 | 87.057 | 136.874 | 148.773 | 112.192 | 15.723 | -152.886 | -406.731 | -759.757 |
| 13.04999999999977 | 87.236 | 137.211 | 149.25 | 112.782 | 16.391 | -152.185 | -406.054 | -759.167 |
| 13.05999999999977 | 87.416 | 137.55 | 149.728 | 113.373 | 17.059 | -151.484 | -405.374 | -758.575 |
| 13.06999999999977 | 87.596 | 137.888 | 150.206 | 113.965 | 17.729 | -150.781 | -404.694 | -757.982 |
| 13.07999999999977 | 87.776 | 138.227 | 150.685 | 114.557 | 18.399 | -150.077 | -404.011 | -757.387 |
| 13.08999999999977 | 87.956 | 138.566 | 151.165 | 115.15 | 19.071 | -149.372 | -403.327 | -756.79 |
| 13.09999999999977 | 88.136 | 138.905 | 151.645 | 115.744 | 19.744 | -148.666 | -402.642 | -756.192 |
| 13.10999999999976 | 88.317 | 139.245 | 152.126 | 116.339 | 20.417 | -147.958 | -401.955 | -755.591 |
| 13.11999999999976 | 88.497 | 139.585 | 152.607 | 116.935 | 21.092 | -147.249 | -401.267 | -754.989 |
| 13.12999999999976 | 88.678 | 139.926 | 153.089 | 117.531 | 21.768 | -146.539 | -400.577 | -754.385 |
| 13.13999999999976 | 88.859 | 140.267 | 153.571 | 118.128 | 22.444 | -145.828 | -399.886 | -753.779 |
| 13.14999999999976 | 89.04 | 140.608 | 154.054 | 118.726 | 23.122 | -145.115 | -399.193 | -753.171 |
| 13.15999999999976 | 89.221 | 140.95 | 154.537 | 119.325 | 23.8 | -144.401 | -398.499 | -752.562 |
| 13.16999999999976 | 89.403 | 141.291 | 155.021 | 119.924 | 24.48 | -143.686 | -397.803 | -751.951 |
| 13.17999999999976 | 89.585 | 141.634 | 155.506 | 120.525 | 25.161 | -142.97 | -397.105 | -751.338 |
| 13.18999999999976 | 89.766 | 141.976 | 155.991 | 121.126 | 25.842 | -142.252 | -396.406 | -750.723 |
| 13.19999999999976 | 89.948 | 142.319 | 156.476 | 121.727 | 26.525 | -141.533 | -395.706 | -750.106 |
| 13.20999999999976 | 90.13 | 142.663 | 156.963 | 122.33 | 27.209 | -140.813 | -395.004 | -749.488 |
| 13.21999999999976 | 90.313 | 143.006 | 157.449 | 122.933 | 27.893 | -140.092 | -394.301 | -748.868 |
| 13.22999999999976 | 90.495 | 143.35 | 157.937 | 123.537 | 28.579 | -139.369 | -393.596 | -748.246 |
| 13.23999999999976 | 90.678 | 143.695 | 158.424 | 124.142 | 29.265 | -138.646 | -392.889 | -747.622 |
| 13.24999999999976 | 90.861 | 144.04 | 158.913 | 124.748 | 29.953 | -137.92 | -392.181 | -746.996 |
| 13.25999999999976 | 91.044 | 144.385 | 159.402 | 125.354 | 30.642 | -137.194 | -391.472 | -746.369 |
| 13.26999999999976 | 91.227 | 144.73 | 159.891 | 125.961 | 31.331 | -136.466 | -390.761 | -745.74 |
| 13.27999999999976 | 91.41 | 145.076 | 160.381 | 126.569 | 32.022 | -135.738 | -390.048 | -745.109 |
| 13.28999999999976 | 91.594 | 145.422 | 160.872 | 127.178 | 32.714 | -135.008 | -389.334 | -744.476 |
| 13.29999999999976 | 91.777 | 145.769 | 161.363 | 127.787 | 33.406 | -134.276 | -388.619 | -743.842 |
| 13.30999999999976 | 91.961 | 146.116 | 161.855 | 128.397 | 34.1 | -133.544 | -387.902 | -743.205 |
| 13.31999999999976 | 92.145 | 146.463 | 162.347 | 129.008 | 34.794 | -132.81 | -387.183 | -742.567 |
| 13.32999999999976 | 92.329 | 146.81 | 162.84 | 129.62 | 35.49 | -132.075 | -386.463 | -741.927 |
| 13.33999999999976 | 92.514 | 147.158 | 163.333 | 130.232 | 36.187 | -131.338 | -385.741 | -741.286 |
| 13.34999999999976 | 92.698 | 147.506 | 163.827 | 130.846 | 36.884 | -130.601 | -385.018 | -740.642 |
| 13.35999999999976 | 92.883 | 147.855 | 164.321 | 131.46 | 37.583 | -129.862 | -384.294 | -739.997 |
| 13.36999999999976 | 93.068 | 148.204 | 164.816 | 132.075 | 38.283 | -129.122 | -383.568 | -739.35 |
| 13.37999999999976 | 93.253 | 148.553 | 165.312 | 132.69 | 38.983 | -128.38 | -382.84 | -738.701 |
| 13.38999999999976 | 93.438 | 148.903 | 165.808 | 133.306 | 39.685 | -127.638 | -382.111 | -738.051 |
| 13.39999999999976 | 93.623 | 149.253 | 166.305 | 133.924 | 40.387 | -126.894 | -381.38 | -737.398 |
| 13.40999999999976 | 93.809 | 149.604 | 166.802 | 134.541 | 41.091 | -126.149 | -380.648 | -736.744 |
| 13.41999999999976 | 93.994 | 149.954 | 167.3 | 135.16 | 41.796 | -125.403 | -379.914 | -736.088 |
| 13.42999999999976 | 94.18 | 150.305 | 167.798 | 135.779 | 42.501 | -124.655 | -379.179 | -735.43 |
| 13.43999999999976 | 94.366 | 150.657 | 168.297 | 136.4 | 43.208 | -123.906 | -378.442 | -734.77 |
| 13.44999999999976 | 94.552 | 151.009 | 168.796 | 137.021 | 43.916 | -123.156 | -377.704 | -734.109 |
| 13.45999999999976 | 94.739 | 151.361 | 169.296 | 137.642 | 44.624 | -122.405 | -376.964 | -733.446 |
| 13.46999999999976 | 94.925 | 151.713 | 169.797 | 138.265 | 45.334 | -121.652 | -376.223 | -732.781 |
| 13.47999999999976 | 95.112 | 152.066 | 170.298 | 138.888 | 46.044 | -120.899 | -375.48 | -732.114 |
| 13.48999999999976 | 95.299 | 152.419 | 170.799 | 139.512 | 46.756 | -120.144 | -374.736 | -731.446 |
| 13.49999999999976 | 95.486 | 152.773 | 171.302 | 140.137 | 47.469 | -119.387 | -373.99 | -730.775 |
| 13.50999999999976 | 95.673 | 153.127 | 171.804 | 140.762 | 48.182 | -118.63 | -373.243 | -730.103 |
| 13.51999999999976 | 95.86 | 153.481 | 172.308 | 141.389 | 48.897 | -117.871 | -372.494 | -729.429 |
| 13.52999999999976 | 96.048 | 153.836 | 172.811 | 142.016 | 49.613 | -117.111 | -371.744 | -728.753 |
| 13.53999999999976 | 96.235 | 154.191 | 173.316 | 142.644 | 50.329 | -116.35 | -370.992 | -728.076 |
| 13.54999999999976 | 96.423 | 154.546 | 173.821 | 143.272 | 51.047 | -115.587 | -370.239 | -727.397 |
| 13.55999999999976 | 96.611 | 154.902 | 174.326 | 143.902 | 51.765 | -114.823 | -369.484 | -726.715 |
| 13.56999999999976 | 96.799 | 155.258 | 174.832 | 144.532 | 52.485 | -114.058 | -368.728 | -726.033 |
| 13.57999999999975 | 96.988 | 155.614 | 175.339 | 145.163 | 53.206 | -113.292 | -367.97 | -725.348 |
| 13.58999999999975 | 97.176 | 155.971 | 175.846 | 145.794 | 53.927 | -112.524 | -367.21 | -724.661 |
| 13.59999999999975 | 97.365 | 156.328 | 176.354 | 146.427 | 54.65 | -111.756 | -366.45 | -723.973 |
| 13.60999999999975 | 97.554 | 156.685 | 176.862 | 147.06 | 55.374 | -110.985 | -365.687 | -723.283 |
| 13.61999999999975 | 97.743 | 157.043 | 177.371 | 147.694 | 56.098 | -110.214 | -364.923 | -722.591 |
| 13.62999999999975 | 97.932 | 157.401 | 177.88 | 148.329 | 56.824 | -109.442 | -364.158 | -721.898 |
| 13.63999999999975 | 98.121 | 157.759 | 178.39 | 148.964 | 57.55 | -108.668 | -363.391 | -721.202 |
| 13.64999999999975 | 98.311 | 158.118 | 178.9 | 149.601 | 58.278 | -107.893 | -362.622 | -720.505 |
| 13.65999999999975 | 98.501 | 158.478 | 179.411 | 150.238 | 59.007 | -107.117 | -361.852 | -719.806 |
| 13.66999999999975 | 98.69 | 158.837 | 179.923 | 150.876 | 59.736 | -106.339 | -361.081 | -719.105 |
| 13.67999999999975 | 98.88 | 159.197 | 180.435 | 151.514 | 60.467 | -105.56 | -360.308 | -718.402 |
| 13.68999999999975 | 99.071 | 159.557 | 180.948 | 152.154 | 61.199 | -104.78 | -359.533 | -717.698 |
| 13.69999999999975 | 99.261 | 159.918 | 181.461 | 152.794 | 61.931 | -103.999 | -358.757 | -716.992 |
| 13.70999999999975 | 99.452 | 160.279 | 181.975 | 153.435 | 62.665 | -103.217 | -357.98 | -716.284 |
| 13.71999999999975 | 99.642 | 160.64 | 182.489 | 154.076 | 63.399 | -102.433 | -357.201 | -715.574 |
| 13.72999999999975 | 99.833 | 161.002 | 183.004 | 154.719 | 64.135 | -101.648 | -356.42 | -714.863 |
| 13.73999999999975 | 100.024 | 161.364 | 183.519 | 155.362 | 64.872 | -100.862 | -355.638 | -714.149 |
| 13.74999999999975 | 100.215 | 161.726 | 184.035 | 156.006 | 65.609 | -100.074 | -354.855 | -713.434 |
| 13.75999999999975 | 100.407 | 162.089 | 184.552 | 156.651 | 66.348 | -99.285 | -354.07 | -712.717 |
| 13.76999999999975 | 100.598 | 162.452 | 185.069 | 157.296 | 67.088 | -98.495 | -353.283 | -711.998 |
| 13.77999999999975 | 100.79 | 162.815 | 185.587 | 157.943 | 67.828 | -97.704 | -352.495 | -711.278 |
| 13.78999999999975 | 100.982 | 163.179 | 186.105 | 158.59 | 68.57 | -96.912 | -351.705 | -710.555 |
| 13.79999999999975 | 101.174 | 163.543 | 186.624 | 159.237 | 69.312 | -96.118 | -350.914 | -709.831 |
| 13.80999999999975 | 101.366 | 163.908 | 187.143 | 159.886 | 70.056 | -95.323 | -350.121 | -709.105 |
| 13.81999999999975 | 101.559 | 164.272 | 187.663 | 160.535 | 70.801 | -94.527 | -349.327 | -708.378 |
| 13.82999999999975 | 101.751 | 164.637 | 188.183 | 161.186 | 71.546 | -93.729 | -348.532 | -707.648 |
| 13.83999999999975 | 101.944 | 165.003 | 188.704 | 161.836 | 72.293 | -92.93 | -347.734 | -706.917 |
| 13.84999999999975 | 102.137 | 165.369 | 189.226 | 162.488 | 73.041 | -92.13 | -346.936 | -706.184 |
| 13.85999999999975 | 102.33 | 165.735 | 189.748 | 163.141 | 73.789 | -91.329 | -346.135 | -705.449 |
| 13.86999999999975 | 102.523 | 166.102 | 190.27 | 163.794 | 74.539 | -90.527 | -345.334 | -704.712 |
| 13.87999999999975 | 102.716 | 166.469 | 190.793 | 164.448 | 75.289 | -89.723 | -344.531 | -703.974 |
| 13.88999999999975 | 102.91 | 166.836 | 191.317 | 165.102 | 76.041 | -88.918 | -343.726 | -703.234 |
| 13.89999999999975 | 103.104 | 167.204 | 191.841 | 165.758 | 76.794 | -88.112 | -342.92 | -702.492 |
| 13.90999999999975 | 103.298 | 167.572 | 192.366 | 166.414 | 77.547 | -87.304 | -342.112 | -701.748 |
| 13.91999999999975 | 103.492 | 167.94 | 192.891 | 167.071 | 78.302 | -86.495 | -341.302 | -701.002 |
| 13.92999999999975 | 103.686 | 168.309 | 193.417 | 167.729 | 79.058 | -85.686 | -340.492 | -700.255 |
| 13.93999999999975 | 103.88 | 168.678 | 193.944 | 168.388 | 79.814 | -84.874 | -339.679 | -699.506 |
| 13.94999999999975 | 104.075 | 169.047 | 194.471 | 169.047 | 80.572 | -84.062 | -338.866 | -698.755 |
| 13.95999999999975 | 104.27 | 169.417 | 194.998 | 169.707 | 81.33 | -83.248 | -338.05 | -698.002 |
| 13.96999999999975 | 104.464 | 169.787 | 195.527 | 170.368 | 82.09 | -82.433 | -337.233 | -697.247 |
| 13.97999999999975 | 104.66 | 170.157 | 196.055 | 171.03 | 82.851 | -81.617 | -336.415 | -696.491 |
| 13.98999999999975 | 104.855 | 170.528 | 196.584 | 171.692 | 83.612 | -80.8 | -335.595 | -695.733 |
| 13.99999999999975 | 105.05 | 170.899 | 197.114 | 172.355 | 84.375 | -79.981 | -334.774 | -694.973 |
| 14.00999999999975 | 105.246 | 171.271 | 197.645 | 173.019 | 85.139 | -79.161 | -333.951 | -694.211 |
| 14.01999999999975 | 105.442 | 171.643 | 198.175 | 173.684 | 85.903 | -78.34 | -333.127 | -693.448 |
| 14.02999999999975 | 105.637 | 172.015 | 198.707 | 174.349 | 86.669 | -77.517 | -332.301 | -692.682 |
| 14.03999999999975 | 105.834 | 172.387 | 199.239 | 175.016 | 87.435 | -76.694 | -331.473 | -691.915 |
| 14.04999999999974 | 106.03 | 172.76 | 199.771 | 175.683 | 88.203 | -75.869 | -330.644 | -691.146 |
| 14.05999999999974 | 106.226 | 173.134 | 200.304 | 176.35 | 88.972 | -75.042 | -329.814 | -690.375 |
| 14.06999999999974 | 106.423 | 173.507 | 200.838 | 177.019 | 89.741 | -74.215 | -328.982 | -689.603 |
| 14.07999999999974 | 106.62 | 173.881 | 201.372 | 177.688 | 90.512 | -73.386 | -328.148 | -688.829 |
| 14.08999999999974 | 106.816 | 174.255 | 201.907 | 178.358 | 91.284 | -72.556 | -327.313 | -688.053 |
| 14.09999999999974 | 107.014 | 174.63 | 202.442 | 179.029 | 92.056 | -71.725 | -326.477 | -687.275 |
| 14.10999999999974 | 107.211 | 175.005 | 202.978 | 179.701 | 92.83 | -70.893 | -325.639 | -686.495 |
| 14.11999999999974 | 107.408 | 175.38 | 203.515 | 180.373 | 93.604 | -70.059 | -324.799 | -685.714 |
| 14.12999999999974 | 107.606 | 175.756 | 204.052 | 181.046 | 94.38 | -69.224 | -323.958 | -684.93 |
| 14.13999999999974 | 107.804 | 176.132 | 204.589 | 181.72 | 95.157 | -68.388 | -323.116 | -684.145 |
| 14.14999999999974 | 108.001 | 176.509 | 205.127 | 182.395 | 95.934 | -67.55 | -322.272 | -683.358 |
| 14.15999999999974 | 108.2 | 176.886 | 205.666 | 183.071 | 96.713 | -66.712 | -321.426 | -682.57 |
| 14.16999999999974 | 108.398 | 177.263 | 206.205 | 183.747 | 97.493 | -65.872 | -320.579 | -681.779 |
| 14.17999999999974 | 108.596 | 177.64 | 206.745 | 184.424 | 98.273 | -65.031 | -319.73 | -680.987 |
| 14.18999999999974 | 108.795 | 178.018 | 207.285 | 185.102 | 99.055 | -64.188 | -318.88 | -680.193 |
| 14.19999999999974 | 108.994 | 178.396 | 207.826 | 185.78 | 99.837 | -63.345 | -318.029 | -679.397 |
| 14.20999999999974 | 109.193 | 178.775 | 208.367 | 186.459 | 100.621 | -62.5 | -317.176 | -678.6 |
| 14.21999999999974 | 109.392 | 179.154 | 208.909 | 187.14 | 101.406 | -61.654 | -316.321 | -677.8 |
| 14.22999999999974 | 109.591 | 179.533 | 209.451 | 187.82 | 102.191 | -60.806 | -315.465 | -676.999 |
| 14.23999999999974 | 109.79 | 179.912 | 209.994 | 188.502 | 102.978 | -59.958 | -314.607 | -676.196 |
| 14.24999999999974 | 109.99 | 180.292 | 210.538 | 189.184 | 103.766 | -59.108 | -313.748 | -675.392 |
| 14.25999999999974 | 110.19 | 180.673 | 211.082 | 189.868 | 104.554 | -58.256 | -312.887 | -674.585 |
| 14.26999999999974 | 110.39 | 181.053 | 211.627 | 190.551 | 105.344 | -57.404 | -312.025 | -673.777 |
| 14.27999999999974 | 110.59 | 181.434 | 212.172 | 191.236 | 106.134 | -56.55 | -311.161 | -672.967 |
| 14.28999999999974 | 110.79 | 181.816 | 212.718 | 191.922 | 106.926 | -55.696 | -310.296 | -672.155 |
| 14.29999999999974 | 110.991 | 182.197 | 213.264 | 192.608 | 107.719 | -54.839 | -309.429 | -671.341 |
| 14.30999999999974 | 111.191 | 182.58 | 213.811 | 193.295 | 108.512 | -53.982 | -308.561 | -670.525 |
| 14.31999999999974 | 111.392 | 182.962 | 214.359 | 193.983 | 109.307 | -53.123 | -307.691 | -669.708 |
| 14.32999999999974 | 111.593 | 183.345 | 214.907 | 194.671 | 110.103 | -52.263 | -306.82 | -668.889 |
| 14.33999999999974 | 111.794 | 183.728 | 215.455 | 195.36 | 110.899 | -51.402 | -305.947 | -668.068 |
| 14.34999999999974 | 111.995 | 184.111 | 216.004 | 196.05 | 111.697 | -50.54 | -305.073 | -667.246 |
| 14.35999999999974 | 112.197 | 184.495 | 216.554 | 196.741 | 112.495 | -49.676 | -304.197 | -666.421 |
| 14.36999999999974 | 112.398 | 184.879 | 217.104 | 197.433 | 113.295 | -48.811 | -303.32 | -665.595 |
| 14.37999999999974 | 112.6 | 185.264 | 217.655 | 198.125 | 114.096 | -47.945 | -302.441 | -664.767 |
| 14.38999999999974 | 112.802 | 185.649 | 218.206 | 198.818 | 114.897 | -47.078 | -301.561 | -663.937 |
| 14.39999999999974 | 113.004 | 186.034 | 218.758 | 199.512 | 115.7 | -46.209 | -300.679 | -663.105 |
| 14.40999999999974 | 113.207 | 186.42 | 219.31 | 200.207 | 116.504 | -45.339 | -299.796 | -662.272 |
| 14.41999999999974 | 113.409 | 186.805 | 219.863 | 200.902 | 117.308 | -44.468 | -298.911 | -661.437 |
| 14.42999999999974 | 113.612 | 187.192 | 220.417 | 201.599 | 118.114 | -43.596 | -298.024 | -660.6 |
| 14.43999999999974 | 113.815 | 187.578 | 220.971 | 202.296 | 118.92 | -42.722 | -297.136 | -659.761 |
| 14.44999999999974 | 114.017 | 187.965 | 221.525 | 202.993 | 119.728 | -41.847 | -296.247 | -658.92 |
| 14.45999999999974 | 114.221 | 188.353 | 222.081 | 203.692 | 120.537 | -40.971 | -295.356 | -658.078 |
| 14.46999999999974 | 114.424 | 188.74 | 222.636 | 204.391 | 121.346 | -40.094 | -294.464 | -657.234 |
| 14.47999999999974 | 114.627 | 189.128 | 223.193 | 205.091 | 122.157 | -39.215 | -293.57 | -656.388 |
| 14.48999999999974 | 114.831 | 189.517 | 223.749 | 205.792 | 122.969 | -38.336 | -292.674 | -655.54 |
| 14.49999999999974 | 115.035 | 189.906 | 224.307 | 206.494 | 123.781 | -37.454 | -291.777 | -654.69 |
| 14.50999999999974 | 115.239 | 190.295 | 224.865 | 207.196 | 124.595 | -36.572 | -290.879 | -653.839 |
| 14.51999999999973 | 115.443 | 190.684 | 225.423 | 207.899 | 125.409 | -35.688 | -289.979 | -652.986 |
| 14.52999999999973 | 115.647 | 191.074 | 225.982 | 208.603 | 126.225 | -34.804 | -289.077 | -652.131 |
| 14.53999999999973 | 115.852 | 191.464 | 226.542 | 209.308 | 127.042 | -33.918 | -288.174 | -651.274 |
| 14.54999999999973 | 116.056 | 191.855 | 227.102 | 210.013 | 127.859 | -33.03 | -287.27 | -650.416 |
| 14.55999999999973 | 116.261 | 192.246 | 227.663 | 210.719 | 128.678 | -32.142 | -286.364 | -649.555 |
| 14.56999999999973 | 116.466 | 192.637 | 228.224 | 211.426 | 129.498 | -31.252 | -285.456 | -648.693 |
| 14.57999999999973 | 116.671 | 193.028 | 228.786 | 212.134 | 130.318 | -30.361 | -284.547 | -647.829 |
| 14.58999999999973 | 116.877 | 193.42 | 229.348 | 212.842 | 131.14 | -29.468 | -283.636 | -646.964 |
| 14.59999999999973 | 117.082 | 193.812 | 229.911 | 213.552 | 131.962 | -28.575 | -282.724 | -646.096 |
| 14.60999999999973 | 117.288 | 194.205 | 230.474 | 214.262 | 132.786 | -27.68 | -281.811 | -645.227 |
| 14.61999999999973 | 117.494 | 194.598 | 231.038 | 214.973 | 133.611 | -26.784 | -280.895 | -644.356 |
| 14.62999999999973 | 117.7 | 194.991 | 231.603 | 215.684 | 134.436 | -25.886 | -279.979 | -643.483 |
| 14.63999999999973 | 117.906 | 195.385 | 232.168 | 216.396 | 135.263 | -24.988 | -279.061 | -642.609 |
| 14.64999999999973 | 118.112 | 195.779 | 232.734 | 217.11 | 136.091 | -24.088 | -278.141 | -641.732 |
| 14.65999999999973 | 118.319 | 196.174 | 233.3 | 217.823 | 136.919 | -23.187 | -277.22 | -640.854 |
| 14.66999999999973 | 118.525 | 196.568 | 233.867 | 218.538 | 137.749 | -22.285 | -276.297 | -639.974 |
| 14.67999999999973 | 118.732 | 196.963 | 234.434 | 219.253 | 138.579 | -21.381 | -275.373 | -639.092 |
| 14.68999999999973 | 118.939 | 197.359 | 235.002 | 219.97 | 139.411 | -20.476 | -274.447 | -638.208 |
| 14.69999999999973 | 119.146 | 197.755 | 235.57 | 220.687 | 140.244 | -19.57 | -273.52 | -637.323 |
| 14.70999999999973 | 119.354 | 198.151 | 236.139 | 221.404 | 141.077 | -18.663 | -272.591 | -636.436 |
| 14.71999999999973 | 119.561 | 198.547 | 236.709 | 222.123 | 141.912 | -17.754 | -271.661 | -635.547 |
| 14.72999999999973 | 119.769 | 198.944 | 237.279 | 222.842 | 142.748 | -16.845 | -270.729 | -634.656 |
| 14.73999999999973 | 119.977 | 199.341 | 237.849 | 223.562 | 143.584 | -15.934 | -269.796 | -633.764 |
| 14.74999999999973 | 120.185 | 199.739 | 238.421 | 224.283 | 144.422 | -15.021 | -268.861 | -632.869 |
| 14.75999999999973 | 120.393 | 200.137 | 238.992 | 225.004 | 145.26 | -14.108 | -267.925 | -631.973 |
| 14.76999999999973 | 120.601 | 200.535 | 239.565 | 225.727 | 146.1 | -13.193 | -266.987 | -631.075 |
| 14.77999999999973 | 120.81 | 200.934 | 240.138 | 226.45 | 146.941 | -12.277 | -266.048 | -630.175 |
| 14.78999999999973 | 121.018 | 201.333 | 240.711 | 227.174 | 147.782 | -11.36 | -265.107 | -629.274 |
| 14.79999999999973 | 121.227 | 201.732 | 241.285 | 227.898 | 148.625 | -10.441 | -264.165 | -628.371 |
| 14.80999999999973 | 121.436 | 202.132 | 241.859 | 228.624 | 149.469 | -9.521 | -263.221 | -627.465 |
| 14.81999999999973 | 121.645 | 202.532 | 242.434 | 229.35 | 150.313 | -8.6 | -262.276 | -626.559 |
| 14.82999999999973 | 121.855 | 202.932 | 243.01 | 230.077 | 151.159 | -7.678 | -261.329 | -625.65 |
| 14.83999999999973 | 122.064 | 203.333 | 243.586 | 230.804 | 152.005 | -6.754 | -260.38 | -624.739 |
| 14.84999999999973 | 122.274 | 203.734 | 244.163 | 231.533 | 152.853 | -5.83 | -259.43 | -623.827 |
| 14.85999999999973 | 122.484 | 204.135 | 244.74 | 232.262 | 153.702 | -4.903 | -258.479 | -622.913 |
| 14.86999999999973 | 122.694 | 204.537 | 245.318 | 232.992 | 154.551 | -3.976 | -257.526 | -621.997 |
| 14.87999999999973 | 122.904 | 204.939 | 245.896 | 233.723 | 155.402 | -3.048 | -256.572 | -621.08 |
| 14.88999999999973 | 123.114 | 205.341 | 246.475 | 234.454 | 156.254 | -2.118 | -255.616 | -620.16 |
| 14.89999999999973 | 123.325 | 205.744 | 247.055 | 235.187 | 157.106 | -1.187 | -254.658 | -619.239 |
| 14.90999999999973 | 123.536 | 206.148 | 247.635 | 235.92 | 157.96 | -0.255 | -253.699 | -618.316 |
| 14.91999999999973 | 123.747 | 206.551 | 248.215 | 236.654 | 158.814 | 0.679 | -252.739 | -617.391 |
| 14.92999999999973 | 123.958 | 206.955 | 248.796 | 237.388 | 159.67 | 1.614 | -251.777 | -616.464 |
| 14.93999999999973 | 124.169 | 207.359 | 249.378 | 238.124 | 160.527 | 2.55 | -250.813 | -615.536 |
| 14.94999999999973 | 124.38 | 207.764 | 249.96 | 238.86 | 161.384 | 3.487 | -249.848 | -614.606 |
| 14.95999999999973 | 124.592 | 208.169 | 250.543 | 239.597 | 162.243 | 4.425 | -248.882 | -613.674 |
| 14.96999999999973 | 124.803 | 208.574 | 251.126 | 240.334 | 163.103 | 5.365 | -247.914 | -612.74 |
| 14.97999999999973 | 125.015 | 208.98 | 251.71 | 241.073 | 163.963 | 6.306 | -246.944 | -611.805 |
| 14.98999999999972 | 125.227 | 209.386 | 252.295 | 241.812 | 164.825 | 7.248 | -245.973 | -610.867 |
| 14.99999999999972 | 125.439 | 209.792 | 252.879 | 242.552 | 165.687 | 8.192 | -245.001 | -609.928 |
| 15.00999999999972 | 125.652 | 210.199 | 253.465 | 243.293 | 166.551 | 9.137 | -244.026 | -608.987 |
| 15.01999999999972 | 125.864 | 210.606 | 254.051 | 244.034 | 167.416 | 10.083 | -243.051 | -608.044 |
| 15.02999999999972 | 126.077 | 211.013 | 254.638 | 244.777 | 168.281 | 11.03 | -242.074 | -607.1 |
| 15.03999999999972 | 126.29 | 211.421 | 255.225 | 245.52 | 169.148 | 11.978 | -241.095 | -606.153 |
| 15.04999999999972 | 126.503 | 211.829 | 255.813 | 246.263 | 170.016 | 12.928 | -240.115 | -605.205 |
| 15.05999999999972 | 126.716 | 212.238 | 256.401 | 247.008 | 170.884 | 13.879 | -239.133 | -604.255 |
| 15.06999999999972 | 126.93 | 212.646 | 256.99 | 247.753 | 171.754 | 14.831 | -238.15 | -603.304 |
| 15.07999999999972 | 127.143 | 213.055 | 257.579 | 248.5 | 172.624 | 15.785 | -237.165 | -602.35 |
| 15.08999999999972 | 127.357 | 213.465 | 258.169 | 249.246 | 173.496 | 16.74 | -236.179 | -601.395 |
| 15.09999999999972 | 127.571 | 213.875 | 258.76 | 249.994 | 174.369 | 17.696 | -235.192 | -600.438 |
| 15.10999999999972 | 127.785 | 214.285 | 259.351 | 250.743 | 175.242 | 18.653 | -234.202 | -599.479 |
| 15.11999999999972 | 127.999 | 214.696 | 259.942 | 251.492 | 176.117 | 19.611 | -233.212 | -598.518 |
| 15.12999999999972 | 128.214 | 215.107 | 260.534 | 252.242 | 176.993 | 20.571 | -232.219 | -597.556 |
| 15.13999999999972 | 128.428 | 215.518 | 261.127 | 252.992 | 177.869 | 21.532 | -231.226 | -596.592 |
| 15.14999999999972 | 128.643 | 215.93 | 261.72 | 253.744 | 178.747 | 22.494 | -230.23 | -595.626 |
| 15.15999999999972 | 128.858 | 216.342 | 262.314 | 254.496 | 179.625 | 23.458 | -229.234 | -594.658 |
| 15.16999999999972 | 129.073 | 216.754 | 262.909 | 255.249 | 180.505 | 24.423 | -228.235 | -593.688 |
| 15.17999999999972 | 129.288 | 217.167 | 263.503 | 256.003 | 181.386 | 25.388 | -227.236 | -592.717 |
| 15.18999999999972 | 129.503 | 217.58 | 264.099 | 256.758 | 182.267 | 26.356 | -226.234 | -591.744 |
| 15.19999999999972 | 129.719 | 217.993 | 264.695 | 257.513 | 183.15 | 27.324 | -225.231 | -590.769 |
| 15.20999999999972 | 129.935 | 218.407 | 265.292 | 258.269 | 184.034 | 28.294 | -224.227 | -589.792 |
| 15.21999999999972 | 130.151 | 218.821 | 265.889 | 259.026 | 184.918 | 29.265 | -223.221 | -588.813 |
| 15.22999999999972 | 130.367 | 219.235 | 266.486 | 259.784 | 185.804 | 30.237 | -222.214 | -587.833 |
| 15.23999999999972 | 130.583 | 219.65 | 267.085 | 260.542 | 186.69 | 31.21 | -221.205 | -586.851 |
| 15.24999999999972 | 130.799 | 220.065 | 267.683 | 261.301 | 187.578 | 32.185 | -220.195 | -585.867 |
| 15.25999999999972 | 131.016 | 220.481 | 268.283 | 262.061 | 188.467 | 33.161 | -219.183 | -584.881 |
| 15.26999999999972 | 131.233 | 220.897 | 268.883 | 262.822 | 189.356 | 34.138 | -218.169 | -583.894 |
| 15.27999999999972 | 131.45 | 221.313 | 269.483 | 263.583 | 190.247 | 35.117 | -217.154 | -582.904 |
| 15.28999999999972 | 131.667 | 221.729 | 270.084 | 264.346 | 191.139 | 36.096 | -216.138 | -581.913 |
| 15.29999999999972 | 131.884 | 222.146 | 270.685 | 265.109 | 192.031 | 37.077 | -215.12 | -580.92 |
| 15.30999999999972 | 132.101 | 222.564 | 271.288 | 265.872 | 192.925 | 38.06 | -214.101 | -579.925 |
| 15.31999999999972 | 132.319 | 222.981 | 271.89 | 266.637 | 193.819 | 39.043 | -213.08 | -578.929 |
| 15.32999999999972 | 132.537 | 223.399 | 272.493 | 267.402 | 194.715 | 40.028 | -212.057 | -577.931 |
| 15.33999999999972 | 132.755 | 223.817 | 273.097 | 268.168 | 195.612 | 41.014 | -211.033 | -576.931 |
| 15.34999999999972 | 132.973 | 224.236 | 273.701 | 268.935 | 196.509 | 42.001 | -210.008 | -575.929 |
| 15.35999999999972 | 133.191 | 224.655 | 274.306 | 269.703 | 197.408 | 42.989 | -208.981 | -574.925 |
| 15.36999999999972 | 133.409 | 225.074 | 274.912 | 270.471 | 198.308 | 43.979 | -207.952 | -573.92 |
| 15.37999999999972 | 133.628 | 225.494 | 275.518 | 271.24 | 199.208 | 44.97 | -206.922 | -572.912 |
| 15.38999999999972 | 133.847 | 225.914 | 276.124 | 272.01 | 200.11 | 45.962 | -205.891 | -571.903 |
| 15.39999999999972 | 134.066 | 226.335 | 276.731 | 272.781 | 201.012 | 46.956 | -204.858 | -570.892 |
| 15.40999999999972 | 134.285 | 226.756 | 277.339 | 273.553 | 201.916 | 47.95 | -203.823 | -569.88 |
| 15.41999999999972 | 134.504 | 227.177 | 277.947 | 274.325 | 202.821 | 48.946 | -202.787 | -568.865 |
| 15.42999999999972 | 134.723 | 227.598 | 278.556 | 275.098 | 203.726 | 49.943 | -201.749 | -567.849 |
| 15.43999999999972 | 134.943 | 228.02 | 279.165 | 275.872 | 204.633 | 50.942 | -200.71 | -566.831 |
| 15.44999999999972 | 135.163 | 228.442 | 279.775 | 276.646 | 205.541 | 51.941 | -199.67 | -565.811 |
| 15.45999999999971 | 135.383 | 228.865 | 280.385 | 277.421 | 206.449 | 52.942 | -198.627 | -564.79 |
| 15.46999999999971 | 135.603 | 229.288 | 280.996 | 278.198 | 207.359 | 53.944 | -197.584 | -563.766 |
| 15.47999999999971 | 135.823 | 229.711 | 281.608 | 278.974 | 208.269 | 54.948 | -196.539 | -562.741 |
| 15.48999999999971 | 136.044 | 230.134 | 282.22 | 279.752 | 209.181 | 55.952 | -195.492 | -561.714 |
| 15.49999999999971 | 136.264 | 230.558 | 282.832 | 280.53 | 210.094 | 56.958 | -194.444 | -560.686 |
| 15.50999999999971 | 136.485 | 230.983 | 283.445 | 281.31 | 211.007 | 57.966 | -193.394 | -559.655 |
| 15.51999999999971 | 136.706 | 231.407 | 284.059 | 282.089 | 211.922 | 58.974 | -192.343 | -558.623 |
| 15.52999999999971 | 136.927 | 231.832 | 284.673 | 282.87 | 212.838 | 59.984 | -191.29 | -557.589 |
| 15.53999999999971 | 137.148 | 232.258 | 285.288 | 283.652 | 213.754 | 60.994 | -190.236 | -556.553 |
| 15.54999999999971 | 137.37 | 232.683 | 285.903 | 284.434 | 214.672 | 62.007 | -189.18 | -555.515 |
| 15.55999999999971 | 137.591 | 233.11 | 286.519 | 285.217 | 215.59 | 63.02 | -188.123 | -554.475 |
| 15.56999999999971 | 137.813 | 233.536 | 287.136 | 286.001 | 216.51 | 64.035 | -187.064 | -553.434 |
| 15.57999999999971 | 138.035 | 233.963 | 287.753 | 286.785 | 217.431 | 65.051 | -186.004 | -552.391 |
| 15.58999999999971 | 138.257 | 234.39 | 288.37 | 287.57 | 218.352 | 66.068 | -184.942 | -551.346 |
| 15.59999999999971 | 138.479 | 234.817 | 288.988 | 288.356 | 219.275 | 67.086 | -183.879 | -550.3 |
| 15.60999999999971 | 138.702 | 235.245 | 289.607 | 289.143 | 220.199 | 68.106 | -182.814 | -549.251 |
| 15.61999999999971 | 138.925 | 235.673 | 290.226 | 289.931 | 221.123 | 69.127 | -181.748 | -548.201 |
| 15.62999999999971 | 139.147 | 236.102 | 290.846 | 290.719 | 222.049 | 70.149 | -180.68 | -547.149 |
| 15.63999999999971 | 139.37 | 236.531 | 291.466 | 291.508 | 222.975 | 71.172 | -179.611 | -546.095 |
| 15.64999999999971 | 139.593 | 236.96 | 292.087 | 292.298 | 223.903 | 72.197 | -178.54 | -545.039 |
| 15.65999999999971 | 139.817 | 237.39 | 292.708 | 293.089 | 224.832 | 73.223 | -177.467 | -543.982 |
| 15.66999999999971 | 140.04 | 237.819 | 293.33 | 293.88 | 225.761 | 74.25 | -176.394 | -542.923 |
| 15.67999999999971 | 140.264 | 238.25 | 293.953 | 294.673 | 226.692 | 75.278 | -175.318 | -541.862 |
| 15.68999999999971 | 140.488 | 238.68 | 294.576 | 295.466 | 227.624 | 76.308 | -174.241 | -540.799 |
| 15.69999999999971 | 140.712 | 239.111 | 295.2 | 296.259 | 228.556 | 77.339 | -173.163 | -539.734 |
| 15.70999999999971 | 140.936 | 239.543 | 295.824 | 297.054 | 229.49 | 78.371 | -172.083 | -538.668 |
| 15.71999999999971 | 141.16 | 239.974 | 296.448 | 297.849 | 230.424 | 79.404 | -171.001 | -537.6 |
| 15.72999999999971 | 141.385 | 240.406 | 297.074 | 298.645 | 231.36 | 80.439 | -169.918 | -536.53 |
| 15.73999999999971 | 141.609 | 240.839 | 297.7 | 299.442 | 232.297 | 81.474 | -168.834 | -535.458 |
| 15.74999999999971 | 141.834 | 241.272 | 298.326 | 300.24 | 233.234 | 82.512 | -167.748 | -534.384 |
| 15.75999999999971 | 142.059 | 241.705 | 298.953 | 301.038 | 234.173 | 83.55 | -166.661 | -533.309 |
| 15.76999999999971 | 142.284 | 242.138 | 299.58 | 301.837 | 235.113 | 84.59 | -165.572 | -532.232 |
| 15.77999999999971 | 142.509 | 242.572 | 300.208 | 302.637 | 236.053 | 85.63 | -164.481 | -531.153 |
| 15.78999999999971 | 142.735 | 243.006 | 300.837 | 303.438 | 236.995 | 86.672 | -163.389 | -530.072 |
| 15.79999999999971 | 142.961 | 243.441 | 301.466 | 304.239 | 237.937 | 87.716 | -162.295 | -528.99 |
| 15.80999999999971 | 143.186 | 243.876 | 302.096 | 305.041 | 238.881 | 88.76 | -161.2 | -527.905 |
| 15.81999999999971 | 143.412 | 244.311 | 302.726 | 305.844 | 239.826 | 89.806 | -160.104 | -526.819 |
| 15.82999999999971 | 143.638 | 244.746 | 303.357 | 306.648 | 240.771 | 90.853 | -159.006 | -525.731 |
| 15.83999999999971 | 143.865 | 245.182 | 303.988 | 307.452 | 241.718 | 91.902 | -157.906 | -524.642 |
| 15.84999999999971 | 144.091 | 245.618 | 304.62 | 308.258 | 242.666 | 92.951 | -156.805 | -523.55 |
| 15.85999999999971 | 144.318 | 246.055 | 305.253 | 309.064 | 243.614 | 94.002 | -155.702 | -522.457 |
| 15.86999999999971 | 144.545 | 246.492 | 305.886 | 309.871 | 244.564 | 95.054 | -154.598 | -521.362 |
| 15.87999999999971 | 144.772 | 246.929 | 306.519 | 310.678 | 245.514 | 96.108 | -153.493 | -520.265 |
| 15.88999999999971 | 144.999 | 247.367 | 307.153 | 311.486 | 246.466 | 97.162 | -152.386 | -519.167 |
| 15.89999999999971 | 145.226 | 247.805 | 307.788 | 312.296 | 247.419 | 98.218 | -151.277 | -518.066 |
| 15.90999999999971 | 145.454 | 248.244 | 308.423 | 313.105 | 248.372 | 99.275 | -150.167 | -516.964 |
| 15.91999999999971 | 145.681 | 248.682 | 309.059 | 313.916 | 249.327 | 100.333 | -149.055 | -515.86 |
| 15.9299999999997 | 145.909 | 249.121 | 309.695 | 314.727 | 250.283 | 101.393 | -147.942 | -514.754 |
| 15.9399999999997 | 146.137 | 249.561 | 310.332 | 315.54 | 251.239 | 102.454 | -146.827 | -513.646 |
| 15.9499999999997 | 146.365 | 250.001 | 310.969 | 316.353 | 252.197 | 103.516 | -145.711 | -512.537 |
| 15.9599999999997 | 146.594 | 250.441 | 311.607 | 317.166 | 253.155 | 104.579 | -144.593 | -511.426 |
| 15.9699999999997 | 146.822 | 250.881 | 312.246 | 317.981 | 254.115 | 105.644 | -143.474 | -510.313 |
| 15.9799999999997 | 147.051 | 251.322 | 312.885 | 318.796 | 255.076 | 106.709 | -142.353 | -509.198 |
| 15.9899999999997 | 147.28 | 251.763 | 313.525 | 319.612 | 256.037 | 107.776 | -141.231 | -508.082 |
| 15.9999999999997 | 147.509 | 252.205 | 314.165 | 320.429 | 257 | 108.845 | -140.107 | -506.963 |
| 16.0099999999997 | 147.738 | 252.647 | 314.806 | 321.246 | 257.964 | 109.914 | -138.982 | -505.843 |
| 16.0199999999997 | 147.967 | 253.089 | 315.447 | 322.065 | 258.928 | 110.985 | -137.855 | -504.721 |
| 16.02999999999971 | 148.197 | 253.532 | 316.089 | 322.884 | 259.894 | 112.057 | -136.727 | -503.597 |
| 16.03999999999971 | 148.427 | 253.975 | 316.731 | 323.704 | 260.86 | 113.13 | -135.597 | -502.472 |
| 16.04999999999971 | 148.656 | 254.418 | 317.374 | 324.524 | 261.828 | 114.205 | -134.466 | -501.345 |
| 16.05999999999971 | 148.886 | 254.862 | 318.017 | 325.346 | 262.797 | 115.281 | -133.333 | -500.215 |
| 16.06999999999971 | 149.117 | 255.306 | 318.661 | 326.168 | 263.766 | 116.358 | -132.198 | -499.085 |
| 16.07999999999971 | 149.347 | 255.75 | 319.306 | 326.991 | 264.737 | 117.436 | -131.063 | -497.952 |
| 16.08999999999972 | 149.577 | 256.195 | 319.951 | 327.814 | 265.709 | 118.516 | -129.925 | -496.817 |
| 16.09999999999972 | 149.808 | 256.64 | 320.597 | 328.639 | 266.681 | 119.596 | -128.786 | -495.681 |
| 16.10999999999972 | 150.039 | 257.085 | 321.243 | 329.464 | 267.655 | 120.679 | -127.646 | -494.543 |
| 16.11999999999972 | 150.27 | 257.531 | 321.89 | 330.29 | 268.629 | 121.762 | -126.504 | -493.403 |
| 16.12999999999972 | 150.501 | 257.977 | 322.537 | 331.117 | 269.605 | 122.846 | -125.361 | -492.262 |
| 16.13999999999972 | 150.733 | 258.423 | 323.185 | 331.944 | 270.582 | 123.932 | -124.216 | -491.118 |
| 16.14999999999973 | 150.964 | 258.87 | 323.834 | 332.773 | 271.559 | 125.019 | -123.069 | -489.973 |
| 16.15999999999973 | 151.196 | 259.318 | 324.483 | 333.602 | 272.538 | 126.107 | -121.921 | -488.826 |
| 16.16999999999973 | 151.428 | 259.765 | 325.132 | 334.432 | 273.518 | 127.197 | -120.772 | -487.677 |
| 16.17999999999973 | 151.66 | 260.213 | 325.782 | 335.262 | 274.498 | 128.288 | -119.621 | -486.526 |
| 16.18999999999973 | 151.892 | 260.661 | 326.433 | 336.094 | 275.48 | 129.38 | -118.468 | -485.374 |
| 16.19999999999973 | 152.124 | 261.11 | 327.084 | 336.926 | 276.462 | 130.473 | -117.314 | -484.22 |
| 16.20999999999973 | 152.357 | 261.559 | 327.736 | 337.759 | 277.446 | 131.567 | -116.159 | -483.064 |
| 16.21999999999974 | 152.59 | 262.008 | 328.388 | 338.592 | 278.431 | 132.663 | -115.002 | -481.906 |
| 16.22999999999974 | 152.822 | 262.458 | 329.041 | 339.427 | 279.416 | 133.76 | -113.843 | -480.747 |
| 16.23999999999974 | 153.055 | 262.908 | 329.695 | 340.262 | 280.403 | 134.858 | -112.683 | -479.585 |
| 16.24999999999974 | 153.289 | 263.358 | 330.349 | 341.098 | 281.391 | 135.958 | -111.521 | -478.422 |
| 16.25999999999974 | 153.522 | 263.809 | 331.003 | 341.935 | 282.379 | 137.059 | -110.358 | -477.257 |
| 16.26999999999974 | 153.756 | 264.26 | 331.658 | 342.772 | 283.369 | 138.161 | -109.194 | -476.09 |
| 16.27999999999975 | 153.989 | 264.711 | 332.314 | 343.611 | 284.359 | 139.264 | -108.028 | -474.922 |
| 16.28999999999975 | 154.223 | 265.163 | 332.97 | 344.45 | 285.351 | 140.368 | -106.86 | -473.751 |
| 16.29999999999975 | 154.457 | 265.615 | 333.627 | 345.289 | 286.344 | 141.474 | -105.691 | -472.579 |
| 16.30999999999975 | 154.691 | 266.068 | 334.284 | 346.13 | 287.337 | 142.581 | -104.52 | -471.405 |
| 16.31999999999975 | 154.926 | 266.52 | 334.942 | 346.971 | 288.332 | 143.689 | -103.348 | -470.23 |
| 16.32999999999975 | 155.16 | 266.973 | 335.6 | 347.814 | 289.328 | 144.799 | -102.174 | -469.052 |
| 16.33999999999975 | 155.395 | 267.427 | 336.259 | 348.656 | 290.324 | 145.91 | -100.999 | -467.873 |
| 16.34999999999976 | 155.63 | 267.881 | 336.919 | 349.5 | 291.322 | 147.022 | -99.822 | -466.692 |
| 16.35999999999976 | 155.865 | 268.335 | 337.579 | 350.345 | 292.32 | 148.135 | -98.644 | -465.509 |
| 16.36999999999976 | 156.1 | 268.79 | 338.239 | 351.19 | 293.32 | 149.249 | -97.465 | -464.324 |
| 16.37999999999976 | 156.336 | 269.245 | 338.901 | 352.036 | 294.321 | 150.365 | -96.283 | -463.138 |
| 16.38999999999976 | 156.571 | 269.7 | 339.562 | 352.882 | 295.322 | 151.482 | -95.101 | -461.95 |
| 16.39999999999976 | 156.807 | 270.156 | 340.225 | 353.73 | 296.325 | 152.6 | -93.916 | -460.76 |
| 16.40999999999977 | 157.043 | 270.612 | 340.887 | 354.578 | 297.329 | 153.72 | -92.731 | -459.568 |
| 16.41999999999977 | 157.279 | 271.068 | 341.551 | 355.427 | 298.333 | 154.841 | -91.543 | -458.374 |
| 16.42999999999977 | 157.515 | 271.525 | 342.215 | 356.277 | 299.339 | 155.962 | -90.354 | -457.179 |
| 16.43999999999977 | 157.752 | 271.982 | 342.879 | 357.128 | 300.345 | 157.086 | -89.164 | -455.982 |
| 16.44999999999977 | 157.988 | 272.439 | 343.544 | 357.979 | 301.353 | 158.21 | -87.972 | -454.783 |
| 16.45999999999977 | 158.225 | 272.897 | 344.21 | 358.831 | 302.362 | 159.336 | -86.779 | -453.582 |
| 16.46999999999978 | 158.462 | 273.355 | 344.876 | 359.684 | 303.371 | 160.463 | -85.584 | -452.379 |
| 16.47999999999978 | 158.699 | 273.813 | 345.542 | 360.538 | 304.382 | 161.591 | -84.388 | -451.175 |
| 16.48999999999978 | 158.936 | 274.272 | 346.21 | 361.392 | 305.394 | 162.72 | -83.19 | -449.969 |
| 16.49999999999978 | 159.173 | 274.731 | 346.877 | 362.247 | 306.406 | 163.851 | -81.991 | -448.761 |
| 16.50999999999978 | 159.411 | 275.191 | 347.546 | 363.103 | 307.42 | 164.983 | -80.79 | -447.551 |
| 16.51999999999978 | 159.649 | 275.651 | 348.215 | 363.96 | 308.434 | 166.116 | -79.587 | -446.34 |
| 16.52999999999978 | 159.887 | 276.111 | 348.884 | 364.817 | 309.45 | 167.251 | -78.383 | -445.126 |
| 16.53999999999979 | 160.125 | 276.571 | 349.554 | 365.676 | 310.467 | 168.386 | -77.178 | -443.911 |
| 16.54999999999979 | 160.363 | 277.032 | 350.225 | 366.535 | 311.484 | 169.523 | -75.971 | -442.694 |
| 16.55999999999979 | 160.601 | 277.494 | 350.896 | 367.394 | 312.503 | 170.662 | -74.763 | -441.475 |
| 16.56999999999979 | 160.84 | 277.955 | 351.567 | 368.255 | 313.523 | 171.801 | -73.553 | -440.255 |
| 16.57999999999979 | 161.079 | 278.417 | 352.24 | 369.116 | 314.543 | 172.942 | -72.341 | -439.033 |
| 16.58999999999979 | 161.318 | 278.879 | 352.912 | 369.978 | 315.565 | 174.084 | -71.128 | -437.809 |
| 16.5999999999998 | 161.557 | 279.342 | 353.586 | 370.841 | 316.587 | 175.227 | -69.914 | -436.583 |
| 16.6099999999998 | 161.796 | 279.805 | 354.259 | 371.705 | 317.611 | 176.371 | -68.698 | -435.355 |
| 16.6199999999998 | 162.035 | 280.268 | 354.934 | 372.569 | 318.636 | 177.517 | -67.48 | -434.126 |
| 16.6299999999998 | 162.275 | 280.732 | 355.609 | 373.434 | 319.661 | 178.664 | -66.261 | -432.894 |
| 16.6399999999998 | 162.515 | 281.196 | 356.284 | 374.3 | 320.688 | 179.812 | -65.041 | -431.661 |
| 16.6499999999998 | 162.755 | 281.661 | 356.96 | 375.167 | 321.716 | 180.962 | -63.818 | -430.426 |
| 16.6599999999998 | 162.995 | 282.126 | 357.637 | 376.035 | 322.744 | 182.112 | -62.595 | -429.19 |
| 16.66999999999981 | 163.235 | 282.591 | 358.314 | 376.903 | 323.774 | 183.264 | -61.37 | -427.951 |
| 16.67999999999981 | 163.476 | 283.056 | 358.992 | 377.772 | 324.804 | 184.417 | -60.143 | -426.711 |
| 16.68999999999981 | 163.716 | 283.522 | 359.67 | 378.642 | 325.836 | 185.572 | -58.915 | -425.469 |
| 16.69999999999981 | 163.957 | 283.988 | 360.349 | 379.512 | 326.869 | 186.727 | -57.685 | -424.225 |
| 16.70999999999981 | 164.198 | 284.455 | 361.028 | 380.383 | 327.902 | 187.884 | -56.454 | -422.98 |
| 16.71999999999981 | 164.439 | 284.922 | 361.708 | 381.256 | 328.937 | 189.042 | -55.222 | -421.732 |
| 16.72999999999982 | 164.68 | 285.389 | 362.389 | 382.128 | 329.973 | 190.202 | -53.988 | -420.483 |
| 16.73999999999982 | 164.922 | 285.856 | 363.07 | 383.002 | 331.009 | 191.362 | -52.752 | -419.232 |
| 16.74999999999982 | 165.163 | 286.324 | 363.751 | 383.876 | 332.047 | 192.524 | -51.515 | -417.98 |
| 16.75999999999982 | 165.405 | 286.793 | 364.433 | 384.752 | 333.085 | 193.688 | -50.276 | -416.725 |
| 16.76999999999982 | 165.647 | 287.261 | 365.116 | 385.627 | 334.125 | 194.852 | -49.036 | -415.469 |
| 16.77999999999982 | 165.889 | 287.73 | 365.799 | 386.504 | 335.166 | 196.018 | -47.794 | -414.211 |
| 16.78999999999982 | 166.131 | 288.2 | 366.483 | 387.382 | 336.207 | 197.184 | -46.551 | -412.951 |
| 16.79999999999983 | 166.374 | 288.669 | 367.167 | 388.26 | 337.25 | 198.353 | -45.306 | -411.689 |
| 16.80999999999983 | 166.616 | 289.14 | 367.852 | 389.139 | 338.294 | 199.522 | -44.06 | -410.425 |
| 16.81999999999983 | 166.859 | 289.61 | 368.538 | 390.019 | 339.338 | 200.693 | -42.812 | -409.16 |
| 16.82999999999983 | 167.102 | 290.081 | 369.224 | 390.899 | 340.384 | 201.865 | -41.563 | -407.893 |
| 16.83999999999983 | 167.345 | 290.552 | 369.91 | 391.78 | 341.43 | 203.038 | -40.312 | -406.624 |
| 16.84999999999983 | 167.589 | 291.023 | 370.597 | 392.662 | 342.478 | 204.212 | -39.06 | -405.354 |
| 16.85999999999984 | 167.832 | 291.495 | 371.285 | 393.545 | 343.527 | 205.388 | -37.806 | -404.081 |
| 16.86999999999984 | 168.076 | 291.967 | 371.973 | 394.429 | 344.576 | 206.565 | -36.551 | -402.807 |
| 16.87999999999984 | 168.319 | 292.44 | 372.662 | 395.313 | 345.627 | 207.743 | -35.294 | -401.531 |
| 16.88999999999984 | 168.563 | 292.913 | 373.351 | 396.198 | 346.679 | 208.922 | -34.035 | -400.253 |
| 16.89999999999984 | 168.808 | 293.386 | 374.041 | 397.084 | 347.731 | 210.103 | -32.776 | -398.973 |
| 16.90999999999984 | 169.052 | 293.86 | 374.732 | 397.971 | 348.785 | 211.285 | -31.514 | -397.692 |
| 16.91999999999985 | 169.296 | 294.333 | 375.423 | 398.858 | 349.839 | 212.468 | -30.251 | -396.409 |
| 16.92999999999985 | 169.541 | 294.808 | 376.114 | 399.747 | 350.895 | 213.652 | -28.987 | -395.124 |
| 16.93999999999985 | 169.786 | 295.282 | 376.806 | 400.636 | 351.952 | 214.838 | -27.721 | -393.837 |
| 16.94999999999985 | 170.031 | 295.757 | 377.499 | 401.525 | 353.009 | 216.025 | -26.454 | -392.548 |
| 16.95999999999985 | 170.276 | 296.233 | 378.192 | 402.416 | 354.068 | 217.213 | -25.185 | -391.258 |
| 16.96999999999985 | 170.521 | 296.708 | 378.886 | 403.307 | 355.128 | 218.402 | -23.914 | -389.966 |
| 16.97999999999985 | 170.767 | 297.184 | 379.58 | 404.199 | 356.188 | 219.593 | -22.642 | -388.672 |
| 16.98999999999986 | 171.012 | 297.661 | 380.275 | 405.092 | 357.25 | 220.784 | -21.369 | -387.376 |
| 16.99999999999986 | 171.258 | 298.138 | 380.97 | 405.986 | 358.312 | 221.978 | -20.094 | -386.078 |
| 17.00999999999986 | 171.504 | 298.615 | 381.666 | 406.88 | 359.376 | 223.172 | -18.817 | -384.779 |
| 17.01999999999986 | 171.75 | 299.092 | 382.363 | 407.775 | 360.441 | 224.368 | -17.539 | -383.478 |
| 17.02999999999986 | 171.997 | 299.57 | 383.06 | 408.671 | 361.506 | 225.564 | -16.26 | -382.175 |
| 17.03999999999986 | 172.243 | 300.048 | 383.757 | 409.568 | 362.573 | 226.762 | -14.979 | -380.87 |
| 17.04999999999987 | 172.49 | 300.527 | 384.455 | 410.465 | 363.641 | 227.962 | -13.696 | -379.564 |
| 17.05999999999987 | 172.736 | 301.006 | 385.154 | 411.363 | 364.709 | 229.162 | -12.412 | -378.255 |
| 17.06999999999987 | 172.983 | 301.485 | 385.853 | 412.262 | 365.779 | 230.364 | -11.127 | -376.945 |
| 17.07999999999987 | 173.231 | 301.964 | 386.553 | 413.162 | 366.849 | 231.567 | -9.84 | -375.633 |
| 17.08999999999987 | 173.478 | 302.444 | 387.253 | 414.062 | 367.921 | 232.772 | -8.551 | -374.32 |
| 17.09999999999987 | 173.725 | 302.924 | 387.954 | 414.964 | 368.994 | 233.977 | -7.261 | -373.004 |
| 17.10999999999988 | 173.973 | 303.405 | 388.656 | 415.866 | 370.067 | 235.184 | -5.969 | -371.687 |
| 17.11999999999988 | 174.221 | 303.886 | 389.358 | 416.769 | 371.142 | 236.392 | -4.676 | -370.368 |
| 17.12999999999988 | 174.469 | 304.367 | 390.06 | 417.672 | 372.218 | 237.602 | -3.382 | -369.047 |
| 17.13999999999988 | 174.717 | 304.849 | 390.763 | 418.576 | 373.294 | 238.812 | -2.085 | -367.725 |
| 17.14999999999988 | 174.965 | 305.331 | 391.467 | 419.482 | 374.372 | 240.024 | -0.788 | -366.4 |
| 17.15999999999988 | 175.214 | 305.814 | 392.171 | 420.387 | 375.45 | 241.237 | 0.511 | -365.074 |
| 17.16999999999988 | 175.463 | 306.296 | 392.876 | 421.294 | 376.53 | 242.451 | 1.812 | -363.746 |
| 17.17999999999989 | 175.711 | 306.779 | 393.581 | 422.201 | 377.611 | 243.667 | 3.114 | -362.416 |
| 17.18999999999989 | 175.96 | 307.263 | 394.287 | 423.11 | 378.692 | 244.884 | 4.418 | -361.084 |
| 17.19999999999989 | 176.21 | 307.747 | 394.994 | 424.019 | 379.775 | 246.102 | 5.723 | -359.751 |
| 17.20999999999989 | 176.459 | 308.231 | 395.701 | 424.928 | 380.859 | 247.321 | 7.03 | -358.416 |
| 17.21999999999989 | 176.708 | 308.715 | 396.408 | 425.839 | 381.943 | 248.542 | 8.338 | -357.079 |
| 17.22999999999989 | 176.958 | 309.2 | 397.116 | 426.75 | 383.029 | 249.763 | 9.648 | -355.74 |
| 17.2399999999999 | 177.208 | 309.685 | 397.825 | 427.662 | 384.115 | 250.986 | 10.959 | -354.4 |
| 17.2499999999999 | 177.458 | 310.171 | 398.534 | 428.575 | 385.203 | 252.211 | 12.272 | -353.057 |
| 17.2599999999999 | 177.708 | 310.657 | 399.244 | 429.488 | 386.292 | 253.436 | 13.586 | -351.713 |
| 17.2699999999999 | 177.958 | 311.143 | 399.954 | 430.403 | 387.381 | 254.663 | 14.902 | -350.367 |
| 17.2799999999999 | 178.209 | 311.63 | 400.665 | 431.318 | 388.472 | 255.891 | 16.219 | -349.019 |
| 17.2899999999999 | 178.46 | 312.117 | 401.376 | 432.234 | 389.564 | 257.12 | 17.538 | -347.67 |
| 17.2999999999999 | 178.71 | 312.604 | 402.088 | 433.15 | 390.656 | 258.351 | 18.858 | -346.319 |
| 17.30999999999991 | 178.962 | 313.092 | 402.801 | 434.068 | 391.75 | 259.583 | 20.18 | -344.965 |
| 17.31999999999991 | 179.213 | 313.58 | 403.514 | 434.986 | 392.844 | 260.816 | 21.504 | -343.611 |
| 17.32999999999991 | 179.464 | 314.068 | 404.227 | 435.905 | 393.94 | 262.05 | 22.829 | -342.254 |
| 17.33999999999991 | 179.716 | 314.557 | 404.941 | 436.824 | 395.037 | 263.286 | 24.155 | -340.895 |
| 17.34999999999991 | 179.967 | 315.046 | 405.656 | 437.745 | 396.134 | 264.522 | 25.483 | -339.535 |
| 17.35999999999991 | 180.219 | 315.535 | 406.371 | 438.666 | 397.233 | 265.761 | 26.812 | -338.173 |
| 17.36999999999992 | 180.471 | 316.025 | 407.087 | 439.588 | 398.333 | 267 | 28.143 | -336.809 |
| 17.37999999999992 | 180.723 | 316.515 | 407.803 | 440.511 | 399.433 | 268.24 | 29.476 | -335.444 |
| 17.38999999999992 | 180.976 | 317.005 | 408.52 | 441.434 | 400.535 | 269.482 | 30.81 | -334.076 |
| 17.39999999999992 | 181.228 | 317.496 | 409.238 | 442.359 | 401.637 | 270.725 | 32.145 | -332.707 |
| 17.40999999999992 | 181.481 | 317.988 | 409.956 | 443.284 | 402.741 | 271.969 | 33.482 | -331.336 |
| 17.41999999999992 | 181.734 | 318.479 | 410.674 | 444.21 | 403.846 | 273.215 | 34.82 | -329.963 |
| 17.42999999999993 | 181.987 | 318.971 | 411.394 | 445.136 | 404.951 | 274.462 | 36.16 | -328.588 |
| 17.43999999999993 | 182.24 | 319.463 | 412.113 | 446.064 | 406.058 | 275.71 | 37.502 | -327.212 |
| 17.44999999999993 | 182.493 | 319.956 | 412.833 | 446.992 | 407.166 | 276.959 | 38.845 | -325.834 |
| 17.45999999999993 | 182.747 | 320.449 | 413.554 | 447.921 | 408.274 | 278.209 | 40.19 | -324.454 |
| 17.46999999999993 | 183.001 | 320.942 | 414.275 | 448.85 | 409.384 | 279.461 | 41.536 | -323.072 |
| 17.47999999999993 | 183.254 | 321.436 | 414.997 | 449.781 | 410.494 | 280.714 | 42.883 | -321.689 |
| 17.48999999999993 | 183.509 | 321.93 | 415.72 | 450.712 | 411.606 | 281.968 | 44.232 | -320.303 |
| 17.49999999999994 | 183.763 | 322.424 | 416.443 | 451.644 | 412.719 | 283.224 | 45.583 | -318.916 |
| 17.50999999999994 | 184.017 | 322.919 | 417.166 | 452.577 | 413.832 | 284.481 | 46.935 | -317.527 |
| 17.51999999999994 | 184.272 | 323.414 | 417.89 | 453.51 | 414.947 | 285.739 | 48.288 | -316.136 |
| 17.52999999999994 | 184.526 | 323.909 | 418.615 | 454.445 | 416.063 | 286.998 | 49.644 | -314.744 |
| 17.53999999999994 | 184.781 | 324.405 | 419.34 | 455.38 | 417.179 | 288.258 | 51 | -313.349 |
| 17.54999999999994 | 185.036 | 324.901 | 420.066 | 456.315 | 418.297 | 289.52 | 52.358 | -311.953 |
| 17.55999999999995 | 185.292 | 325.398 | 420.792 | 457.252 | 419.415 | 290.783 | 53.718 | -310.555 |
| 17.56999999999995 | 185.547 | 325.894 | 421.519 | 458.189 | 420.535 | 292.047 | 55.079 | -309.156 |
| 17.57999999999995 | 185.802 | 326.391 | 422.246 | 459.128 | 421.656 | 293.313 | 56.442 | -307.754 |
| 17.58999999999995 | 186.058 | 326.889 | 422.974 | 460.066 | 422.777 | 294.58 | 57.806 | -306.351 |
| 17.59999999999995 | 186.314 | 327.387 | 423.703 | 461.006 | 423.9 | 295.848 | 59.172 | -304.946 |
| 17.60999999999995 | 186.57 | 327.885 | 424.432 | 461.947 | 425.024 | 297.117 | 60.539 | -303.539 |
| 17.61999999999995 | 186.826 | 328.384 | 425.162 | 462.888 | 426.148 | 298.387 | 61.908 | -302.13 |
| 17.62999999999996 | 187.083 | 328.883 | 425.892 | 463.83 | 427.274 | 299.659 | 63.278 | -300.72 |
| 17.63999999999996 | 187.339 | 329.382 | 426.622 | 464.772 | 428.4 | 300.932 | 64.65 | -299.308 |
| 17.64999999999996 | 187.596 | 329.882 | 427.354 | 465.716 | 429.528 | 302.206 | 66.023 | -297.894 |
| 17.65999999999996 | 187.853 | 330.382 | 428.085 | 466.66 | 430.657 | 303.482 | 67.398 | -296.478 |
| 17.66999999999996 | 188.11 | 330.882 | 428.818 | 467.605 | 431.786 | 304.759 | 68.774 | -295.06 |
| 17.67999999999996 | 188.367 | 331.383 | 429.551 | 468.551 | 432.917 | 306.036 | 70.152 | -293.641 |
| 17.68999999999997 | 188.625 | 331.884 | 430.284 | 469.498 | 434.049 | 307.316 | 71.531 | -292.22 |
| 17.69999999999997 | 188.882 | 332.385 | 431.018 | 470.445 | 435.181 | 308.596 | 72.912 | -290.797 |
| 17.70999999999997 | 189.14 | 332.887 | 431.753 | 471.393 | 436.315 | 309.878 | 74.294 | -289.372 |
| 17.71999999999997 | 189.398 | 333.389 | 432.488 | 472.342 | 437.449 | 311.161 | 75.678 | -287.945 |
| 17.72999999999997 | 189.656 | 333.891 | 433.224 | 473.292 | 438.585 | 312.445 | 77.063 | -286.517 |
| 17.73999999999997 | 189.914 | 334.394 | 433.96 | 474.242 | 439.722 | 313.73 | 78.45 | -285.087 |
| 17.74999999999998 | 190.173 | 334.897 | 434.697 | 475.193 | 440.859 | 315.017 | 79.839 | -283.655 |
| 17.75999999999998 | 190.431 | 335.401 | 435.434 | 476.145 | 441.998 | 316.305 | 81.228 | -282.221 |
| 17.76999999999998 | 190.69 | 335.905 | 436.172 | 477.098 | 443.138 | 317.594 | 82.62 | -280.786 |
| 17.77999999999998 | 190.949 | 336.409 | 436.91 | 478.051 | 444.278 | 318.885 | 84.013 | -279.348 |
| 17.78999999999998 | 191.208 | 336.913 | 437.649 | 479.006 | 445.42 | 320.176 | 85.407 | -277.909 |
| 17.79999999999998 | 191.467 | 337.418 | 438.389 | 479.961 | 446.562 | 321.469 | 86.803 | -276.468 |
| 17.80999999999998 | 191.727 | 337.924 | 439.129 | 480.916 | 447.706 | 322.764 | 88.201 | -275.025 |
| 17.81999999999999 | 191.986 | 338.429 | 439.869 | 481.873 | 448.851 | 324.059 | 89.6 | -273.581 |
| 17.82999999999999 | 192.246 | 338.935 | 440.611 | 482.83 | 449.996 | 325.356 | 91 | -272.135 |
| 17.83999999999999 | 192.506 | 339.441 | 441.352 | 483.788 | 451.143 | 326.654 | 92.402 | -270.687 |
| 17.84999999999999 | 192.766 | 339.948 | 442.095 | 484.747 | 452.291 | 327.953 | 93.806 | -269.237 |
| 17.85999999999999 | 193.026 | 340.455 | 442.838 | 485.707 | 453.439 | 329.253 | 95.211 | -267.785 |
| 17.86999999999999 | 193.287 | 340.962 | 443.581 | 486.667 | 454.589 | 330.555 | 96.617 | -266.332 |
| 17.88 | 193.547 | 341.47 | 444.325 | 487.628 | 455.739 | 331.858 | 98.025 | -264.876 |
| 17.89 | 193.808 | 341.978 | 445.069 | 488.59 | 456.891 | 333.162 | 99.435 | -263.419 |
| 17.9 | 194.069 | 342.487 | 445.814 | 489.553 | 458.044 | 334.468 | 100.846 | -261.96 |
| 17.91 | 194.33 | 342.996 | 446.56 | 490.517 | 459.197 | 335.774 | 102.258 | -260.5 |
| 17.92 | 194.591 | 343.505 | 447.306 | 491.481 | 460.352 | 337.082 | 103.672 | -259.037 |
| 17.93 | 194.853 | 344.014 | 448.053 | 492.446 | 461.508 | 338.391 | 105.088 | -257.573 |
| 17.94 | 195.114 | 344.524 | 448.8 | 493.412 | 462.664 | 339.702 | 106.505 | -256.107 |
| 17.95000000000001 | 195.376 | 345.034 | 449.548 | 494.378 | 463.822 | 341.013 | 107.924 | -254.639 |
| 17.96000000000001 | 195.638 | 345.545 | 450.296 | 495.345 | 464.981 | 342.326 | 109.344 | -253.17 |
| 17.97000000000001 | 195.9 | 346.056 | 451.045 | 496.314 | 466.14 | 343.64 | 110.765 | -251.698 |
| 17.98000000000001 | 196.162 | 346.567 | 451.795 | 497.282 | 467.301 | 344.956 | 112.189 | -250.225 |
| 17.99000000000001 | 196.425 | 347.078 | 452.545 | 498.252 | 468.462 | 346.272 | 113.613 | -248.75 |
| 18.00000000000001 | 196.687 | 347.59 | 453.295 | 499.222 | 469.625 | 347.59 | 115.039 | -247.274 |
| 18.01000000000002 | 196.95 | 348.103 | 454.047 | 500.194 | 470.789 | 348.91 | 116.467 | -245.795 |
| 18.02000000000002 | 197.213 | 348.615 | 454.798 | 501.165 | 471.953 | 350.23 | 117.896 | -244.315 |
| 18.03000000000002 | 197.476 | 349.128 | 455.55 | 502.138 | 473.119 | 351.552 | 119.327 | -242.833 |
| 18.04000000000002 | 197.74 | 349.642 | 456.303 | 503.112 | 474.286 | 352.874 | 120.759 | -241.349 |
| 18.05000000000002 | 198.003 | 350.155 | 457.057 | 504.086 | 475.453 | 354.199 | 122.193 | -239.863 |
| 18.06000000000002 | 198.267 | 350.67 | 457.81 | 505.061 | 476.622 | 355.524 | 123.628 | -238.375 |
| 18.07000000000003 | 198.53 | 351.184 | 458.565 | 506.037 | 477.791 | 356.851 | 125.065 | -236.886 |
| 18.08000000000003 | 198.794 | 351.699 | 459.32 | 507.013 | 478.962 | 358.179 | 126.503 | -235.395 |
| 18.09000000000003 | 199.058 | 352.214 | 460.075 | 507.99 | 480.134 | 359.508 | 127.943 | -233.902 |
| 18.10000000000003 | 199.323 | 352.729 | 460.832 | 508.968 | 481.306 | 360.838 | 129.384 | -232.408 |
| 18.11000000000003 | 199.587 | 353.245 | 461.588 | 509.947 | 482.48 | 362.17 | 130.827 | -230.911 |
| 18.12000000000003 | 199.852 | 353.761 | 462.345 | 510.927 | 483.655 | 363.503 | 132.271 | -229.413 |
| 18.13000000000003 | 200.117 | 354.278 | 463.103 | 511.907 | 484.83 | 364.837 | 133.717 | -227.913 |
| 18.14000000000004 | 200.382 | 354.795 | 463.861 | 512.888 | 486.007 | 366.172 | 135.165 | -226.411 |
| 18.15000000000004 | 200.647 | 355.312 | 464.62 | 513.87 | 487.184 | 367.509 | 136.613 | -224.907 |
| 18.16000000000004 | 200.912 | 355.83 | 465.38 | 514.853 | 488.363 | 368.847 | 138.064 | -223.402 |
| 18.17000000000004 | 201.177 | 356.347 | 466.14 | 515.836 | 489.543 | 370.186 | 139.516 | -221.895 |
| 18.18000000000004 | 201.443 | 356.866 | 466.9 | 516.821 | 490.723 | 371.526 | 140.969 | -220.386 |
| 18.19000000000004 | 201.709 | 357.384 | 467.661 | 517.806 | 491.905 | 372.868 | 142.424 | -218.875 |
| 18.20000000000005 | 201.975 | 357.903 | 468.423 | 518.791 | 493.088 | 374.211 | 143.88 | -217.362 |
| 18.21000000000005 | 202.241 | 358.423 | 469.185 | 519.778 | 494.271 | 375.555 | 145.338 | -215.848 |
| 18.22000000000005 | 202.507 | 358.942 | 469.948 | 520.765 | 495.456 | 376.9 | 146.798 | -214.332 |
| 18.23000000000005 | 202.774 | 359.462 | 470.711 | 521.753 | 496.641 | 378.247 | 148.259 | -212.814 |
| 18.24000000000005 | 203.04 | 359.983 | 471.475 | 522.742 | 497.828 | 379.594 | 149.721 | -211.294 |
| 18.25000000000005 | 203.307 | 360.504 | 472.239 | 523.732 | 499.016 | 380.944 | 151.185 | -209.772 |
| 18.26000000000005 | 203.574 | 361.025 | 473.004 | 524.722 | 500.204 | 382.294 | 152.651 | -208.249 |
| 18.27000000000006 | 203.841 | 361.546 | 473.77 | 525.713 | 501.394 | 383.646 | 154.118 | -206.724 |
| 18.28000000000006 | 204.109 | 362.068 | 474.536 | 526.705 | 502.585 | 384.998 | 155.586 | -205.197 |
| 18.29000000000006 | 204.376 | 362.59 | 475.302 | 527.698 | 503.776 | 386.352 | 157.056 | -203.668 |
| 18.30000000000006 | 204.644 | 363.113 | 476.069 | 528.691 | 504.969 | 387.708 | 158.528 | -202.138 |
| 18.31000000000006 | 204.912 | 363.636 | 476.837 | 529.685 | 506.162 | 389.064 | 160.001 | -200.605 |
| 18.32000000000006 | 205.18 | 364.159 | 477.605 | 530.68 | 507.357 | 390.422 | 161.475 | -199.071 |
| 18.33000000000007 | 205.448 | 364.682 | 478.374 | 531.676 | 508.553 | 391.781 | 162.951 | -197.535 |
| 18.34000000000007 | 205.716 | 365.206 | 479.143 | 532.672 | 509.749 | 393.142 | 164.429 | -195.998 |
| 18.35000000000007 | 205.985 | 365.73 | 479.913 | 533.67 | 510.947 | 394.503 | 165.908 | -194.458 |
| 18.36000000000007 | 206.253 | 366.255 | 480.684 | 534.668 | 512.146 | 395.866 | 167.389 | -192.917 |
| 18.37000000000007 | 206.522 | 366.78 | 481.455 | 535.667 | 513.345 | 397.23 | 168.871 | -191.374 |
| 18.38000000000007 | 206.791 | 367.305 | 482.226 | 536.666 | 514.546 | 398.596 | 170.355 | -189.829 |
| 18.39000000000008 | 207.06 | 367.831 | 482.998 | 537.666 | 515.747 | 399.962 | 171.84 | -188.283 |
| 18.40000000000008 | 207.33 | 368.357 | 483.771 | 538.668 | 516.95 | 401.33 | 173.326 | -186.734 |
| 18.41000000000008 | 207.599 | 368.884 | 484.544 | 539.669 | 518.154 | 402.699 | 174.814 | -185.184 |
| 18.42000000000008 | 207.869 | 369.41 | 485.318 | 540.672 | 519.358 | 404.069 | 176.304 | -183.632 |
| 18.43000000000008 | 208.139 | 369.937 | 486.092 | 541.675 | 520.564 | 405.441 | 177.795 | -182.078 |
| 18.44000000000008 | 208.409 | 370.465 | 486.867 | 542.68 | 521.771 | 406.814 | 179.288 | -180.522 |
| 18.45000000000008 | 208.679 | 370.993 | 487.643 | 543.685 | 522.978 | 408.188 | 180.782 | -178.965 |
| 18.46000000000009 | 208.949 | 371.521 | 488.419 | 544.69 | 524.187 | 409.563 | 182.278 | -177.406 |
| 18.47000000000009 | 209.22 | 372.049 | 489.195 | 545.697 | 525.396 | 410.94 | 183.775 | -175.845 |
| 18.48000000000009 | 209.49 | 372.578 | 489.972 | 546.704 | 526.607 | 412.317 | 185.274 | -174.282 |
| 18.49000000000009 | 209.761 | 373.107 | 490.75 | 547.712 | 527.819 | 413.696 | 186.774 | -172.718 |
| 18.50000000000009 | 210.032 | 373.637 | 491.528 | 548.721 | 529.031 | 415.077 | 188.276 | -171.151 |
| 18.51000000000009 | 210.303 | 374.167 | 492.307 | 549.73 | 530.245 | 416.458 | 189.779 | -169.583 |
| 18.5200000000001 | 210.575 | 374.697 | 493.086 | 550.741 | 531.46 | 417.841 | 191.284 | -168.013 |
| 18.5300000000001 | 210.846 | 375.228 | 493.866 | 551.752 | 532.675 | 419.225 | 192.79 | -166.441 |
| 18.5400000000001 | 211.118 | 375.759 | 494.646 | 552.764 | 533.892 | 420.61 | 194.298 | -164.868 |
| 18.5500000000001 | 211.39 | 376.29 | 495.427 | 553.776 | 535.109 | 421.997 | 195.808 | -163.293 |
| 18.5600000000001 | 211.662 | 376.822 | 496.209 | 554.79 | 536.328 | 423.385 | 197.318 | -161.715 |
| 18.5700000000001 | 211.934 | 377.354 | 496.991 | 555.804 | 537.548 | 424.774 | 198.831 | -160.137 |
| 18.5800000000001 | 212.206 | 377.886 | 497.773 | 556.819 | 538.768 | 426.164 | 200.345 | -158.556 |
| 18.59000000000011 | 212.479 | 378.419 | 498.556 | 557.834 | 539.99 | 427.556 | 201.86 | -156.973 |
| 18.60000000000011 | 212.751 | 378.952 | 499.34 | 558.851 | 541.213 | 428.948 | 203.377 | -155.389 |
| 18.61000000000011 | 213.024 | 379.485 | 500.124 | 559.868 | 542.436 | 430.343 | 204.895 | -153.803 |
| 18.62000000000011 | 213.297 | 380.019 | 500.909 | 560.886 | 543.661 | 431.738 | 206.415 | -152.215 |
| 18.63000000000011 | 213.57 | 380.553 | 501.695 | 561.905 | 544.886 | 433.134 | 207.937 | -150.626 |
| 18.64000000000011 | 213.844 | 381.087 | 502.48 | 562.924 | 546.113 | 434.532 | 209.46 | -149.034 |
| 18.65000000000012 | 214.117 | 381.622 | 503.267 | 563.945 | 547.341 | 435.931 | 210.984 | -147.441 |
| 18.66000000000012 | 214.391 | 382.158 | 504.054 | 564.966 | 548.569 | 437.331 | 212.51 | -145.846 |
| 18.67000000000012 | 214.665 | 382.693 | 504.842 | 565.988 | 549.799 | 438.733 | 214.038 | -144.249 |
| 18.68000000000012 | 214.939 | 383.229 | 505.63 | 567.01 | 551.03 | 440.136 | 215.567 | -142.65 |
| 18.69000000000012 | 215.213 | 383.765 | 506.418 | 568.034 | 552.261 | 441.54 | 217.097 | -141.05 |
| 18.70000000000012 | 215.488 | 384.302 | 507.208 | 569.058 | 553.494 | 442.945 | 218.629 | -139.448 |
| 18.71000000000013 | 215.762 | 384.839 | 507.997 | 570.083 | 554.727 | 444.351 | 220.163 | -137.844 |
| 18.72000000000013 | 216.037 | 385.376 | 508.788 | 571.108 | 555.962 | 445.759 | 221.698 | -136.238 |
| 18.73000000000013 | 216.312 | 385.914 | 509.578 | 572.135 | 557.198 | 447.168 | 223.234 | -134.631 |
| 18.74000000000013 | 216.587 | 386.452 | 510.37 | 573.162 | 558.434 | 448.578 | 224.772 | -133.021 |
| 18.75000000000013 | 216.862 | 386.99 | 511.162 | 574.19 | 559.672 | 449.99 | 226.312 | -131.41 |
| 18.76000000000013 | 217.137 | 387.529 | 511.954 | 575.219 | 560.911 | 451.403 | 227.853 | -129.797 |
| 18.77000000000013 | 217.413 | 388.068 | 512.747 | 576.248 | 562.15 | 452.817 | 229.396 | -128.182 |
| 18.78000000000014 | 217.689 | 388.607 | 513.541 | 577.279 | 563.391 | 454.232 | 230.94 | -126.566 |
| 18.79000000000014 | 217.964 | 389.147 | 514.335 | 578.31 | 564.632 | 455.648 | 232.485 | -124.947 |
| 18.80000000000014 | 218.24 | 389.687 | 515.13 | 579.341 | 565.875 | 457.066 | 234.032 | -123.327 |
| 18.81000000000014 | 218.517 | 390.228 | 515.925 | 580.374 | 567.119 | 458.485 | 235.581 | -121.705 |
| 18.82000000000014 | 218.793 | 390.768 | 516.721 | 581.407 | 568.363 | 459.905 | 237.131 | -120.082 |
| 18.83000000000014 | 219.07 | 391.309 | 517.518 | 582.442 | 569.609 | 461.327 | 238.683 | -118.456 |
| 18.84000000000015 | 219.346 | 391.851 | 518.315 | 583.476 | 570.856 | 462.75 | 240.236 | -116.829 |
| 18.85000000000015 | 219.623 | 392.393 | 519.112 | 584.512 | 572.103 | 464.174 | 241.791 | -115.2 |
| 18.86000000000015 | 219.9 | 392.935 | 519.91 | 585.549 | 573.352 | 465.599 | 243.347 | -113.569 |
| 18.87000000000015 | 220.177 | 393.478 | 520.709 | 586.586 | 574.601 | 467.025 | 244.905 | -111.936 |
| 18.88000000000015 | 220.455 | 394.021 | 521.508 | 587.624 | 575.852 | 468.453 | 246.464 | -110.302 |
| 18.89000000000015 | 220.732 | 394.564 | 522.308 | 588.662 | 577.104 | 469.882 | 248.025 | -108.666 |
| 18.90000000000015 | 221.01 | 395.108 | 523.108 | 589.702 | 578.356 | 471.312 | 249.587 | -107.028 |
| 18.91000000000016 | 221.288 | 395.652 | 523.909 | 590.742 | 579.61 | 472.744 | 251.151 | -105.388 |
| 18.92000000000016 | 221.566 | 396.196 | 524.71 | 591.783 | 580.865 | 474.177 | 252.716 | -103.746 |
| 18.93000000000016 | 221.844 | 396.741 | 525.512 | 592.825 | 582.12 | 475.61 | 254.283 | -102.103 |
| 18.94000000000016 | 222.123 | 397.286 | 526.314 | 593.868 | 583.377 | 477.046 | 255.851 | -100.458 |
| 18.95000000000016 | 222.401 | 397.831 | 527.117 | 594.911 | 584.634 | 478.482 | 257.421 | -98.811 |
| 18.96000000000016 | 222.68 | 398.377 | 527.921 | 595.955 | 585.893 | 479.92 | 258.992 | -97.162 |
| 18.97000000000017 | 222.959 | 398.923 | 528.725 | 597 | 587.153 | 481.359 | 260.565 | -95.511 |
| 18.98000000000017 | 223.238 | 399.469 | 529.53 | 598.046 | 588.413 | 482.799 | 262.139 | -93.859 |
| 18.99000000000017 | 223.517 | 400.016 | 530.335 | 599.092 | 589.675 | 484.24 | 263.715 | -92.205 |
| 19.00000000000017 | 223.797 | 400.563 | 531.141 | 600.139 | 590.938 | 485.683 | 265.293 | -90.549 |
| 19.01000000000017 | 224.076 | 401.111 | 531.947 | 601.187 | 592.201 | 487.127 | 266.872 | -88.891 |
| 19.02000000000017 | 224.356 | 401.659 | 532.754 | 602.236 | 593.466 | 488.572 | 268.452 | -87.232 |
| 19.03000000000018 | 224.636 | 402.207 | 533.561 | 603.285 | 594.731 | 490.019 | 270.034 | -85.57 |
| 19.04000000000018 | 224.916 | 402.755 | 534.369 | 604.336 | 595.998 | 491.466 | 271.617 | -83.907 |
| 19.05000000000018 | 225.196 | 403.304 | 535.178 | 605.387 | 597.266 | 492.915 | 273.202 | -82.242 |
| 19.06000000000018 | 225.477 | 403.854 | 535.987 | 606.438 | 598.534 | 494.366 | 274.789 | -80.575 |
| 19.07000000000018 | 225.757 | 404.403 | 536.797 | 607.491 | 599.804 | 495.817 | 276.377 | -78.907 |
| 19.08000000000018 | 226.038 | 404.953 | 537.607 | 608.544 | 601.075 | 497.27 | 277.966 | -77.237 |
| 19.09000000000018 | 226.319 | 405.503 | 538.418 | 609.598 | 602.346 | 498.724 | 279.557 | -75.565 |
| 19.10000000000019 | 226.6 | 406.054 | 539.229 | 610.653 | 603.619 | 500.179 | 281.15 | -73.891 |
| 19.11000000000019 | 226.881 | 406.605 | 540.041 | 611.709 | 604.892 | 501.635 | 282.744 | -72.215 |
| 19.12000000000019 | 227.163 | 407.156 | 540.853 | 612.765 | 606.167 | 503.093 | 284.339 | -70.538 |
| 19.1300000000002 | 227.444 | 407.708 | 541.666 | 613.822 | 607.443 | 504.552 | 285.936 | -68.858 |
| 19.14000000000019 | 227.726 | 408.26 | 542.48 | 614.88 | 608.719 | 506.012 | 287.535 | -67.177 |
| 19.15000000000019 | 228.008 | 408.813 | 543.294 | 615.939 | 609.997 | 507.474 | 289.135 | -65.494 |
| 19.1600000000002 | 228.29 | 409.366 | 544.108 | 616.999 | 611.276 | 508.936 | 290.736 | -63.81 |
| 19.1700000000002 | 228.572 | 409.919 | 544.923 | 618.059 | 612.555 | 510.4 | 292.339 | -62.123 |
| 19.1800000000002 | 228.855 | 410.472 | 545.739 | 619.12 | 613.836 | 511.865 | 293.944 | -60.435 |
| 19.1900000000002 | 229.137 | 411.026 | 546.555 | 620.182 | 615.117 | 513.332 | 295.55 | -58.745 |
| 19.2000000000002 | 229.42 | 411.58 | 547.372 | 621.244 | 616.4 | 514.799 | 297.158 | -57.053 |
| 19.2100000000002 | 229.703 | 412.135 | 548.19 | 622.307 | 617.684 | 516.268 | 298.767 | -55.36 |
| 19.2200000000002 | 229.986 | 412.69 | 549.007 | 623.372 | 618.968 | 517.738 | 300.378 | -53.664 |
| 19.23000000000021 | 230.269 | 413.245 | 549.826 | 624.436 | 620.254 | 519.21 | 301.99 | -51.967 |
| 19.24000000000021 | 230.553 | 413.8 | 550.645 | 625.502 | 621.541 | 520.682 | 303.603 | -50.268 |
| 19.25000000000021 | 230.837 | 414.356 | 551.465 | 626.568 | 622.828 | 522.156 | 305.219 | -48.568 |
| 19.26000000000021 | 231.12 | 414.913 | 552.285 | 627.636 | 624.117 | 523.632 | 306.835 | -46.865 |
| 19.27000000000021 | 231.404 | 415.469 | 553.105 | 628.703 | 625.406 | 525.108 | 308.453 | -45.161 |
| 19.28000000000021 | 231.688 | 416.026 | 553.927 | 629.772 | 626.697 | 526.586 | 310.073 | -43.455 |
| 19.29000000000022 | 231.973 | 416.584 | 554.748 | 630.842 | 627.989 | 528.064 | 311.694 | -41.747 |
| 19.30000000000022 | 232.257 | 417.141 | 555.571 | 631.912 | 629.281 | 529.545 | 313.317 | -40.037 |
| 19.31000000000022 | 232.542 | 417.7 | 556.394 | 632.983 | 630.575 | 531.026 | 314.941 | -38.325 |
| 19.32000000000022 | 232.826 | 418.258 | 557.217 | 634.055 | 631.87 | 532.509 | 316.567 | -36.612 |
| 19.33000000000022 | 233.111 | 418.817 | 558.041 | 635.127 | 633.165 | 533.993 | 318.194 | -34.897 |
| 19.34000000000022 | 233.397 | 419.376 | 558.866 | 636.2 | 634.462 | 535.478 | 319.823 | -33.18 |
| 19.35000000000023 | 233.682 | 419.935 | 559.691 | 637.274 | 635.759 | 536.964 | 321.453 | -31.462 |
| 19.36000000000023 | 233.967 | 420.495 | 560.516 | 638.349 | 637.058 | 538.452 | 323.085 | -29.741 |
| 19.37000000000023 | 234.253 | 421.055 | 561.343 | 639.425 | 638.358 | 539.941 | 324.719 | -28.019 |
| 19.38000000000023 | 234.539 | 421.616 | 562.169 | 640.501 | 639.658 | 541.431 | 326.353 | -26.295 |
| 19.39000000000023 | 234.825 | 422.177 | 562.997 | 641.578 | 640.96 | 542.922 | 327.99 | -24.569 |
| 19.40000000000023 | 235.111 | 422.738 | 563.824 | 642.656 | 642.263 | 544.415 | 329.628 | -22.841 |
| 19.41000000000023 | 235.397 | 423.3 | 564.653 | 643.735 | 643.566 | 545.909 | 331.267 | -21.112 |
| 19.42000000000024 | 235.684 | 423.861 | 565.482 | 644.814 | 644.871 | 547.404 | 332.908 | -19.381 |
| 19.43000000000024 | 235.97 | 424.424 | 566.311 | 645.895 | 646.176 | 548.9 | 334.55 | -17.648 |
| 19.44000000000024 | 236.257 | 424.986 | 567.141 | 646.976 | 647.483 | 550.398 | 336.194 | -15.913 |
| 19.45000000000024 | 236.544 | 425.549 | 567.972 | 648.057 | 648.791 | 551.897 | 337.84 | -14.176 |
| 19.46000000000024 | 236.831 | 426.113 | 568.803 | 649.14 | 650.099 | 553.397 | 339.487 | -12.438 |
| 19.47000000000024 | 237.118 | 426.676 | 569.635 | 650.223 | 651.409 | 554.898 | 341.135 | -10.698 |
| 19.48000000000025 | 237.406 | 427.24 | 570.467 | 651.307 | 652.72 | 556.401 | 342.785 | -8.956 |
| 19.49000000000025 | 237.694 | 427.805 | 571.3 | 652.392 | 654.031 | 557.904 | 344.436 | -7.212 |
| 19.50000000000025 | 237.981 | 428.37 | 572.133 | 653.478 | 655.344 | 559.41 | 346.089 | -5.466 |
| 19.51000000000025 | 238.269 | 428.935 | 572.967 | 654.564 | 656.657 | 560.916 | 347.744 | -3.719 |
| 19.52000000000025 | 238.557 | 429.5 | 573.802 | 655.651 | 657.972 | 562.424 | 349.4 | -1.97 |
| 19.53000000000025 | 238.846 | 430.066 | 574.637 | 656.739 | 659.288 | 563.932 | 351.057 | -0.219 |
| 19.54000000000025 | 239.134 | 430.632 | 575.472 | 657.828 | 660.604 | 565.442 | 352.716 | 1.534 |
| 19.55000000000026 | 239.423 | 431.199 | 576.309 | 658.917 | 661.922 | 566.954 | 354.377 | 3.288 |
| 19.56000000000026 | 239.712 | 431.766 | 577.145 | 660.007 | 663.241 | 568.466 | 356.039 | 5.045 |
| 19.57000000000026 | 240.001 | 432.333 | 577.982 | 661.098 | 664.56 | 569.98 | 357.703 | 6.803 |
| 19.58000000000026 | 240.29 | 432.9 | 578.82 | 662.19 | 665.881 | 571.495 | 359.368 | 8.563 |
| 19.59000000000026 | 240.579 | 433.468 | 579.659 | 663.282 | 667.202 | 573.012 | 361.034 | 10.324 |
| 19.60000000000026 | 240.869 | 434.036 | 580.497 | 664.376 | 668.525 | 574.529 | 362.702 | 12.088 |
| 19.61000000000027 | 241.158 | 434.605 | 581.337 | 665.47 | 669.849 | 576.048 | 364.372 | 13.853 |
| 19.62000000000027 | 241.448 | 435.174 | 582.177 | 666.565 | 671.173 | 577.568 | 366.043 | 15.62 |
| 19.63000000000027 | 241.738 | 435.743 | 583.017 | 667.66 | 672.499 | 579.09 | 367.716 | 17.389 |
| 19.64000000000027 | 242.028 | 436.313 | 583.859 | 668.756 | 673.826 | 580.612 | 369.39 | 19.159 |
| 19.65000000000027 | 242.319 | 436.883 | 584.7 | 669.854 | 675.153 | 582.136 | 371.065 | 20.932 |
| 19.66000000000027 | 242.609 | 437.454 | 585.542 | 670.951 | 676.482 | 583.661 | 372.743 | 22.706 |
| 19.67000000000028 | 242.9 | 438.024 | 586.385 | 672.05 | 677.811 | 585.187 | 374.421 | 24.482 |
| 19.68000000000028 | 243.191 | 438.595 | 587.229 | 673.149 | 679.142 | 586.715 | 376.101 | 26.26 |
| 19.69000000000028 | 243.482 | 439.167 | 588.072 | 674.25 | 680.474 | 588.244 | 377.783 | 28.04 |
| 19.70000000000028 | 243.773 | 439.739 | 588.917 | 675.351 | 681.806 | 589.774 | 379.466 | 29.821 |
| 19.71000000000028 | 244.064 | 440.311 | 589.762 | 676.452 | 683.14 | 591.305 | 381.151 | 31.604 |
| 19.72000000000028 | 244.356 | 440.883 | 590.607 | 677.555 | 684.475 | 592.838 | 382.837 | 33.389 |
| 19.73000000000028 | 244.647 | 441.456 | 591.453 | 678.658 | 685.81 | 594.371 | 384.525 | 35.176 |
| 19.74000000000029 | 244.939 | 442.029 | 592.3 | 679.762 | 687.147 | 595.906 | 386.214 | 36.964 |
| 19.75000000000029 | 245.231 | 442.603 | 593.147 | 680.867 | 688.484 | 597.443 | 387.905 | 38.755 |
| 19.76000000000029 | 245.523 | 443.177 | 593.995 | 681.972 | 689.823 | 598.98 | 389.597 | 40.547 |
| 19.77000000000029 | 245.816 | 443.751 | 594.843 | 683.079 | 691.163 | 600.519 | 391.291 | 42.341 |
| 19.78000000000029 | 246.108 | 444.326 | 595.692 | 684.186 | 692.503 | 602.059 | 392.987 | 44.137 |
| 19.79000000000029 | 246.401 | 444.901 | 596.541 | 685.294 | 693.845 | 603.6 | 394.683 | 45.934 |
| 19.8000000000003 | 246.694 | 445.476 | 597.391 | 686.402 | 695.188 | 605.143 | 396.382 | 47.733 |
| 19.8100000000003 | 246.987 | 446.052 | 598.242 | 687.512 | 696.531 | 606.687 | 398.082 | 49.535 |
| 19.8200000000003 | 247.28 | 446.628 | 599.093 | 688.622 | 697.876 | 608.232 | 399.783 | 51.337 |
| 19.8300000000003 | 247.573 | 447.204 | 599.944 | 689.733 | 699.221 | 609.778 | 401.486 | 53.142 |
| 19.8400000000003 | 247.867 | 447.781 | 600.797 | 690.844 | 700.568 | 611.326 | 403.19 | 54.949 |
| 19.8500000000003 | 248.161 | 448.358 | 601.649 | 691.957 | 701.916 | 612.874 | 404.896 | 56.757 |
| 19.8600000000003 | 248.454 | 448.935 | 602.503 | 693.07 | 703.264 | 614.425 | 406.604 | 58.567 |
| 19.87000000000031 | 248.748 | 449.513 | 603.356 | 694.184 | 704.614 | 615.976 | 408.312 | 60.379 |
| 19.88000000000031 | 249.043 | 450.091 | 604.211 | 695.299 | 705.965 | 617.528 | 410.023 | 62.192 |
| 19.89000000000031 | 249.337 | 450.669 | 605.066 | 696.414 | 707.316 | 619.082 | 411.735 | 64.008 |
| 19.90000000000031 | 249.631 | 451.248 | 605.921 | 697.531 | 708.669 | 620.637 | 413.448 | 65.825 |
| 19.91000000000031 | 249.926 | 451.828 | 606.777 | 698.648 | 710.022 | 622.193 | 415.163 | 67.644 |
| 19.92000000000031 | 250.221 | 452.407 | 607.634 | 699.766 | 711.377 | 623.751 | 416.88 | 69.465 |
| 19.93000000000032 | 250.516 | 452.987 | 608.491 | 700.884 | 712.733 | 625.31 | 418.598 | 71.288 |
| 19.94000000000032 | 250.811 | 453.567 | 609.348 | 702.004 | 714.089 | 626.87 | 420.317 | 73.112 |
| 19.95000000000032 | 251.107 | 454.148 | 610.207 | 703.124 | 715.447 | 628.431 | 422.038 | 74.938 |
| 19.96000000000032 | 251.402 | 454.729 | 611.065 | 704.245 | 716.806 | 629.993 | 423.761 | 76.766 |
| 19.97000000000032 | 251.698 | 455.31 | 611.925 | 705.366 | 718.165 | 631.557 | 425.485 | 78.596 |
| 19.98000000000032 | 251.994 | 455.892 | 612.785 | 706.489 | 719.526 | 633.122 | 427.21 | 80.427 |
| 19.99000000000033 | 252.29 | 456.474 | 613.645 | 707.612 | 720.887 | 634.688 | 428.937 | 82.261 |
| 20.00000000000033 | 252.586 | 457.056 | 614.506 | 708.736 | 722.25 | 636.256 | 430.666 | 84.096 |